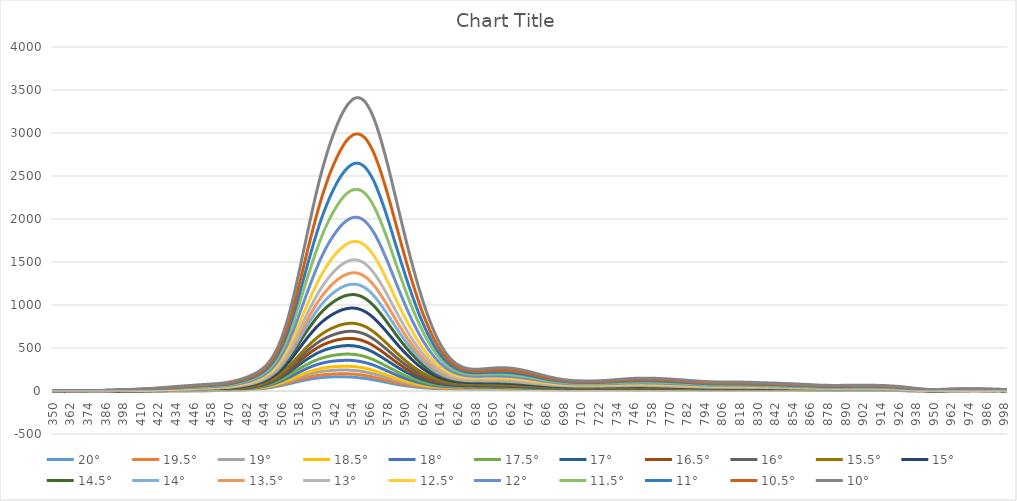
| Category | 20° | 19.5° | 19° | 18.5° | 18° | 17.5° | 17° | 16.5° | 16° | 15.5° | 15° | 14.5° | 14° | 13.5° | 13° | 12.5° | 12° | 11.5° | 11° | 10.5° | 10° |
|---|---|---|---|---|---|---|---|---|---|---|---|---|---|---|---|---|---|---|---|---|---|
| 350.0 | 1.52 | -0.59 | 0.26 | -0.31 | -1.47 | -1.32 | 0.79 | -0.45 | -0.72 | -1.17 | -0.01 | -0.98 | 0.43 | 0 | -0.06 | 1.21 | 1.59 | 1.07 | 0.85 | 0.5 | 2.93 |
| 351.0 | -1.15 | -1.71 | 1.3 | -3.11 | -1.22 | 1.24 | -2.55 | -0.75 | -0.83 | -0.73 | -0.71 | -2.25 | -0.19 | -0.07 | -0.47 | 0.65 | -0.83 | 0.38 | -0.15 | -0.22 | -1.25 |
| 352.0 | -2.8 | -3.49 | -2.21 | -5.01 | -5.15 | -3.96 | -3.53 | -0.44 | -1.16 | -2.94 | -5.09 | -3.12 | -2.6 | -2.66 | -4.13 | -4.14 | -2.17 | -2.5 | -2.17 | -0.65 | -0.27 |
| 353.0 | 0.55 | -0.15 | 0.27 | -0.79 | -1.43 | -0.35 | 1.25 | -0.98 | 1.07 | 1.13 | -1.53 | -0.49 | 0.92 | -0.69 | 2.54 | 2.76 | -0.43 | 1.66 | 1.54 | 3.29 | 1.27 |
| 354.0 | -1.59 | -3.32 | -1.5 | -2.14 | -2.57 | -1.73 | -1.11 | -3.06 | -3.25 | -0.67 | -2.63 | -0.78 | -4.19 | -2.53 | -1.61 | -0.76 | -0.88 | 0.35 | 0.96 | 0.85 | 0.75 |
| 355.0 | -0.29 | 0.77 | 1.08 | 0.32 | 0.42 | -0.54 | 0.59 | -0.18 | 1.97 | 1.49 | 1.57 | 1.94 | 2.6 | 1.91 | 3.36 | 0.03 | 2.57 | 1.62 | 2.28 | 2.79 | 4.31 |
| 356.0 | -2.22 | -3.11 | -1.88 | -1.41 | -1.41 | -1.31 | -3.02 | -2.01 | 0.74 | -0.1 | -1.8 | -0.83 | -4.41 | 0.34 | -1.16 | -0.04 | -1.09 | -0.78 | -0.17 | -1.31 | -0.05 |
| 357.0 | 0.23 | -0.65 | 0.11 | -1.23 | 0.39 | 0.42 | -0.18 | 0.53 | 0.28 | 0.98 | 1.96 | 0.66 | 0.4 | 1.66 | -1.33 | 2.32 | 3.18 | 2.72 | 2.98 | 4.31 | -0.12 |
| 358.0 | -5.18 | -4.65 | -5.39 | -5.48 | -6.72 | -4.16 | -6.69 | -6.45 | -6.88 | -6.7 | -5.85 | -5.43 | -5.32 | -6.75 | -5.41 | -6.02 | -5.02 | -4.41 | -4.89 | -4.73 | -4.09 |
| 359.0 | -0.86 | -2.18 | -1.03 | -0.49 | -0.65 | -2.62 | 0.06 | -1.74 | 1.65 | -2.55 | -0.62 | -1.4 | -0.55 | 0.27 | -0.09 | 2.13 | -0.73 | -0.3 | 0.93 | 0.2 | 2.89 |
| 360.0 | -0.33 | -1.02 | -0.65 | -1.02 | -1.08 | -0.7 | -0.74 | -0.7 | -0.28 | -0.43 | -0.4 | 0.21 | -0.36 | -0.16 | 0.36 | 0.96 | 0.72 | 0.66 | 1.38 | 1.39 | 2.11 |
| 361.0 | -0.55 | -1.04 | -0.61 | -1.07 | -0.93 | -0.69 | -0.81 | -0.65 | -0.17 | -0.37 | -0.29 | 0.37 | -0.37 | -0.17 | 0.47 | 1.15 | 0.73 | 0.74 | 1.49 | 1.54 | 2.15 |
| 362.0 | -0.53 | -0.84 | -0.68 | -0.87 | -0.93 | -0.69 | -0.53 | -0.56 | -0.04 | -0.18 | -0.1 | 0.65 | -0.21 | -0.01 | 0.67 | 1.28 | 0.95 | 0.99 | 1.78 | 1.77 | 2.44 |
| 363.0 | -0.54 | -0.73 | -0.58 | -0.6 | -0.83 | -0.49 | -0.34 | -0.54 | 0.11 | -0.06 | 0.21 | 0.86 | -0.05 | 0.17 | 0.9 | 1.62 | 1.08 | 1.28 | 1.96 | 1.97 | 2.66 |
| 364.0 | -0.53 | -0.61 | -0.57 | -0.52 | -0.7 | -0.51 | -0.3 | -0.45 | 0.14 | -0.13 | 0.31 | 0.96 | 0.08 | 0.3 | 0.89 | 1.77 | 1.3 | 1.33 | 2.08 | 2.03 | 2.79 |
| 365.0 | -0.47 | -0.44 | -0.48 | -0.38 | -0.41 | -0.45 | -0.2 | -0.23 | 0.34 | 0 | 0.54 | 1.13 | 0.42 | 0.56 | 1.15 | 2.01 | 1.64 | 1.52 | 2.24 | 2.16 | 3.04 |
| 366.0 | -0.33 | -0.51 | -0.43 | -0.38 | -0.34 | -0.34 | -0.17 | -0.11 | 0.24 | 0.13 | 0.57 | 1.2 | 0.53 | 0.63 | 1.08 | 2.24 | 1.76 | 1.71 | 2.41 | 2.32 | 3.07 |
| 367.0 | -0.2 | -0.35 | -0.32 | -0.39 | -0.25 | -0.26 | -0.02 | 0.08 | 0.24 | 0.17 | 0.8 | 1.35 | 0.87 | 0.77 | 1.26 | 2.23 | 1.97 | 2 | 2.65 | 2.55 | 3.35 |
| 368.0 | -0.29 | -0.29 | -0.31 | -0.25 | -0.32 | -0.32 | 0.08 | 0.16 | 0.4 | 0.25 | 0.74 | 1.43 | 0.96 | 0.88 | 1.54 | 2.43 | 1.98 | 2.09 | 2.8 | 2.63 | 3.69 |
| 369.0 | -0.04 | -0.15 | -0.02 | -0.02 | 0.01 | -0.09 | 0.48 | 0.49 | 0.74 | 0.61 | 1.14 | 1.75 | 1.38 | 1.36 | 1.96 | 2.84 | 2.45 | 2.51 | 3.3 | 3.13 | 4.1 |
| 370.0 | -0.08 | -0.02 | 0.12 | 0.05 | 0.13 | 0.04 | 0.6 | 0.65 | 0.63 | 0.76 | 1.28 | 1.99 | 1.54 | 1.42 | 2.1 | 2.93 | 2.68 | 2.7 | 3.61 | 3.33 | 4.31 |
| 371.0 | 0 | 0.06 | 0.12 | 0.04 | 0.18 | 0.22 | 0.64 | 0.68 | 0.79 | 0.88 | 1.31 | 2.1 | 1.66 | 1.53 | 2.23 | 3.12 | 2.8 | 2.82 | 3.91 | 3.62 | 4.47 |
| 372.0 | 0.05 | 0.16 | 0.23 | 0.15 | 0.36 | 0.24 | 0.84 | 0.89 | 0.82 | 0.88 | 1.4 | 2.24 | 1.75 | 1.76 | 2.32 | 3.3 | 2.96 | 3.08 | 4.11 | 3.88 | 4.78 |
| 373.0 | -0.1 | -0.08 | 0.11 | -0.1 | 0.22 | 0.15 | 0.78 | 0.66 | 0.72 | 0.9 | 1.35 | 2.13 | 1.7 | 1.7 | 2.27 | 3.32 | 2.93 | 3.07 | 4.16 | 3.91 | 4.74 |
| 374.0 | -0.1 | 0.03 | 0.31 | -0.13 | 0.24 | 0.24 | 0.93 | 0.69 | 0.77 | 1.18 | 1.29 | 2.03 | 2.01 | 1.74 | 2.36 | 3.34 | 3.04 | 3.35 | 4.38 | 4.15 | 4.88 |
| 375.0 | -0.15 | 0.05 | 0.42 | -0.28 | 0.19 | 0.26 | 0.91 | 0.67 | 0.65 | 1.35 | 1.32 | 1.94 | 1.98 | 1.77 | 2.36 | 3.4 | 3.15 | 3.41 | 4.55 | 4.38 | 5.05 |
| 376.0 | -0.25 | 0.04 | 0.45 | -0.09 | 0.2 | 0.35 | 0.91 | 0.7 | 0.78 | 1.39 | 1.47 | 1.99 | 2.05 | 1.77 | 2.37 | 3.52 | 3.41 | 3.68 | 4.84 | 4.53 | 5.25 |
| 377.0 | -0.23 | 0.05 | 0.42 | -0.04 | 0.13 | 0.26 | 0.9 | 0.74 | 0.79 | 1.43 | 1.48 | 2.06 | 2.16 | 1.83 | 2.49 | 3.42 | 3.52 | 3.71 | 4.97 | 4.64 | 5.41 |
| 378.0 | -0.15 | 0.03 | 0.25 | 0.09 | 0.24 | 0.33 | 0.91 | 1.02 | 0.94 | 1.49 | 1.54 | 2.11 | 2.42 | 1.98 | 2.64 | 3.48 | 3.67 | 3.91 | 5.18 | 4.82 | 5.58 |
| 379.0 | -0.25 | 0.21 | 0.11 | 0.08 | 0.3 | 0.17 | 0.86 | 0.96 | 0.91 | 1.52 | 1.51 | 2.18 | 2.46 | 2.1 | 2.67 | 3.39 | 3.83 | 4.13 | 5.31 | 5.06 | 5.73 |
| 380.0 | 0.06 | 0.36 | 0.38 | 0.19 | 0.54 | 0.37 | 1.09 | 1.28 | 1.19 | 1.76 | 1.79 | 2.36 | 2.75 | 2.29 | 2.91 | 3.66 | 4.29 | 4.54 | 5.65 | 5.47 | 6.26 |
| 381.0 | 0.1 | 0.38 | 0.44 | 0.28 | 0.64 | 0.37 | 1.24 | 1.38 | 1.34 | 1.83 | 1.94 | 2.53 | 2.96 | 2.53 | 3.1 | 3.82 | 4.51 | 4.77 | 5.92 | 5.7 | 6.53 |
| 382.0 | 0.14 | 0.25 | 0.32 | 0.27 | 0.62 | 0.41 | 1.22 | 1.41 | 1.28 | 1.87 | 2.03 | 2.44 | 3.01 | 2.66 | 3.15 | 3.76 | 4.68 | 4.95 | 6.11 | 5.84 | 6.75 |
| 383.0 | 0.1 | 0.06 | 0.28 | 0.11 | 0.68 | 0.34 | 1 | 1.48 | 1.26 | 1.81 | 2 | 2.42 | 2.92 | 2.65 | 3.11 | 3.81 | 4.71 | 4.95 | 6.1 | 5.92 | 6.87 |
| 384.0 | 0.2 | 0.06 | 0.22 | 0.02 | 0.83 | 0.34 | 1.09 | 1.57 | 1.3 | 1.87 | 1.96 | 2.56 | 3.04 | 2.78 | 3.38 | 3.82 | 5.02 | 5.1 | 6.45 | 6.24 | 7.22 |
| 385.0 | 0.29 | 0.03 | 0.29 | 0.09 | 0.82 | 0.56 | 1.15 | 1.72 | 1.37 | 2.14 | 2.19 | 2.81 | 3.22 | 2.99 | 3.62 | 3.94 | 5.22 | 5.45 | 6.89 | 6.72 | 7.76 |
| 386.0 | 0.3 | 0.16 | 0.36 | 0.21 | 0.74 | 0.73 | 1.22 | 1.75 | 1.48 | 2.3 | 2.36 | 2.94 | 3.27 | 3.17 | 3.73 | 4.06 | 5.4 | 5.64 | 7.15 | 7.14 | 8.14 |
| 387.0 | 0.37 | 0.36 | 0.4 | 0.37 | 0.81 | 0.91 | 1.31 | 1.84 | 1.77 | 2.32 | 2.46 | 3.08 | 3.4 | 3.33 | 4.01 | 4.34 | 5.57 | 5.99 | 7.37 | 7.55 | 8.58 |
| 388.0 | 0.36 | 0.4 | 0.48 | 0.51 | 0.8 | 1.03 | 1.39 | 1.94 | 1.88 | 2.49 | 2.54 | 3.09 | 3.57 | 3.52 | 4.12 | 4.72 | 5.94 | 6.19 | 7.7 | 8.01 | 9.01 |
| 389.0 | 0.42 | 0.27 | 0.42 | 0.39 | 0.91 | 1.05 | 1.37 | 1.92 | 1.76 | 2.42 | 2.69 | 3.07 | 3.73 | 3.47 | 4.17 | 4.63 | 6.16 | 6.35 | 7.79 | 8.23 | 9.18 |
| 390.0 | 0.33 | 0.45 | 0.39 | 0.47 | 0.91 | 1 | 1.38 | 2.05 | 1.76 | 2.6 | 2.89 | 3.22 | 3.83 | 3.57 | 4.24 | 4.9 | 6.28 | 6.64 | 8.17 | 8.54 | 9.67 |
| 391.0 | 0.55 | 0.57 | 0.46 | 0.55 | 1.04 | 1.14 | 1.53 | 2.19 | 1.94 | 2.98 | 3.15 | 3.47 | 4.13 | 4 | 4.67 | 5.28 | 6.65 | 7.17 | 8.46 | 9.14 | 10.18 |
| 392.0 | 0.4 | 0.49 | 0.51 | 0.46 | 1.05 | 1.11 | 1.58 | 2.24 | 1.91 | 2.98 | 3.22 | 3.5 | 4.12 | 4.19 | 4.85 | 5.4 | 6.97 | 7.51 | 8.58 | 9.62 | 10.86 |
| 393.0 | 0.39 | 0.4 | 0.42 | 0.37 | 1.08 | 1.27 | 1.64 | 2.27 | 2.08 | 3.04 | 3.44 | 3.7 | 4.33 | 4.45 | 5.18 | 5.8 | 7.28 | 7.89 | 8.99 | 10.2 | 11.49 |
| 394.0 | 0.3 | 0.57 | 0.47 | 0.52 | 1.37 | 1.39 | 1.75 | 2.44 | 2.3 | 3.25 | 3.7 | 4.1 | 4.67 | 4.97 | 5.49 | 6.23 | 7.72 | 8.55 | 9.61 | 10.95 | 12.24 |
| 395.0 | 0.42 | 0.66 | 0.56 | 0.7 | 1.53 | 1.53 | 1.88 | 2.58 | 2.5 | 3.26 | 3.99 | 4.4 | 4.76 | 5.42 | 5.85 | 6.63 | 8.25 | 8.98 | 10.14 | 11.47 | 12.91 |
| 396.0 | 0.38 | 0.6 | 0.46 | 0.66 | 1.53 | 1.53 | 1.85 | 2.57 | 2.71 | 3.2 | 4.11 | 4.59 | 5.01 | 5.58 | 6.12 | 7.07 | 8.64 | 9.43 | 10.59 | 11.99 | 13.45 |
| 397.0 | 0.32 | 0.64 | 0.6 | 0.68 | 1.67 | 1.65 | 2.03 | 2.73 | 2.75 | 3.38 | 4.36 | 4.87 | 5.37 | 5.97 | 6.52 | 7.62 | 8.94 | 9.9 | 11.05 | 12.6 | 14.12 |
| 398.0 | 0.36 | 0.64 | 0.68 | 0.62 | 1.64 | 1.77 | 2.11 | 2.77 | 3 | 3.54 | 4.55 | 5.02 | 5.61 | 6.26 | 6.73 | 8 | 9.34 | 10.43 | 11.61 | 13.28 | 14.75 |
| 399.0 | 0.41 | 0.61 | 0.79 | 0.56 | 1.62 | 1.83 | 2.31 | 2.78 | 3.12 | 3.7 | 4.84 | 5.21 | 5.74 | 6.54 | 7.03 | 8.4 | 9.78 | 11.07 | 12.09 | 13.92 | 15.55 |
| 400.0 | 0.47 | 0.78 | 0.95 | 0.6 | 1.72 | 2.03 | 2.45 | 2.88 | 3.22 | 3.85 | 5.2 | 5.48 | 6.17 | 6.84 | 7.34 | 8.75 | 10.05 | 11.62 | 12.77 | 14.61 | 16.36 |
| 401.0 | 0.24 | 0.75 | 0.93 | 0.55 | 1.65 | 1.97 | 2.33 | 2.82 | 3.17 | 3.89 | 5.38 | 5.7 | 6.35 | 7.11 | 7.66 | 8.9 | 10.26 | 11.99 | 13.39 | 15 | 16.81 |
| 402.0 | 0.15 | 0.6 | 0.91 | 0.41 | 1.6 | 1.86 | 2.18 | 2.91 | 3.11 | 3.88 | 5.51 | 5.71 | 6.55 | 7.28 | 7.87 | 9.25 | 10.37 | 12.43 | 13.83 | 15.51 | 17.27 |
| 403.0 | 0.23 | 0.9 | 1.04 | 0.52 | 1.68 | 2.01 | 2.42 | 3.07 | 3.29 | 4.13 | 5.87 | 6.19 | 6.87 | 7.67 | 8.24 | 9.74 | 10.93 | 13.01 | 14.54 | 16.36 | 18.11 |
| 404.0 | 0.3 | 0.94 | 1.1 | 0.71 | 1.73 | 2.18 | 2.69 | 3.18 | 3.35 | 4.32 | 6.06 | 6.48 | 7.25 | 8.07 | 8.52 | 10.15 | 11.43 | 13.67 | 15.28 | 17.16 | 19.02 |
| 405.0 | 0.36 | 1.04 | 1.25 | 0.9 | 1.84 | 2.32 | 2.75 | 3.27 | 3.41 | 4.56 | 6.41 | 6.68 | 7.56 | 8.44 | 8.85 | 10.69 | 11.89 | 14.34 | 15.86 | 17.87 | 19.78 |
| 406.0 | 0.18 | 1.02 | 1.35 | 0.97 | 1.97 | 2.24 | 2.81 | 3.37 | 3.61 | 4.73 | 6.6 | 6.94 | 7.7 | 8.75 | 9.23 | 10.94 | 12.41 | 14.82 | 16.37 | 18.38 | 20.49 |
| 407.0 | 0.3 | 0.9 | 1.4 | 1.01 | 2.05 | 2.35 | 2.97 | 3.63 | 3.73 | 4.82 | 6.81 | 7.1 | 8.1 | 9.06 | 9.66 | 11.35 | 12.79 | 15.41 | 16.97 | 19.01 | 21.28 |
| 408.0 | 0.15 | 0.8 | 1.27 | 0.91 | 2.14 | 2.18 | 2.95 | 3.68 | 3.69 | 4.95 | 6.9 | 7.29 | 8.31 | 9.37 | 9.97 | 11.59 | 13.28 | 15.82 | 17.47 | 19.49 | 21.95 |
| 409.0 | 0.27 | 0.84 | 1.26 | 1.06 | 2.38 | 2.27 | 3.16 | 3.75 | 3.89 | 5.03 | 7.14 | 7.75 | 8.6 | 9.74 | 10.44 | 12.04 | 13.72 | 16.36 | 18.12 | 20.17 | 22.76 |
| 410.0 | 0.46 | 1.2 | 1.46 | 1.31 | 2.44 | 2.5 | 3.38 | 4.02 | 4.09 | 5.36 | 7.48 | 8.34 | 9.02 | 10.28 | 10.95 | 12.63 | 14.29 | 17.12 | 19.06 | 21.02 | 23.77 |
| 411.0 | 0.7 | 1.23 | 1.72 | 1.5 | 2.59 | 2.73 | 3.53 | 4.23 | 4.48 | 5.54 | 7.65 | 8.66 | 9.38 | 10.78 | 11.55 | 13.12 | 14.93 | 17.77 | 19.75 | 21.79 | 24.64 |
| 412.0 | 0.6 | 1.16 | 1.65 | 1.49 | 2.48 | 2.74 | 3.52 | 4.27 | 4.69 | 5.45 | 7.73 | 8.94 | 9.68 | 11.11 | 11.78 | 13.44 | 15.4 | 18.21 | 20.37 | 22.39 | 25.37 |
| 413.0 | 0.72 | 1.2 | 1.63 | 1.56 | 2.52 | 2.82 | 3.75 | 4.4 | 4.91 | 5.67 | 8.03 | 9.27 | 9.98 | 11.44 | 12.11 | 13.98 | 15.95 | 18.73 | 21.22 | 23.06 | 25.95 |
| 414.0 | 0.58 | 1.35 | 1.65 | 1.72 | 2.58 | 2.79 | 3.88 | 4.5 | 4.86 | 5.91 | 8.17 | 9.48 | 10.31 | 11.67 | 12.4 | 14.35 | 16.53 | 19.34 | 21.82 | 23.72 | 26.8 |
| 415.0 | 0.75 | 1.39 | 1.76 | 1.84 | 2.53 | 2.81 | 4.04 | 4.76 | 5.04 | 6.1 | 8.42 | 9.88 | 10.76 | 11.89 | 12.92 | 14.85 | 17.11 | 19.87 | 22.56 | 24.34 | 27.68 |
| 416.0 | 0.82 | 1.41 | 1.83 | 1.96 | 2.6 | 3.1 | 4.1 | 4.95 | 5.23 | 6.33 | 8.62 | 10.28 | 11.1 | 12.3 | 13.44 | 15.41 | 17.66 | 20.56 | 23.31 | 25.21 | 28.78 |
| 417.0 | 0.88 | 1.58 | 2.05 | 2.11 | 2.67 | 3.3 | 4.36 | 5.27 | 5.6 | 6.55 | 8.98 | 10.67 | 11.6 | 12.88 | 14.04 | 15.91 | 18.37 | 21.31 | 24.24 | 26.19 | 29.97 |
| 418.0 | 0.98 | 1.56 | 2 | 2.27 | 2.79 | 3.36 | 4.51 | 5.56 | 5.87 | 6.68 | 9.08 | 10.94 | 11.98 | 13.4 | 14.57 | 16.3 | 19.08 | 22.06 | 25.06 | 27.1 | 31.16 |
| 419.0 | 0.99 | 1.63 | 2.12 | 2.52 | 3.03 | 3.6 | 4.73 | 5.84 | 6.15 | 6.99 | 9.42 | 11.43 | 12.59 | 13.98 | 15.06 | 17.01 | 19.92 | 22.89 | 25.9 | 28.08 | 32.39 |
| 420.0 | 0.99 | 1.74 | 2.25 | 2.66 | 3.26 | 3.86 | 4.76 | 6.02 | 6.4 | 7.3 | 9.75 | 11.93 | 13.14 | 14.47 | 15.68 | 17.74 | 20.71 | 23.69 | 26.8 | 29.03 | 33.48 |
| 421.0 | 1.05 | 1.67 | 2.24 | 2.87 | 3.35 | 4.09 | 5.06 | 6.35 | 6.83 | 7.6 | 10.08 | 12.42 | 13.67 | 15.21 | 16.27 | 18.4 | 21.64 | 24.61 | 27.68 | 29.97 | 34.85 |
| 422.0 | 1.06 | 1.72 | 2.2 | 3.05 | 3.39 | 4.25 | 5.38 | 6.52 | 7.24 | 7.99 | 10.51 | 12.85 | 14.28 | 15.8 | 16.86 | 19.23 | 22.44 | 25.75 | 28.51 | 31.29 | 36.3 |
| 423.0 | 1.24 | 1.93 | 2.18 | 3.18 | 3.65 | 4.62 | 5.75 | 6.82 | 7.56 | 8.55 | 11.04 | 13.47 | 14.84 | 16.5 | 17.65 | 19.96 | 23.51 | 26.69 | 29.55 | 32.5 | 37.74 |
| 424.0 | 1.33 | 1.96 | 2.29 | 3.29 | 3.79 | 4.86 | 6.01 | 7.09 | 7.95 | 8.9 | 11.29 | 13.87 | 15.5 | 17.18 | 18.23 | 20.67 | 24.28 | 27.62 | 30.63 | 33.59 | 39.14 |
| 425.0 | 1.32 | 2.18 | 2.45 | 3.35 | 3.94 | 4.98 | 6.21 | 7.36 | 8.37 | 9.24 | 11.78 | 14.36 | 16.01 | 17.62 | 18.97 | 21.48 | 25.06 | 28.39 | 31.82 | 34.8 | 40.36 |
| 426.0 | 1.38 | 2.16 | 2.52 | 3.28 | 4.11 | 5.19 | 6.45 | 7.62 | 8.76 | 9.55 | 12.03 | 14.85 | 16.43 | 18.11 | 19.37 | 22.2 | 25.93 | 29.17 | 32.94 | 36.02 | 41.63 |
| 427.0 | 1.61 | 2.29 | 2.65 | 3.45 | 4.25 | 5.54 | 6.73 | 7.93 | 9.06 | 9.93 | 12.43 | 15.38 | 17.13 | 18.77 | 20.09 | 23.08 | 26.82 | 30.1 | 34.05 | 37.32 | 42.97 |
| 428.0 | 1.53 | 2.31 | 2.58 | 3.5 | 4.34 | 5.71 | 6.9 | 8.07 | 9.33 | 10.19 | 12.78 | 15.96 | 17.53 | 19.23 | 20.58 | 23.75 | 27.62 | 30.91 | 35.1 | 38.46 | 44.06 |
| 429.0 | 1.57 | 2.37 | 2.73 | 3.54 | 4.44 | 5.98 | 7.2 | 8.35 | 9.6 | 10.42 | 13.34 | 16.4 | 18.02 | 19.68 | 21.18 | 24.39 | 28.39 | 31.79 | 36.31 | 39.71 | 45.42 |
| 430.0 | 1.48 | 2.45 | 2.72 | 3.48 | 4.42 | 6.07 | 7.29 | 8.57 | 9.84 | 10.96 | 13.67 | 16.77 | 18.49 | 20.26 | 21.74 | 24.87 | 29.12 | 32.77 | 37.3 | 40.7 | 46.66 |
| 431.0 | 1.51 | 2.29 | 2.87 | 3.58 | 4.8 | 6.29 | 7.54 | 8.82 | 10.29 | 11.43 | 14.08 | 17.22 | 19.03 | 20.92 | 22.49 | 25.81 | 30.17 | 33.78 | 38.41 | 42 | 48.3 |
| 432.0 | 1.41 | 2.31 | 2.85 | 3.58 | 5.01 | 6.49 | 7.84 | 9.04 | 10.59 | 11.75 | 14.53 | 17.64 | 19.59 | 21.37 | 23.04 | 26.51 | 31.02 | 34.78 | 39.54 | 43.14 | 49.62 |
| 433.0 | 1.51 | 2.28 | 3.08 | 3.63 | 5.35 | 6.73 | 7.94 | 9.4 | 10.83 | 12.13 | 15.08 | 18.03 | 20.14 | 21.88 | 23.59 | 27.29 | 31.88 | 35.9 | 40.74 | 44.39 | 51.02 |
| 434.0 | 1.59 | 2.3 | 3.14 | 3.81 | 5.54 | 6.95 | 8.09 | 9.76 | 11.18 | 12.44 | 15.6 | 18.65 | 20.87 | 22.57 | 24.38 | 27.95 | 32.64 | 37.08 | 41.86 | 45.53 | 52.42 |
| 435.0 | 1.66 | 2.25 | 3.35 | 3.95 | 5.77 | 7.22 | 8.2 | 10.13 | 11.57 | 12.77 | 15.93 | 19.21 | 21.27 | 23.17 | 25.12 | 28.58 | 33.42 | 37.96 | 43.01 | 46.65 | 53.76 |
| 436.0 | 1.78 | 2.29 | 3.51 | 4.13 | 6.06 | 7.63 | 8.61 | 10.47 | 11.96 | 13.12 | 16.53 | 19.6 | 21.88 | 23.9 | 25.89 | 29.35 | 34.4 | 38.95 | 44.26 | 47.86 | 55.27 |
| 437.0 | 1.71 | 2.37 | 3.46 | 4.12 | 6.1 | 7.66 | 8.69 | 10.71 | 12.16 | 13.37 | 17.14 | 20.02 | 22.33 | 24.23 | 26.31 | 29.96 | 35.06 | 39.72 | 45.21 | 48.84 | 56.36 |
| 438.0 | 1.72 | 2.43 | 3.45 | 4.08 | 6.24 | 7.77 | 8.88 | 10.88 | 12.3 | 13.82 | 17.35 | 20.6 | 22.77 | 24.59 | 26.81 | 30.63 | 35.71 | 40.56 | 45.99 | 49.86 | 57.56 |
| 439.0 | 1.74 | 2.44 | 3.55 | 4.16 | 6.28 | 8.01 | 9.09 | 10.84 | 12.61 | 14.24 | 17.88 | 21.1 | 23.13 | 24.99 | 27.34 | 31.35 | 36.46 | 41.43 | 46.92 | 51.06 | 58.77 |
| 440.0 | 1.9 | 2.56 | 3.75 | 4.31 | 6.53 | 8.28 | 9.4 | 11.29 | 12.99 | 14.69 | 18.39 | 21.56 | 23.68 | 25.66 | 28.12 | 32.08 | 37.21 | 42.4 | 48.17 | 52.26 | 60.01 |
| 441.0 | 2.01 | 2.71 | 3.9 | 4.46 | 6.63 | 8.36 | 9.76 | 11.59 | 13.34 | 15.02 | 18.81 | 21.95 | 24.14 | 26.24 | 28.66 | 32.58 | 37.89 | 43.37 | 49.23 | 53.44 | 61.3 |
| 442.0 | 2.13 | 2.79 | 4.01 | 4.5 | 6.83 | 8.49 | 10.07 | 11.85 | 13.56 | 15.41 | 19.28 | 22.37 | 24.46 | 26.55 | 29.41 | 33.28 | 38.62 | 44.06 | 50.26 | 54.59 | 62.32 |
| 443.0 | 2.28 | 3.01 | 4.19 | 4.66 | 7.29 | 8.71 | 10.3 | 12.28 | 13.76 | 15.83 | 19.63 | 22.94 | 24.84 | 27.03 | 29.84 | 33.74 | 39.35 | 44.68 | 51.29 | 55.78 | 63.42 |
| 444.0 | 2.44 | 3.27 | 4.49 | 5.07 | 7.61 | 8.98 | 10.59 | 12.67 | 14.26 | 16.35 | 20.09 | 23.53 | 25.52 | 27.58 | 30.46 | 34.56 | 40.23 | 45.72 | 52.46 | 57.13 | 64.93 |
| 445.0 | 2.45 | 3.26 | 4.64 | 5.1 | 7.69 | 9.04 | 10.7 | 12.72 | 14.45 | 16.56 | 20.26 | 23.81 | 25.73 | 27.82 | 31.12 | 35.12 | 40.72 | 46.38 | 53.22 | 58.03 | 65.88 |
| 446.0 | 2.77 | 3.3 | 4.83 | 5.35 | 7.98 | 9.28 | 10.93 | 13.09 | 14.86 | 16.97 | 20.69 | 24.29 | 26.36 | 28.6 | 31.92 | 35.84 | 41.62 | 47.41 | 54.12 | 59.24 | 67.34 |
| 447.0 | 2.76 | 3.4 | 4.96 | 5.54 | 8.12 | 9.42 | 11.12 | 13.38 | 15.05 | 17.2 | 21.19 | 24.71 | 27.02 | 29.07 | 32.68 | 36.43 | 42.23 | 48.37 | 54.95 | 60.18 | 68.55 |
| 448.0 | 2.81 | 3.46 | 5 | 5.58 | 8.26 | 9.63 | 11.31 | 13.59 | 15.37 | 17.59 | 21.68 | 25.04 | 27.41 | 29.49 | 33.18 | 37.02 | 42.87 | 49.3 | 55.92 | 61.14 | 69.67 |
| 449.0 | 3.02 | 3.68 | 5.3 | 5.74 | 8.48 | 9.83 | 11.54 | 13.84 | 15.92 | 18.1 | 21.94 | 25.54 | 28.14 | 30.17 | 33.92 | 37.91 | 43.66 | 50.39 | 57.01 | 62.26 | 71.09 |
| 450.0 | 3.17 | 3.77 | 5.43 | 5.86 | 8.51 | 10.06 | 11.77 | 14.06 | 16.25 | 18.44 | 22.27 | 26.04 | 28.62 | 30.78 | 34.47 | 38.47 | 44.43 | 51.12 | 57.69 | 63.23 | 72.16 |
| 451.0 | 3.36 | 3.9 | 5.59 | 6.11 | 8.79 | 10.27 | 12.05 | 14.42 | 16.56 | 18.74 | 22.8 | 26.7 | 28.95 | 31.2 | 35.1 | 39.34 | 45.18 | 51.94 | 58.67 | 64.36 | 73.35 |
| 452.0 | 3.44 | 4.11 | 5.68 | 6.19 | 8.73 | 10.44 | 12.27 | 14.72 | 16.88 | 18.96 | 23.27 | 27.17 | 29.46 | 31.78 | 35.65 | 39.87 | 45.72 | 52.89 | 59.71 | 65.4 | 74.34 |
| 453.0 | 3.65 | 4.21 | 5.79 | 6.32 | 8.83 | 10.65 | 12.36 | 15.05 | 17.17 | 19.29 | 23.63 | 27.71 | 29.98 | 32.32 | 36.32 | 40.28 | 46.32 | 53.62 | 60.48 | 66.42 | 75.44 |
| 454.0 | 3.75 | 4.39 | 5.7 | 6.63 | 8.88 | 10.9 | 12.79 | 15.24 | 17.51 | 19.71 | 23.91 | 28.07 | 30.34 | 32.77 | 37.17 | 40.76 | 46.95 | 54.35 | 61.09 | 67.34 | 76.44 |
| 455.0 | 3.81 | 4.57 | 5.96 | 6.85 | 9.01 | 11.11 | 13.12 | 15.48 | 17.76 | 20.12 | 24.35 | 28.49 | 30.8 | 33.31 | 37.74 | 41.44 | 47.7 | 55.11 | 62 | 68.34 | 77.58 |
| 456.0 | 3.95 | 4.81 | 6.19 | 7.04 | 9.29 | 11.37 | 13.43 | 15.63 | 18.14 | 20.43 | 24.89 | 29.1 | 31.38 | 33.94 | 38.21 | 42.18 | 48.51 | 56.36 | 62.98 | 69.55 | 78.67 |
| 457.0 | 3.98 | 5.08 | 6.33 | 7.1 | 9.35 | 11.44 | 13.53 | 15.76 | 18.43 | 20.67 | 25.24 | 29.5 | 31.82 | 34.34 | 38.62 | 42.74 | 49.09 | 57.13 | 63.61 | 70.89 | 79.5 |
| 458.0 | 4.13 | 5.26 | 6.63 | 7.36 | 9.65 | 11.75 | 13.94 | 16.12 | 18.94 | 21.16 | 25.66 | 30.14 | 32.46 | 35.08 | 39.43 | 43.51 | 50.05 | 57.98 | 64.67 | 72.05 | 80.86 |
| 459.0 | 4.31 | 5.43 | 6.83 | 7.84 | 9.97 | 12.11 | 14.31 | 16.49 | 19.38 | 21.54 | 26.33 | 30.62 | 33.01 | 35.87 | 40.26 | 44.08 | 50.81 | 58.85 | 65.73 | 73.18 | 82.09 |
| 460.0 | 4.62 | 5.76 | 7.2 | 8.07 | 10.31 | 12.33 | 14.76 | 17.05 | 19.69 | 22.12 | 26.94 | 31.29 | 33.84 | 36.74 | 41.06 | 44.65 | 51.78 | 59.81 | 66.86 | 74.3 | 83.39 |
| 461.0 | 4.62 | 5.94 | 7.32 | 8.27 | 10.5 | 12.49 | 15.17 | 17.43 | 20.01 | 22.46 | 27.38 | 31.85 | 34.35 | 37.23 | 41.77 | 45.34 | 52.57 | 60.85 | 67.86 | 75.56 | 84.76 |
| 462.0 | 4.65 | 6.1 | 7.44 | 8.32 | 10.59 | 12.66 | 15.35 | 17.77 | 20.3 | 22.76 | 27.94 | 32.46 | 35.03 | 37.79 | 42.49 | 46.2 | 53.55 | 61.55 | 69.02 | 76.88 | 85.97 |
| 463.0 | 4.5 | 6.1 | 7.53 | 8.5 | 10.78 | 12.8 | 15.53 | 18.06 | 20.69 | 23.03 | 28.43 | 32.99 | 35.72 | 38.56 | 43.03 | 47.07 | 54.52 | 62.59 | 70.25 | 78.12 | 87.49 |
| 464.0 | 4.65 | 6.21 | 7.76 | 8.84 | 10.87 | 13.09 | 15.85 | 18.52 | 21.29 | 23.49 | 29.19 | 33.7 | 36.64 | 39.59 | 44.14 | 48.13 | 55.64 | 63.94 | 71.6 | 79.71 | 89.01 |
| 465.0 | 4.69 | 6.29 | 7.86 | 9.01 | 11.04 | 13.33 | 16.26 | 19.08 | 21.61 | 23.81 | 29.82 | 34.44 | 37.42 | 40.46 | 44.91 | 49.07 | 56.69 | 65.25 | 72.94 | 81.14 | 90.6 |
| 466.0 | 4.89 | 6.67 | 8 | 9.46 | 11.52 | 13.86 | 16.79 | 19.8 | 22.31 | 24.54 | 30.85 | 35.55 | 38.61 | 41.64 | 46.02 | 50.35 | 58.22 | 66.96 | 74.75 | 83.01 | 92.84 |
| 467.0 | 5.05 | 7.08 | 8.25 | 9.86 | 11.9 | 14.29 | 17.44 | 20.34 | 22.88 | 25.25 | 31.81 | 36.53 | 39.7 | 42.75 | 47.12 | 51.61 | 59.73 | 68.69 | 76.62 | 84.92 | 95.11 |
| 468.0 | 5.38 | 7.42 | 8.41 | 10.29 | 12.34 | 14.79 | 18.08 | 21.06 | 23.48 | 26.18 | 32.73 | 37.8 | 40.94 | 44.09 | 48.45 | 53.16 | 61.52 | 70.55 | 78.8 | 87.26 | 97.62 |
| 469.0 | 5.7 | 7.7 | 8.74 | 10.66 | 12.79 | 15.11 | 18.63 | 21.75 | 24.28 | 26.74 | 33.73 | 39.03 | 42.1 | 45.57 | 49.79 | 54.71 | 63.17 | 72.7 | 80.95 | 89.7 | 100.22 |
| 470.0 | 5.98 | 8.04 | 9.04 | 11.12 | 13.37 | 15.74 | 19.31 | 22.64 | 25.01 | 27.65 | 35.11 | 40.2 | 43.41 | 47.11 | 51.22 | 56.35 | 65.21 | 75.09 | 83.43 | 92.37 | 103.26 |
| 471.0 | 6.25 | 8.58 | 9.45 | 11.7 | 14.04 | 16.42 | 20.14 | 23.66 | 26.07 | 28.8 | 36.4 | 41.7 | 45.05 | 48.79 | 53.09 | 58.59 | 67.4 | 77.76 | 86.4 | 95.47 | 106.78 |
| 472.0 | 6.57 | 8.94 | 9.94 | 12.27 | 14.6 | 17.19 | 21.19 | 24.69 | 27.11 | 29.96 | 37.69 | 43.03 | 46.89 | 50.72 | 54.86 | 60.74 | 69.83 | 80.57 | 89.32 | 98.77 | 110.2 |
| 473.0 | 6.93 | 9.45 | 10.31 | 12.76 | 15.43 | 17.96 | 22.16 | 25.7 | 28.18 | 31.21 | 38.96 | 44.51 | 48.68 | 52.46 | 56.71 | 62.83 | 72.27 | 83.22 | 92.2 | 102.03 | 113.82 |
| 474.0 | 7.4 | 10 | 10.93 | 13.42 | 16.35 | 18.86 | 23.41 | 26.9 | 29.53 | 32.7 | 40.52 | 46.45 | 50.63 | 54.69 | 58.83 | 65.53 | 75.16 | 86.43 | 95.75 | 105.94 | 117.92 |
| 475.0 | 7.82 | 10.61 | 11.68 | 14.16 | 17.15 | 19.9 | 24.43 | 28.22 | 30.99 | 34.1 | 42.31 | 48.37 | 52.82 | 57.02 | 60.93 | 68.19 | 78.14 | 89.75 | 99.57 | 109.85 | 122.26 |
| 476.0 | 8.45 | 11.21 | 12.33 | 15.04 | 18.04 | 20.96 | 25.55 | 29.5 | 32.5 | 35.66 | 44.05 | 50.4 | 55.15 | 59.46 | 63.46 | 71.1 | 81.46 | 93.23 | 103.38 | 114.01 | 126.84 |
| 477.0 | 9.14 | 12.01 | 13.16 | 15.92 | 18.97 | 22.19 | 26.94 | 31.14 | 34.18 | 37.61 | 46.19 | 52.61 | 57.83 | 62.04 | 66.41 | 74.14 | 84.94 | 96.84 | 107.61 | 118.57 | 131.6 |
| 478.0 | 9.74 | 12.47 | 13.91 | 16.76 | 20.05 | 23.42 | 28.43 | 32.6 | 35.75 | 39.54 | 48.18 | 55.01 | 60.17 | 64.83 | 69.46 | 77.19 | 88.4 | 100.61 | 111.76 | 123.11 | 136.74 |
| 479.0 | 10.38 | 13.16 | 14.8 | 17.74 | 21.26 | 24.54 | 30.05 | 34.21 | 37.57 | 41.38 | 50.49 | 57.55 | 62.82 | 67.73 | 72.52 | 80.53 | 92.04 | 105.07 | 116.1 | 128.14 | 141.88 |
| 480.0 | 11.06 | 13.78 | 15.67 | 18.56 | 22.44 | 25.95 | 31.66 | 35.92 | 39.44 | 43.48 | 52.87 | 60.21 | 65.58 | 70.78 | 75.6 | 84.09 | 95.92 | 109.4 | 120.73 | 133.27 | 147.4 |
| 481.0 | 11.89 | 14.79 | 16.8 | 19.78 | 23.93 | 27.72 | 33.44 | 37.98 | 41.81 | 45.79 | 55.63 | 63.15 | 68.94 | 74.02 | 79.12 | 88.13 | 100.2 | 114.23 | 125.96 | 138.75 | 153.48 |
| 482.0 | 12.83 | 15.7 | 17.92 | 21.03 | 25.37 | 29.37 | 35.02 | 39.93 | 44.02 | 48.06 | 58.45 | 66.26 | 72.06 | 77.45 | 82.76 | 92.03 | 104.58 | 119.03 | 131 | 144.21 | 159.81 |
| 483.0 | 13.77 | 16.69 | 19.16 | 22.41 | 26.96 | 31.23 | 37.1 | 42.19 | 46.32 | 50.74 | 61.32 | 69.53 | 75.43 | 81.16 | 86.61 | 96.32 | 109.12 | 124.42 | 136.55 | 149.97 | 166.62 |
| 484.0 | 15.05 | 18.05 | 20.83 | 23.93 | 28.76 | 33.45 | 39.47 | 44.81 | 49.01 | 53.77 | 64.66 | 73.25 | 79.37 | 85.22 | 91.1 | 100.98 | 114.26 | 130.33 | 142.71 | 156.47 | 173.65 |
| 485.0 | 16.18 | 19.49 | 22.42 | 25.6 | 30.75 | 35.68 | 42.18 | 47.57 | 51.94 | 56.87 | 68.27 | 77.21 | 83.43 | 89.42 | 95.6 | 106.27 | 119.7 | 136.39 | 149.15 | 163.07 | 181.1 |
| 486.0 | 17.39 | 20.68 | 23.96 | 27.12 | 32.67 | 37.74 | 44.68 | 50.01 | 55.01 | 59.98 | 71.74 | 81.06 | 87.56 | 93.79 | 100.29 | 111.25 | 125.25 | 142.43 | 155.78 | 170.11 | 188.83 |
| 487.0 | 18.75 | 22.12 | 25.75 | 28.99 | 34.92 | 40.12 | 47.49 | 53.18 | 58.37 | 63.48 | 75.66 | 85.43 | 92.11 | 98.78 | 105.36 | 116.75 | 131.49 | 148.97 | 162.81 | 177.91 | 196.91 |
| 488.0 | 19.99 | 23.48 | 27.43 | 30.86 | 37.21 | 42.71 | 50.31 | 56.31 | 61.74 | 67.04 | 79.79 | 89.77 | 96.8 | 103.92 | 110.53 | 122.62 | 137.8 | 156.03 | 170.35 | 185.68 | 205.31 |
| 489.0 | 21.45 | 25.18 | 29.5 | 33.06 | 39.77 | 45.61 | 53.63 | 59.78 | 65.76 | 71.26 | 84.63 | 94.75 | 102.1 | 109.47 | 116.45 | 128.84 | 144.75 | 163.93 | 178.54 | 194.4 | 214.8 |
| 490.0 | 23.07 | 26.93 | 31.62 | 35.24 | 42.5 | 48.62 | 57.38 | 63.5 | 69.84 | 75.5 | 89.49 | 100.2 | 107.85 | 115.47 | 122.79 | 135.69 | 152.38 | 172.04 | 187.66 | 203.85 | 225.22 |
| 491.0 | 24.68 | 28.85 | 33.73 | 37.74 | 45.22 | 51.83 | 61.28 | 67.7 | 74.18 | 80.14 | 94.9 | 106.21 | 113.95 | 121.97 | 129.84 | 143.17 | 160.47 | 180.83 | 197.17 | 214.22 | 236.11 |
| 492.0 | 26.41 | 30.77 | 36.21 | 40.39 | 48.24 | 55.45 | 65.59 | 72.19 | 78.82 | 85.21 | 100.87 | 112.5 | 120.7 | 129.38 | 137.62 | 151.27 | 169.46 | 190.64 | 207.9 | 225.24 | 248.28 |
| 493.0 | 28.5 | 33.05 | 38.75 | 43.08 | 51.59 | 59.3 | 69.86 | 76.83 | 84 | 90.77 | 107.07 | 119.66 | 128.15 | 137.07 | 146.05 | 160.13 | 179.42 | 201.39 | 219.35 | 237.74 | 262.01 |
| 494.0 | 30.53 | 35.53 | 41.79 | 46.22 | 55.08 | 63.42 | 74.64 | 81.97 | 89.66 | 96.82 | 113.99 | 127.35 | 136.26 | 145.59 | 155.09 | 169.77 | 190.08 | 213.18 | 231.83 | 251.54 | 277.07 |
| 495.0 | 32.79 | 38.13 | 44.67 | 49.57 | 58.79 | 67.94 | 79.8 | 87.64 | 95.45 | 103.18 | 121.59 | 135.54 | 145.11 | 154.81 | 165 | 180.17 | 201.74 | 226.03 | 245.57 | 266.15 | 293.34 |
| 496.0 | 34.97 | 40.74 | 47.65 | 52.82 | 62.9 | 72.59 | 85.31 | 93.45 | 101.85 | 110.06 | 129.46 | 144.24 | 154.45 | 164.81 | 175.57 | 191.46 | 214.5 | 239.93 | 260.55 | 282.59 | 311.09 |
| 497.0 | 37.09 | 43.34 | 50.79 | 56.17 | 67.32 | 77.55 | 90.99 | 99.8 | 108.55 | 117.39 | 138.1 | 153.78 | 164.43 | 175.56 | 187.04 | 203.62 | 227.89 | 255.35 | 277.37 | 300.29 | 330.96 |
| 498.0 | 39.74 | 46.11 | 54.12 | 59.84 | 71.94 | 83.07 | 97.21 | 106.54 | 116.03 | 125.37 | 147.42 | 164.22 | 175.4 | 187.2 | 199.39 | 217.05 | 242.79 | 271.83 | 295.67 | 320.07 | 353.09 |
| 499.0 | 42.43 | 49.57 | 57.71 | 64.15 | 77.03 | 88.76 | 104.04 | 114.1 | 124.27 | 134.33 | 157.68 | 175.48 | 187.68 | 199.95 | 212.91 | 231.89 | 259.46 | 290.4 | 316.21 | 341.66 | 377.23 |
| 500.0 | 45.4 | 52.98 | 61.48 | 68.48 | 82.28 | 95.05 | 111.06 | 122.03 | 132.85 | 143.77 | 168.49 | 187.68 | 200.75 | 213.63 | 227.39 | 247.97 | 277.42 | 310.61 | 338.52 | 365.33 | 404.24 |
| 501.0 | 48.27 | 56.59 | 65.43 | 73.08 | 87.85 | 101.5 | 118.58 | 130.66 | 142.09 | 153.68 | 180.48 | 200.97 | 214.76 | 228.43 | 243.39 | 265.66 | 296.99 | 332.85 | 362.72 | 391.78 | 433.66 |
| 502.0 | 51.31 | 60.08 | 69.46 | 77.71 | 93.4 | 108.11 | 126.54 | 139.5 | 151.59 | 164.25 | 192.74 | 214.87 | 229.15 | 244.43 | 260.27 | 283.92 | 317.8 | 356.62 | 388.8 | 420.21 | 465.2 |
| 503.0 | 54.33 | 64.01 | 73.72 | 82.73 | 99.64 | 115.3 | 135.4 | 148.99 | 162.04 | 175.74 | 206.02 | 230.03 | 245.36 | 261.55 | 278.51 | 304.62 | 340.76 | 382.28 | 417.49 | 451.59 | 500.13 |
| 504.0 | 57.74 | 67.94 | 78.57 | 88.07 | 106.28 | 122.97 | 144.61 | 159.09 | 173.32 | 187.74 | 220.41 | 246.34 | 262.58 | 280.06 | 298.15 | 326.7 | 365.77 | 410.71 | 448.46 | 485.63 | 538.1 |
| 505.0 | 61.2 | 71.9 | 83.38 | 93.69 | 113.07 | 130.75 | 154.24 | 169.76 | 185.08 | 200.52 | 235.49 | 263.62 | 280.84 | 299.53 | 319.28 | 350.22 | 392.61 | 440.78 | 481.89 | 522.29 | 579.5 |
| 506.0 | 64.66 | 75.86 | 88.35 | 99.31 | 119.98 | 138.99 | 164.02 | 180.89 | 197.1 | 213.72 | 251.3 | 281.36 | 300.15 | 320.38 | 341.87 | 374.71 | 420.82 | 473.36 | 517.64 | 562.13 | 624.04 |
| 507.0 | 68.58 | 80.56 | 93.75 | 105.34 | 127.56 | 147.9 | 174.34 | 192.6 | 210.11 | 228.26 | 268.59 | 300.59 | 321.04 | 342.77 | 365.95 | 401.83 | 451.34 | 508.29 | 556.46 | 605.02 | 672.61 |
| 508.0 | 72.37 | 85.06 | 99.19 | 111.48 | 135.02 | 157.1 | 185.06 | 204.52 | 223.51 | 242.82 | 286.25 | 320.44 | 342.75 | 366 | 391.53 | 429.92 | 483.4 | 545.12 | 597.4 | 650.36 | 723.97 |
| 509.0 | 76.29 | 89.61 | 104.98 | 118.09 | 142.96 | 166.56 | 196.44 | 217.21 | 237.46 | 258.37 | 304.79 | 341.79 | 365.6 | 390.71 | 418.67 | 459.7 | 517.5 | 584.4 | 640.88 | 698.65 | 778.88 |
| 510.0 | 80.27 | 94.32 | 110.73 | 124.34 | 150.99 | 176.19 | 207.93 | 230.21 | 251.65 | 274.28 | 323.61 | 363.66 | 389.23 | 416.25 | 446.73 | 490.97 | 553.39 | 624.92 | 686.94 | 749.75 | 836.56 |
| 511.0 | 84.21 | 99.36 | 116.55 | 131.21 | 159.37 | 186.16 | 219.5 | 243.68 | 266.53 | 291.07 | 343.58 | 386.19 | 414.35 | 443.51 | 476.17 | 523.86 | 590.86 | 668.15 | 735.44 | 803.89 | 898.09 |
| 512.0 | 88.34 | 104.27 | 122.54 | 138.04 | 167.58 | 196.11 | 231.52 | 257.34 | 282.09 | 308.26 | 364.28 | 409.93 | 440.23 | 471.39 | 506.91 | 558.2 | 630.27 | 713.61 | 786.14 | 860.63 | 962.66 |
| 513.0 | 92.5 | 109.28 | 128.58 | 144.96 | 176.48 | 206.26 | 243.5 | 271.38 | 297.73 | 325.79 | 385.47 | 434.25 | 466.61 | 499.9 | 538.12 | 593.81 | 671 | 760.68 | 838.68 | 919.81 | 1030.03 |
| 514.0 | 96.52 | 114.2 | 134.77 | 151.94 | 185.36 | 216.59 | 255.99 | 285.93 | 313.98 | 343.5 | 407.14 | 459.65 | 493.91 | 529.55 | 571.02 | 630.69 | 713.39 | 809.56 | 893.61 | 981.45 | 1100.33 |
| 515.0 | 100.47 | 119.06 | 140.55 | 159.09 | 194.09 | 227.08 | 268.39 | 300.65 | 330.62 | 361.77 | 429.63 | 485.32 | 521.83 | 560.34 | 604.99 | 668.65 | 756.92 | 860.56 | 951.27 | 1045.33 | 1173.01 |
| 516.0 | 104.49 | 123.86 | 146.63 | 165.94 | 202.53 | 237.28 | 280.96 | 315.28 | 347.3 | 380.32 | 452.11 | 511.11 | 550.08 | 591.35 | 638.91 | 707.46 | 801.56 | 912.21 | 1009.31 | 1110.74 | 1248.25 |
| 517.0 | 108.8 | 128.82 | 152.81 | 173.34 | 211.3 | 247.76 | 293.94 | 330.42 | 363.85 | 399.2 | 475.34 | 537.99 | 579.43 | 622.92 | 673.72 | 747.14 | 847.67 | 965.27 | 1069.6 | 1178.06 | 1326.01 |
| 518.0 | 112.97 | 133.91 | 158.69 | 180.49 | 219.91 | 258.17 | 306.79 | 345.55 | 380.73 | 418.13 | 498.44 | 564.77 | 609.11 | 655.14 | 709.12 | 787.34 | 894.92 | 1019.18 | 1130.03 | 1247.43 | 1404.61 |
| 519.0 | 116.53 | 138.69 | 164.37 | 187.5 | 228.4 | 267.96 | 319.24 | 360.05 | 397.25 | 436.62 | 520.87 | 590.94 | 638.13 | 687.21 | 744.47 | 827.95 | 941.93 | 1074.4 | 1191.19 | 1316.78 | 1483.45 |
| 520.0 | 120.34 | 142.87 | 170.35 | 194.35 | 236.94 | 278.13 | 331.56 | 374.56 | 413.45 | 455.06 | 543.89 | 617.74 | 667.61 | 719.48 | 780.31 | 869.13 | 989.66 | 1129.85 | 1253.26 | 1387.56 | 1563.99 |
| 521.0 | 123.85 | 147.07 | 175.82 | 200.99 | 245.03 | 288.11 | 343.9 | 388.62 | 429.59 | 473.38 | 566.37 | 643.93 | 696.72 | 751.64 | 816.11 | 909.86 | 1037.12 | 1185.3 | 1315.6 | 1458.44 | 1644.31 |
| 522.0 | 127.55 | 151.31 | 181.49 | 207.58 | 253.16 | 297.87 | 356.05 | 402.47 | 445.63 | 491.45 | 588.58 | 669.73 | 725.7 | 783.97 | 851.67 | 950.15 | 1084.38 | 1239.57 | 1377.41 | 1528.33 | 1724.89 |
| 523.0 | 130.84 | 155.35 | 186.61 | 213.83 | 261.14 | 307.2 | 367.54 | 416.13 | 461.35 | 509.19 | 610.65 | 695.57 | 754.7 | 815.05 | 887.22 | 991.14 | 1131.58 | 1294.22 | 1439.48 | 1598.99 | 1805.29 |
| 524.0 | 134.23 | 159.29 | 191.83 | 220.21 | 268.36 | 316.45 | 378.78 | 429.41 | 476.27 | 526.45 | 632.06 | 720.32 | 782.71 | 846.37 | 922.07 | 1030.39 | 1177.8 | 1348.52 | 1500.78 | 1668.5 | 1884.05 |
| 525.0 | 137.41 | 163.24 | 196.53 | 226.12 | 275.88 | 325.17 | 389.65 | 442.29 | 491.05 | 543.28 | 653.17 | 744.67 | 810.37 | 877.12 | 956.33 | 1069.41 | 1223.58 | 1401.89 | 1561.17 | 1737.46 | 1962.98 |
| 526.0 | 140.25 | 166.72 | 200.98 | 231.39 | 282.49 | 333.58 | 399.91 | 454.32 | 505.03 | 559.28 | 672.8 | 767.69 | 836.87 | 907.21 | 989.69 | 1107.2 | 1267.95 | 1453.53 | 1619.94 | 1804.23 | 2040.12 |
| 527.0 | 143.16 | 170.14 | 205.15 | 236.73 | 289.37 | 341.45 | 409.92 | 466.21 | 518.66 | 575.3 | 692.99 | 791.12 | 862.9 | 936.69 | 1022.7 | 1144.54 | 1312.4 | 1504.25 | 1678.89 | 1870.35 | 2116.84 |
| 528.0 | 145.52 | 173.14 | 209.3 | 241.85 | 295.6 | 349.31 | 419.89 | 477.87 | 531.8 | 590.59 | 712.38 | 813.83 | 888.64 | 965.56 | 1055.33 | 1181.11 | 1355.96 | 1554.82 | 1736.43 | 1935.74 | 2192.37 |
| 529.0 | 148.13 | 176.02 | 213.42 | 246.69 | 301.61 | 356.62 | 429.36 | 489 | 544.67 | 605.91 | 731.3 | 836.55 | 913.89 | 994.01 | 1086.85 | 1217.16 | 1398.37 | 1604.85 | 1793.14 | 2000.19 | 2266.52 |
| 530.0 | 150.08 | 179.01 | 216.79 | 250.76 | 307.02 | 363.36 | 438.09 | 499.42 | 557.11 | 620.14 | 749.21 | 857.69 | 938.19 | 1020.78 | 1117.43 | 1252.25 | 1439.86 | 1652.86 | 1849.09 | 2063.8 | 2339.15 |
| 531.0 | 151.88 | 181.59 | 219.85 | 255.13 | 312.13 | 369.74 | 446.49 | 509.38 | 568.82 | 633.58 | 766.37 | 878.17 | 961.46 | 1046.82 | 1146.44 | 1286.33 | 1479.96 | 1700.03 | 1902.27 | 2124.63 | 2409.1 |
| 532.0 | 153.76 | 183.79 | 222.93 | 259.01 | 316.9 | 375.89 | 454.82 | 519.1 | 579.77 | 646.61 | 782.38 | 897.89 | 983.68 | 1071.78 | 1175.51 | 1319.17 | 1519.33 | 1746.47 | 1954.12 | 2184.18 | 2476.61 |
| 533.0 | 155.46 | 185.91 | 226.03 | 262.54 | 321.62 | 381.36 | 462.1 | 528.02 | 590.17 | 658.8 | 797.56 | 916.18 | 1004.57 | 1095.51 | 1202.31 | 1350.38 | 1556.22 | 1789.57 | 2003.69 | 2240.26 | 2541.11 |
| 534.0 | 157.09 | 187.91 | 228.58 | 265.75 | 325.75 | 386.38 | 468.97 | 536.42 | 600.13 | 670.4 | 812.11 | 934.01 | 1024.57 | 1118.13 | 1228.4 | 1380.13 | 1592.1 | 1831.43 | 2050.77 | 2294.51 | 2603.39 |
| 535.0 | 158.54 | 189.69 | 230.91 | 269.06 | 329.91 | 391.37 | 475.61 | 544.46 | 609.26 | 682.14 | 826.48 | 950.68 | 1044.17 | 1140.19 | 1253.23 | 1409.78 | 1626.96 | 1872.1 | 2097.22 | 2348.1 | 2664.67 |
| 536.0 | 159.91 | 191.12 | 232.96 | 271.88 | 333.34 | 395.75 | 481.45 | 551.57 | 617.47 | 692.33 | 839.36 | 966.3 | 1062.12 | 1160.28 | 1276.09 | 1436.92 | 1659.55 | 1910.27 | 2140.42 | 2397.99 | 2721.66 |
| 537.0 | 161.08 | 192.65 | 234.71 | 274.5 | 336.84 | 400.2 | 487.02 | 558.42 | 625.56 | 701.97 | 851.76 | 981.54 | 1079.67 | 1180.12 | 1299.02 | 1463.25 | 1690.69 | 1947.34 | 2183.21 | 2446.57 | 2777.3 |
| 538.0 | 161.93 | 193.93 | 236.38 | 276.5 | 339.98 | 404.11 | 492.08 | 564.62 | 633.49 | 711.44 | 863.47 | 995.85 | 1095.84 | 1199.39 | 1321.39 | 1489.04 | 1720.87 | 1983.62 | 2224.39 | 2494.08 | 2831.18 |
| 539.0 | 162.69 | 194.95 | 238.15 | 278.54 | 342.94 | 407.75 | 496.98 | 570.64 | 640.83 | 720.22 | 874.75 | 1009.51 | 1111.26 | 1217.52 | 1341.74 | 1513.95 | 1749.38 | 2017.63 | 2263.73 | 2538.71 | 2882.75 |
| 540.0 | 163.93 | 196.01 | 239.53 | 280.45 | 345.38 | 411.49 | 502.07 | 576.55 | 647.55 | 728.35 | 885.67 | 1023.01 | 1126.45 | 1235.15 | 1361.71 | 1537.36 | 1776.66 | 2049.76 | 2301.29 | 2581.37 | 2932.65 |
| 541.0 | 164.45 | 197.19 | 240.76 | 282.06 | 347.3 | 414.61 | 506.24 | 581.68 | 653.88 | 735.73 | 895.54 | 1035.09 | 1140.07 | 1251.42 | 1380.42 | 1559.2 | 1802.75 | 2080.5 | 2337.12 | 2621.97 | 2979.42 |
| 542.0 | 164.74 | 198 | 241.79 | 283.29 | 349.24 | 417.06 | 509.66 | 586.66 | 659.62 | 742.63 | 904.83 | 1046.65 | 1153.08 | 1266.66 | 1397.77 | 1579.54 | 1827.09 | 2109.19 | 2370.65 | 2660.05 | 3023.88 |
| 543.0 | 165.02 | 198.68 | 242.42 | 284.48 | 351.09 | 419.43 | 513 | 591.24 | 665 | 749.81 | 913.76 | 1057.81 | 1165.76 | 1281.09 | 1414.98 | 1599.79 | 1851.4 | 2138.51 | 2404.29 | 2698.24 | 3068 |
| 544.0 | 165.18 | 199.31 | 243.64 | 285.46 | 352.36 | 421.69 | 516.13 | 595.21 | 670.28 | 756.06 | 921.8 | 1067.1 | 1177.31 | 1295.39 | 1430.71 | 1618.08 | 1873.93 | 2164.78 | 2435.26 | 2734.03 | 3109.33 |
| 545.0 | 165.34 | 199.55 | 244.25 | 286.13 | 353.78 | 423.68 | 519.19 | 599.01 | 675.14 | 762.49 | 929.81 | 1076.99 | 1188.32 | 1308.44 | 1445.73 | 1636.29 | 1896.08 | 2190.53 | 2464.4 | 2768.34 | 3149.74 |
| 546.0 | 165.2 | 199.5 | 244.36 | 286.58 | 354.4 | 425.12 | 521.34 | 601.71 | 678.95 | 767.67 | 936.5 | 1085.32 | 1198.53 | 1319.75 | 1459.29 | 1652.36 | 1915.31 | 2213.79 | 2491.09 | 2800.1 | 3186.24 |
| 547.0 | 165.2 | 199.89 | 244.59 | 287.4 | 355.43 | 426.66 | 523.57 | 604.66 | 682.81 | 772.73 | 943.39 | 1093.45 | 1208.02 | 1330.82 | 1471.97 | 1668 | 1933.6 | 2236.39 | 2516.99 | 2830.94 | 3221.38 |
| 548.0 | 164.98 | 199.98 | 244.61 | 287.72 | 355.99 | 427.92 | 525.46 | 606.72 | 686.38 | 776.9 | 948.43 | 1100.34 | 1216.29 | 1340.33 | 1482.83 | 1682.38 | 1950.08 | 2257 | 2540.43 | 2859.36 | 3253.57 |
| 549.0 | 164.58 | 200.17 | 244.27 | 287.92 | 356.33 | 428.75 | 526.75 | 608.67 | 689.35 | 780.39 | 952.89 | 1106.47 | 1223.5 | 1348.53 | 1492.55 | 1695.21 | 1965.02 | 2275.59 | 2562.6 | 2885.52 | 3282.37 |
| 550.0 | 164.1 | 200.13 | 243.66 | 287.85 | 356.64 | 428.96 | 527.87 | 610.27 | 691.34 | 783.19 | 956.9 | 1111.15 | 1228.66 | 1355.64 | 1501.67 | 1706.88 | 1979.08 | 2292.35 | 2582.11 | 2908.9 | 3309.38 |
| 551.0 | 163.68 | 199.45 | 243.09 | 287.61 | 356.76 | 429.15 | 528.21 | 611.23 | 692.94 | 785.23 | 959.8 | 1115.08 | 1233.59 | 1362.14 | 1509.07 | 1716.59 | 1991.35 | 2307.01 | 2598.67 | 2928.09 | 3332.8 |
| 552.0 | 163.28 | 198.92 | 242.69 | 287.1 | 356.55 | 428.92 | 528.16 | 611.47 | 694.37 | 786.74 | 962.45 | 1117.92 | 1237.59 | 1367.89 | 1515.96 | 1724.94 | 2001.68 | 2319.29 | 2613.69 | 2945.95 | 3354.47 |
| 553.0 | 162.32 | 198.05 | 241.6 | 286.21 | 355.94 | 428.03 | 527.33 | 610.6 | 694.42 | 787.32 | 963.97 | 1119.92 | 1240.11 | 1370.9 | 1519.92 | 1730.99 | 2008.55 | 2327.7 | 2625.75 | 2959.41 | 3371.61 |
| 554.0 | 161.31 | 197.23 | 240.39 | 285.09 | 354.89 | 427.32 | 526.43 | 609.74 | 693.78 | 787.2 | 964.38 | 1121.06 | 1242.11 | 1373.12 | 1523.4 | 1735.59 | 2015.19 | 2335.8 | 2636.01 | 2972.32 | 3387.7 |
| 555.0 | 160.17 | 195.99 | 239.13 | 284.06 | 353.45 | 426.07 | 525.03 | 608.26 | 692.81 | 786.36 | 963.79 | 1121.02 | 1242.72 | 1374.62 | 1525.17 | 1738.82 | 2019.38 | 2341.93 | 2644 | 2982.28 | 3399.65 |
| 556.0 | 158.81 | 194.6 | 237.68 | 282.5 | 351.46 | 424.05 | 522.54 | 606.24 | 690.96 | 783.97 | 962.36 | 1118.95 | 1241.53 | 1373.73 | 1524.97 | 1738.65 | 2020.45 | 2344.2 | 2648.28 | 2986.48 | 3406.28 |
| 557.0 | 157.27 | 192.77 | 235.93 | 280.31 | 349.41 | 421.48 | 520.01 | 603.57 | 688.54 | 781.2 | 959.39 | 1116.34 | 1239.54 | 1372.46 | 1523.35 | 1737.74 | 2020.03 | 2344.38 | 2649.91 | 2989.34 | 3410.56 |
| 558.0 | 155.59 | 190.78 | 233.85 | 278.02 | 347.15 | 418.66 | 516.76 | 600.06 | 685.34 | 777.79 | 955.59 | 1112.43 | 1235.42 | 1368.94 | 1520.02 | 1734.74 | 2017.45 | 2342.47 | 2648.18 | 2989.07 | 3411 |
| 559.0 | 153.87 | 188.85 | 231.71 | 275.5 | 344.24 | 415.4 | 513.17 | 596.11 | 680.88 | 773.3 | 950.67 | 1107.28 | 1230.54 | 1363.65 | 1514.56 | 1729.95 | 2012.37 | 2337.61 | 2643.53 | 2984.86 | 3407.46 |
| 560.0 | 152.03 | 186.61 | 229.21 | 272.93 | 340.86 | 411.77 | 508.71 | 591.17 | 675.82 | 767.83 | 944.68 | 1100.61 | 1223.97 | 1356.47 | 1507.86 | 1722.38 | 2005.07 | 2330.18 | 2635.64 | 2977.54 | 3400.72 |
| 561.0 | 149.49 | 183.98 | 226.52 | 269.65 | 337.23 | 407.48 | 503.26 | 585.68 | 670.35 | 762.01 | 937.78 | 1092.73 | 1215.95 | 1347.66 | 1499.18 | 1712.85 | 1995.9 | 2319.86 | 2625.76 | 2966.86 | 3389.24 |
| 562.0 | 147.14 | 181.44 | 223.28 | 266.1 | 333.48 | 402.7 | 497.56 | 579.68 | 663.92 | 755.41 | 929.52 | 1083.39 | 1206.76 | 1337.2 | 1488.24 | 1701.34 | 1982.76 | 2306.69 | 2612.32 | 2952.7 | 3374.17 |
| 563.0 | 144.99 | 178.79 | 220.26 | 262.68 | 329.46 | 397.99 | 491.78 | 572.85 | 656.81 | 747.64 | 920.66 | 1072.84 | 1196.03 | 1325.83 | 1476.08 | 1688.35 | 1968.99 | 2291.24 | 2595.65 | 2935.47 | 3355.39 |
| 564.0 | 142.81 | 175.84 | 217.03 | 258.74 | 324.64 | 392.27 | 485.13 | 565.46 | 648.77 | 738.31 | 909.79 | 1060.52 | 1183.1 | 1312.19 | 1461.41 | 1672.43 | 1951.55 | 2271.51 | 2574.57 | 2913.64 | 3330.71 |
| 565.0 | 140.35 | 172.74 | 213.05 | 254.77 | 319.97 | 386.68 | 478.15 | 557.41 | 639.77 | 728.51 | 898.35 | 1048.08 | 1169.22 | 1297.05 | 1445.3 | 1655.13 | 1931.72 | 2250.42 | 2550.99 | 2888.2 | 3303.03 |
| 566.0 | 137.57 | 169.48 | 208.97 | 250.38 | 314.86 | 380.25 | 470.04 | 548.7 | 630.57 | 717.43 | 885.7 | 1033.58 | 1154.09 | 1280.48 | 1427.4 | 1635.26 | 1909.37 | 2225.84 | 2524.43 | 2859.64 | 3272.16 |
| 567.0 | 134.75 | 166.23 | 204.83 | 245.93 | 309.37 | 373.68 | 461.97 | 539.91 | 620.71 | 706.07 | 872.12 | 1018.83 | 1137.28 | 1262.93 | 1408.24 | 1613.96 | 1885.97 | 2199.31 | 2495.96 | 2828.13 | 3237.12 |
| 568.0 | 131.45 | 162.52 | 200.39 | 240.77 | 303.45 | 366.52 | 453.14 | 529.96 | 609.78 | 693.71 | 857.74 | 1002.11 | 1119.34 | 1243.16 | 1387.33 | 1590.57 | 1860.02 | 2169.39 | 2463.49 | 2792.31 | 3197.41 |
| 569.0 | 128.35 | 158.65 | 196.03 | 235.43 | 297.15 | 359.22 | 444 | 519.94 | 598.24 | 681.47 | 842.43 | 984.76 | 1100.86 | 1222.7 | 1365.6 | 1565.61 | 1832.34 | 2137.58 | 2428.38 | 2753.33 | 3155.02 |
| 570.0 | 125.09 | 154.39 | 191.39 | 229.78 | 290.5 | 351.13 | 434.33 | 508.97 | 585.7 | 667.95 | 825.83 | 965.8 | 1080.05 | 1200.84 | 1341.76 | 1538.42 | 1802.2 | 2102.65 | 2389.16 | 2710.31 | 3108.35 |
| 571.0 | 121.78 | 150.27 | 186.61 | 224.16 | 283.58 | 342.99 | 424.21 | 497.54 | 573.3 | 653.79 | 808.59 | 946.01 | 1059.56 | 1177.28 | 1316.09 | 1509.42 | 1769.5 | 2065.23 | 2348.1 | 2665.55 | 3057.89 |
| 572.0 | 118.62 | 146.13 | 181.95 | 218.47 | 276.32 | 334.68 | 414.12 | 485.95 | 560.17 | 639.13 | 790.97 | 925.71 | 1036.97 | 1152.63 | 1289.27 | 1479.06 | 1734.45 | 2026.3 | 2304.18 | 2618.88 | 3003.89 |
| 573.0 | 115.17 | 142.02 | 177.18 | 212.62 | 269.07 | 326.21 | 403.7 | 474.31 | 546.26 | 624.29 | 772.7 | 904.8 | 1013.92 | 1127.24 | 1261.73 | 1447.37 | 1698.73 | 1985.96 | 2259.93 | 2569.16 | 2948.12 |
| 574.0 | 111.81 | 137.73 | 172.21 | 206.49 | 261.49 | 317.55 | 393 | 462.41 | 532.82 | 609.01 | 753.91 | 882.89 | 990.09 | 1101.16 | 1233.06 | 1414.79 | 1662.37 | 1944.29 | 2212.38 | 2517.26 | 2890.17 |
| 575.0 | 108.38 | 133.42 | 167.04 | 200.53 | 254.27 | 308.61 | 382.31 | 450.06 | 518.92 | 593.25 | 735.07 | 860.71 | 965.78 | 1074.95 | 1203.45 | 1381.42 | 1623.61 | 1900.65 | 2163.38 | 2463.06 | 2828.73 |
| 576.0 | 104.84 | 129.14 | 161.67 | 194.18 | 246.88 | 299.8 | 371.32 | 437.45 | 504.68 | 577.36 | 715.75 | 838.03 | 941.02 | 1047.22 | 1173.16 | 1347.06 | 1584.14 | 1855.16 | 2113.23 | 2407.12 | 2766.54 |
| 577.0 | 101.37 | 124.9 | 156.48 | 187.86 | 239.14 | 290.97 | 360.7 | 424.45 | 490.32 | 561.01 | 695.94 | 815.42 | 915.65 | 1019.6 | 1142.66 | 1312.33 | 1544.35 | 1809.36 | 2062.14 | 2350.76 | 2702.28 |
| 578.0 | 97.98 | 121.01 | 151.56 | 181.85 | 231.67 | 282.29 | 349.89 | 411.95 | 475.87 | 545.26 | 676.28 | 792.1 | 889.78 | 990.87 | 1111.57 | 1277.26 | 1503.7 | 1762.75 | 2009.33 | 2292.48 | 2636.76 |
| 579.0 | 94.48 | 116.88 | 146.51 | 175.89 | 223.98 | 273.23 | 338.83 | 398.94 | 461.23 | 528.71 | 656.28 | 768.57 | 863.94 | 962.02 | 1079.8 | 1241.49 | 1462.48 | 1714.94 | 1956.02 | 2232.84 | 2568.87 |
| 580.0 | 91.03 | 112.74 | 141.25 | 170.01 | 216.21 | 264.24 | 327.6 | 385.98 | 446.85 | 512.12 | 635.91 | 744.81 | 837.58 | 933.02 | 1047.57 | 1204.6 | 1420.09 | 1665.65 | 1901.03 | 2171.38 | 2499.1 |
| 581.0 | 87.82 | 108.5 | 136.13 | 163.73 | 208.83 | 255.35 | 316.7 | 373.08 | 432.36 | 495.81 | 615.67 | 721.34 | 811.23 | 903.95 | 1015.56 | 1168.08 | 1376.94 | 1615.82 | 1846.12 | 2109.35 | 2428.39 |
| 582.0 | 84.65 | 104.76 | 131.14 | 158.13 | 201.66 | 246.41 | 305.94 | 360.43 | 417.42 | 479.42 | 595.46 | 697.49 | 784.91 | 874.91 | 983.19 | 1131.22 | 1333.67 | 1566.46 | 1789.47 | 2046.95 | 2357.99 |
| 583.0 | 81.5 | 100.56 | 126.12 | 152.23 | 194.11 | 237.54 | 295.31 | 347.77 | 403.09 | 462.85 | 575.1 | 673.86 | 758.47 | 846.32 | 950.98 | 1094.25 | 1291.05 | 1516.54 | 1732.48 | 1983.31 | 2286.9 |
| 584.0 | 78.43 | 96.73 | 121.29 | 146.44 | 187.05 | 228.67 | 284.83 | 335.68 | 389.03 | 446.92 | 554.89 | 650.57 | 732.39 | 817.25 | 919.75 | 1057.98 | 1248.33 | 1466.82 | 1676.7 | 1920.47 | 2215.36 |
| 585.0 | 75.14 | 93.03 | 116.63 | 140.78 | 180.08 | 220.2 | 274.31 | 323.27 | 374.92 | 431.3 | 535.67 | 627.85 | 706.87 | 788.68 | 888.26 | 1021.96 | 1206.45 | 1417.93 | 1621.27 | 1857.89 | 2144.81 |
| 586.0 | 72.14 | 89.31 | 112 | 135.19 | 173.01 | 211.65 | 263.93 | 311.15 | 361.25 | 415.56 | 516.09 | 605.1 | 681.69 | 760.51 | 856.86 | 986.17 | 1164.9 | 1369.33 | 1566.39 | 1795.23 | 2073.96 |
| 587.0 | 69.28 | 85.75 | 107.59 | 129.67 | 166.34 | 203.38 | 254 | 299.31 | 347.52 | 400.21 | 496.71 | 582.79 | 656.65 | 732.46 | 826.15 | 950.73 | 1123.18 | 1320.7 | 1511.87 | 1732.47 | 2002.12 |
| 588.0 | 66.55 | 82.2 | 103.51 | 124.37 | 159.89 | 195.5 | 244.28 | 288.1 | 334.31 | 385.32 | 478.13 | 560.65 | 632.1 | 705.18 | 795.79 | 916.11 | 1082.02 | 1272.42 | 1457.7 | 1670.4 | 1931.79 |
| 589.0 | 64.13 | 78.86 | 99.51 | 119.49 | 153.48 | 187.69 | 234.67 | 276.92 | 321.38 | 370.87 | 459.77 | 539.51 | 608.06 | 678.32 | 765.77 | 881.7 | 1041.7 | 1225.41 | 1404.36 | 1609.57 | 1861.99 |
| 590.0 | 61.61 | 75.69 | 95.5 | 114.73 | 147.25 | 180.06 | 225.18 | 265.75 | 308.56 | 355.8 | 441.78 | 518.34 | 583.91 | 651.84 | 736.04 | 847.77 | 1001.22 | 1178.7 | 1351.01 | 1548.86 | 1791.92 |
| 591.0 | 59.31 | 72.79 | 91.78 | 110.02 | 141.31 | 172.63 | 216.08 | 255.08 | 296.5 | 341.68 | 424.46 | 498 | 561.09 | 625.82 | 706.85 | 814.45 | 961.7 | 1132.72 | 1299.13 | 1489.25 | 1723.36 |
| 592.0 | 56.94 | 69.82 | 88.04 | 105.5 | 135.46 | 165.76 | 207.19 | 244.76 | 284.43 | 327.7 | 407.18 | 478.31 | 538.36 | 600.78 | 678.12 | 782.01 | 923.31 | 1087.74 | 1247.61 | 1430.02 | 1655.75 |
| 593.0 | 54.6 | 67.25 | 84.44 | 101.19 | 130.07 | 158.94 | 198.68 | 234.68 | 272.71 | 314.4 | 390.63 | 458.71 | 516.46 | 576.27 | 650.53 | 750.57 | 886.14 | 1043.59 | 1197.75 | 1371.98 | 1590.16 |
| 594.0 | 52.47 | 64.43 | 80.65 | 96.96 | 124.6 | 152.21 | 190.29 | 224.72 | 261.34 | 301.16 | 374.14 | 439.6 | 494.84 | 551.79 | 623.02 | 719.44 | 848.98 | 1000.27 | 1146.89 | 1314.88 | 1524.33 |
| 595.0 | 50.46 | 61.97 | 77.33 | 93.01 | 119.58 | 145.95 | 182.32 | 215.21 | 250.48 | 288.52 | 358.6 | 421.4 | 473.97 | 528.75 | 596.91 | 689.51 | 813.1 | 957.93 | 1098.71 | 1259.79 | 1460.72 |
| 596.0 | 48.54 | 59.4 | 74.12 | 89.22 | 114.47 | 139.79 | 174.43 | 205.9 | 239.88 | 276.41 | 343.32 | 403.28 | 453.44 | 505.93 | 571.57 | 659.99 | 778.23 | 916.87 | 1051.4 | 1205.07 | 1397.84 |
| 597.0 | 46.52 | 56.89 | 71.05 | 85.5 | 109.37 | 133.59 | 166.87 | 197.08 | 229.49 | 264.35 | 328.52 | 385.53 | 433.5 | 483.96 | 547.04 | 631.2 | 743.97 | 876.44 | 1005.13 | 1151.98 | 1335.9 |
| 598.0 | 44.72 | 54.7 | 67.9 | 82.19 | 104.73 | 127.79 | 159.57 | 188.5 | 219.63 | 253.2 | 313.91 | 368.5 | 414.23 | 462.63 | 522.73 | 603.39 | 710.37 | 837.26 | 959.38 | 1099.65 | 1275.45 |
| 599.0 | 42.97 | 52.55 | 64.95 | 78.8 | 100.27 | 122.05 | 152.56 | 180 | 209.72 | 241.74 | 300.28 | 352.38 | 395.77 | 442.11 | 499.84 | 576.08 | 678.33 | 798.82 | 915.73 | 1048.53 | 1216.79 |
| 600.0 | 41.26 | 50.6 | 62.32 | 75.57 | 96.13 | 116.7 | 145.74 | 172.2 | 200.5 | 231.14 | 286.88 | 336.62 | 377.9 | 422.21 | 477.5 | 549.82 | 647.11 | 761.65 | 872.84 | 999.15 | 1159.49 |
| 601.0 | 39.73 | 48.56 | 59.93 | 72.2 | 92.37 | 111.57 | 139.44 | 164.6 | 191.43 | 220.73 | 273.89 | 321.2 | 360.54 | 402.79 | 455.7 | 524.41 | 616.78 | 725.71 | 831.46 | 951.41 | 1103.89 |
| 602.0 | 38.21 | 46.97 | 57.58 | 69.38 | 88.46 | 106.83 | 133.43 | 157.42 | 182.87 | 210.84 | 261.18 | 306.27 | 344.07 | 384.25 | 434.54 | 499.74 | 588.02 | 691.57 | 791.57 | 905.21 | 1049.32 |
| 603.0 | 36.83 | 45.05 | 55.4 | 66.58 | 84.83 | 102.11 | 127.66 | 150.56 | 174.93 | 201.26 | 249.25 | 292.4 | 328.21 | 366.57 | 414.47 | 476.42 | 560.53 | 658.1 | 753.3 | 860.63 | 997.18 |
| 604.0 | 35.67 | 43.45 | 53.4 | 63.99 | 81.4 | 97.96 | 122.22 | 143.89 | 167.24 | 192.28 | 237.89 | 279.19 | 313.04 | 349.33 | 395.26 | 453.92 | 534 | 626.33 | 716.22 | 818.02 | 946.54 |
| 605.0 | 34.35 | 41.77 | 51.3 | 61.55 | 77.87 | 93.92 | 116.91 | 137.56 | 159.76 | 183.66 | 227.15 | 266.48 | 298.61 | 333.03 | 376.14 | 432.03 | 507.74 | 595.57 | 680.38 | 776.6 | 898.12 |
| 606.0 | 33.14 | 40.13 | 49.26 | 59.27 | 74.73 | 90.25 | 112.08 | 131.87 | 152.91 | 175.37 | 216.26 | 253.98 | 284.69 | 317.25 | 357.92 | 410.88 | 482.18 | 565.83 | 645.37 | 736.09 | 850.57 |
| 607.0 | 32.07 | 38.88 | 47.4 | 57.13 | 72 | 86.56 | 107.54 | 126.31 | 146.03 | 167.75 | 206.49 | 242.2 | 271.17 | 302.33 | 340.96 | 390.85 | 458.11 | 536.77 | 611.79 | 697.53 | 805.08 |
| 608.0 | 31.32 | 37.79 | 45.77 | 55.1 | 69.19 | 83.28 | 103.25 | 121.12 | 139.57 | 160.38 | 197.37 | 231.1 | 258.41 | 288.3 | 324.56 | 371.83 | 435.39 | 509.46 | 580.06 | 660.9 | 761.75 |
| 609.0 | 30.44 | 36.74 | 44.42 | 53.44 | 66.6 | 80.2 | 99.09 | 116.07 | 133.66 | 153.51 | 188.36 | 220.52 | 246.55 | 274.72 | 309.08 | 353.57 | 413.8 | 483.58 | 549.69 | 625.54 | 720.18 |
| 610.0 | 29.69 | 35.83 | 43.27 | 51.76 | 64.47 | 77.37 | 95.48 | 111.8 | 128.38 | 147.06 | 180.16 | 210.86 | 235.59 | 262.29 | 294.62 | 336.54 | 393.25 | 459.19 | 521.05 | 592.35 | 681.15 |
| 611.0 | 29.03 | 34.97 | 42.05 | 50.2 | 62.15 | 74.67 | 91.97 | 107.81 | 123.15 | 141.11 | 172.4 | 201.54 | 224.79 | 250.1 | 280.49 | 320.25 | 374.04 | 435.94 | 493.96 | 560.89 | 644.01 |
| 612.0 | 28.38 | 34.05 | 40.85 | 48.85 | 60.22 | 72.43 | 88.73 | 104 | 118.29 | 135.31 | 165.11 | 192.88 | 214.68 | 238.97 | 267.75 | 304.99 | 355.66 | 414.08 | 468.4 | 531.07 | 608.6 |
| 613.0 | 27.55 | 33.05 | 39.76 | 47.41 | 58.34 | 69.75 | 85.62 | 100.09 | 113.32 | 130.07 | 158.39 | 184.35 | 205.25 | 228.05 | 255.91 | 290.51 | 338.02 | 393.11 | 444.42 | 502.56 | 575.22 |
| 614.0 | 26.82 | 32.14 | 38.78 | 46.04 | 56.45 | 67.47 | 82.77 | 96.53 | 109.07 | 125.18 | 151.87 | 176.64 | 196.6 | 217.89 | 244.35 | 276.71 | 321.53 | 373.73 | 421.68 | 475.91 | 543.55 |
| 615.0 | 26.19 | 31.41 | 37.93 | 44.92 | 54.92 | 65.41 | 80.25 | 93.35 | 105.29 | 120.67 | 146 | 169.47 | 188.36 | 208.57 | 233.64 | 264.16 | 306.34 | 355.26 | 400.59 | 451.19 | 513.83 |
| 616.0 | 25.58 | 30.82 | 37.2 | 43.97 | 53.43 | 63.46 | 77.78 | 90.53 | 101.63 | 116.31 | 140.64 | 162.63 | 180.67 | 199.76 | 223.5 | 252.32 | 292.13 | 338.11 | 380.41 | 428.01 | 485.61 |
| 617.0 | 24.9 | 30.06 | 36.35 | 42.71 | 52.1 | 61.7 | 75.61 | 87.87 | 98.3 | 112.19 | 135.36 | 156.35 | 173.47 | 191.4 | 213.83 | 241.15 | 278.87 | 321.98 | 361.71 | 406.24 | 459.61 |
| 618.0 | 24.54 | 29.67 | 35.75 | 42.01 | 51.12 | 60.45 | 73.71 | 85.58 | 95.38 | 108.73 | 130.6 | 150.65 | 166.97 | 183.92 | 205.05 | 230.94 | 266.65 | 307.47 | 344.44 | 386.07 | 435.36 |
| 619.0 | 24.1 | 29.22 | 35.36 | 41.03 | 50.21 | 59.21 | 71.9 | 83.47 | 92.75 | 105.42 | 126.19 | 145.47 | 161.06 | 177.03 | 196.98 | 221.44 | 255.35 | 293.81 | 328.34 | 367.25 | 413.07 |
| 620.0 | 23.82 | 28.71 | 34.96 | 40.38 | 49.32 | 58.29 | 70.43 | 81.55 | 90.36 | 102.66 | 122.11 | 140.86 | 155.54 | 170.81 | 189.44 | 213.08 | 244.92 | 281.34 | 313.61 | 350.48 | 392.5 |
| 621.0 | 23.72 | 28.19 | 34.69 | 39.81 | 48.52 | 57.31 | 69.27 | 80.04 | 88.08 | 100.19 | 118.61 | 136.7 | 150.84 | 165.13 | 182.58 | 205.29 | 235.32 | 270.11 | 300.28 | 334.67 | 373.96 |
| 622.0 | 23.53 | 27.92 | 34.33 | 39.48 | 47.65 | 56.2 | 67.99 | 78.47 | 86.23 | 97.87 | 115.59 | 133 | 146.46 | 160.05 | 176.47 | 198.21 | 226.73 | 259.75 | 287.93 | 320.22 | 356.88 |
| 623.0 | 23.2 | 27.62 | 34.04 | 38.95 | 47.1 | 55.2 | 66.65 | 77.02 | 84.45 | 95.77 | 112.92 | 129.74 | 142.3 | 155.54 | 171.03 | 191.78 | 219.04 | 250.24 | 276.92 | 307.02 | 341.9 |
| 624.0 | 23.05 | 27.45 | 33.72 | 38.52 | 46.57 | 54.56 | 65.75 | 75.73 | 82.92 | 93.91 | 110.46 | 126.32 | 138.59 | 151.03 | 165.99 | 185.94 | 211.72 | 241.64 | 266.86 | 295.19 | 327.93 |
| 625.0 | 22.89 | 27.29 | 33.58 | 38.29 | 46.38 | 53.98 | 64.77 | 74.76 | 81.51 | 92.23 | 108.41 | 123.57 | 135.28 | 147.33 | 161.69 | 180.74 | 205.38 | 233.74 | 258.18 | 284.58 | 315.7 |
| 626.0 | 22.73 | 27.23 | 33.38 | 37.98 | 45.93 | 53.42 | 64 | 73.64 | 80.29 | 90.8 | 106.42 | 120.97 | 132.33 | 143.99 | 157.76 | 176.08 | 199.92 | 226.71 | 250.23 | 275.15 | 304.82 |
| 627.0 | 22.59 | 27.2 | 33.02 | 37.71 | 45.75 | 52.92 | 63.24 | 72.57 | 79.1 | 89.49 | 104.93 | 118.89 | 129.75 | 141.3 | 154.31 | 172.06 | 194.89 | 220.61 | 243.71 | 266.98 | 294.93 |
| 628.0 | 22.61 | 26.93 | 32.95 | 37.48 | 45.5 | 52.54 | 62.85 | 72.01 | 78.27 | 88.28 | 103.59 | 117.17 | 127.71 | 138.71 | 151.3 | 168.44 | 190.53 | 215.43 | 237.36 | 259.94 | 286.66 |
| 629.0 | 22.36 | 26.65 | 32.75 | 37.27 | 45.28 | 52.11 | 62.23 | 71.32 | 77.6 | 87.22 | 102.3 | 115.6 | 125.93 | 136.31 | 148.63 | 165.21 | 186.67 | 211.06 | 232.06 | 253.51 | 279.28 |
| 630.0 | 22.34 | 26.57 | 32.57 | 36.99 | 45.09 | 51.8 | 61.89 | 70.71 | 76.97 | 86.35 | 101.28 | 114.16 | 124.28 | 134.41 | 146.6 | 162.6 | 183.45 | 207.23 | 227.53 | 248.47 | 272.95 |
| 631.0 | 22.13 | 26.35 | 32.24 | 36.64 | 44.83 | 51.41 | 61.3 | 70.16 | 76.24 | 85.61 | 100.18 | 112.69 | 122.66 | 132.54 | 144.33 | 160.42 | 180.92 | 204.07 | 223.61 | 244.03 | 267.62 |
| 632.0 | 21.85 | 26.2 | 32.17 | 36.46 | 44.79 | 51.14 | 61.03 | 69.52 | 76.04 | 85.04 | 99.32 | 111.75 | 121.74 | 131.15 | 142.89 | 158.91 | 178.68 | 201.28 | 220.55 | 240.31 | 263.23 |
| 633.0 | 21.69 | 26.07 | 32.06 | 36.43 | 44.68 | 50.83 | 60.66 | 68.98 | 75.8 | 84.54 | 98.67 | 110.83 | 120.95 | 130.18 | 141.64 | 157.61 | 176.98 | 199.16 | 218.03 | 237.25 | 259.9 |
| 634.0 | 21.56 | 26.08 | 31.86 | 36.27 | 44.44 | 50.86 | 60.37 | 68.88 | 75.55 | 83.96 | 98.08 | 110.07 | 120.15 | 129.38 | 140.41 | 156.46 | 175.53 | 197.64 | 216.07 | 234.81 | 257.14 |
| 635.0 | 21.59 | 26.07 | 31.57 | 36.08 | 44.41 | 50.68 | 60.07 | 68.8 | 75.31 | 83.55 | 97.66 | 109.66 | 119.35 | 128.9 | 139.55 | 155.48 | 174.44 | 195.94 | 214.29 | 233.12 | 255.18 |
| 636.0 | 21.63 | 25.96 | 31.49 | 36.11 | 44.34 | 50.72 | 59.78 | 68.62 | 75.15 | 83.39 | 97.39 | 109.32 | 118.76 | 128.36 | 139.07 | 154.83 | 173.62 | 195.04 | 213.23 | 231.87 | 253.89 |
| 637.0 | 21.66 | 25.76 | 31.33 | 36.01 | 44.29 | 50.65 | 59.61 | 68.43 | 74.94 | 83.13 | 96.87 | 109.12 | 118.32 | 127.79 | 138.65 | 154.26 | 172.71 | 194.3 | 212.49 | 230.89 | 252.98 |
| 638.0 | 21.73 | 25.76 | 31.31 | 36.12 | 44.31 | 50.69 | 59.44 | 68.38 | 74.71 | 83.18 | 96.61 | 109.09 | 118.07 | 127.6 | 138.59 | 154.09 | 172.51 | 193.91 | 212.25 | 230.83 | 253.12 |
| 639.0 | 21.76 | 25.66 | 31.31 | 35.99 | 44.06 | 50.42 | 59.29 | 67.94 | 74.56 | 82.99 | 96.45 | 109.15 | 118.05 | 127.49 | 138.36 | 154.07 | 172.16 | 193.62 | 212.28 | 230.61 | 253.27 |
| 640.0 | 21.71 | 25.4 | 31.06 | 35.75 | 43.74 | 50.21 | 59.21 | 67.74 | 74.35 | 82.76 | 96.3 | 109 | 117.86 | 127.31 | 138.09 | 153.95 | 172.1 | 193.62 | 212.62 | 230.85 | 253.95 |
| 641.0 | 21.56 | 25.34 | 30.86 | 35.59 | 43.67 | 49.95 | 59.09 | 67.52 | 74.25 | 82.47 | 96.03 | 108.72 | 117.81 | 126.98 | 138.2 | 153.75 | 172.28 | 193.79 | 212.95 | 231.3 | 254.84 |
| 642.0 | 21.33 | 25.48 | 30.65 | 35.4 | 43.49 | 49.8 | 58.91 | 67.23 | 74.2 | 82.11 | 95.92 | 108.66 | 117.84 | 127 | 138.29 | 153.78 | 172.63 | 193.95 | 213.61 | 232.27 | 255.78 |
| 643.0 | 21.16 | 25.36 | 30.37 | 35.11 | 43.41 | 49.71 | 58.59 | 67.03 | 74.08 | 81.88 | 95.86 | 108.57 | 117.72 | 126.92 | 138.48 | 153.67 | 172.86 | 194.54 | 214.24 | 233.04 | 256.93 |
| 644.0 | 21.25 | 25.27 | 30.2 | 34.99 | 43.06 | 49.57 | 58.61 | 66.89 | 73.92 | 81.81 | 95.93 | 108.31 | 117.7 | 126.86 | 138.59 | 153.87 | 173.11 | 195.17 | 214.65 | 233.99 | 258.17 |
| 645.0 | 21.2 | 25.05 | 30.05 | 34.73 | 42.68 | 49.4 | 58.24 | 66.59 | 73.64 | 81.6 | 95.84 | 108.38 | 117.58 | 127.03 | 138.76 | 154.01 | 173.34 | 195.63 | 215.4 | 235.16 | 259.44 |
| 646.0 | 21.13 | 25 | 29.89 | 34.71 | 42.37 | 49.24 | 58.12 | 66.47 | 73.49 | 81.58 | 95.77 | 108.27 | 117.6 | 127.28 | 138.96 | 154.36 | 173.86 | 196.41 | 216.37 | 236.37 | 260.89 |
| 647.0 | 21.16 | 24.75 | 29.79 | 34.48 | 42.25 | 49.06 | 57.96 | 66.46 | 73.42 | 81.58 | 95.79 | 108.19 | 117.66 | 127.52 | 139.07 | 154.69 | 174.25 | 197.06 | 217.14 | 237.39 | 262.25 |
| 648.0 | 21.04 | 24.65 | 29.82 | 34.25 | 41.95 | 48.93 | 57.75 | 66.27 | 73.29 | 81.47 | 95.64 | 108.05 | 117.71 | 127.52 | 139.19 | 155.06 | 174.84 | 197.59 | 217.82 | 238.5 | 264 |
| 649.0 | 20.69 | 24.51 | 29.52 | 34.03 | 41.51 | 48.74 | 57.3 | 65.99 | 73.19 | 81.31 | 95.45 | 107.82 | 117.27 | 127.45 | 139.33 | 155.15 | 175.24 | 198.25 | 218.6 | 239.47 | 265.25 |
| 650.0 | 20.48 | 24.5 | 29.34 | 33.83 | 41.02 | 48.55 | 56.93 | 65.6 | 72.77 | 80.92 | 95.22 | 107.48 | 116.84 | 127.18 | 139.17 | 155.14 | 175.43 | 198.37 | 218.96 | 240.27 | 266.37 |
| 651.0 | 20.13 | 24.21 | 28.97 | 33.51 | 40.55 | 48.17 | 56.57 | 65.24 | 72.41 | 80.6 | 94.86 | 107.05 | 116.55 | 126.94 | 138.97 | 155.2 | 175.32 | 198.38 | 219.22 | 240.77 | 267.55 |
| 652.0 | 20.15 | 24.09 | 28.76 | 33.45 | 40.31 | 47.93 | 56.57 | 64.92 | 72.07 | 80.13 | 94.52 | 106.93 | 116.16 | 127.01 | 139.15 | 155.06 | 175.04 | 198.33 | 219.36 | 241.36 | 268.51 |
| 653.0 | 20.02 | 23.63 | 28.29 | 33.06 | 39.92 | 47.41 | 56.21 | 64.47 | 71.54 | 79.48 | 94.07 | 106.42 | 115.63 | 126.73 | 138.88 | 154.53 | 174.85 | 198.16 | 219.19 | 241.52 | 269.08 |
| 654.0 | 19.78 | 23.31 | 27.95 | 32.52 | 39.35 | 47.05 | 55.76 | 64.01 | 70.85 | 79.03 | 93.44 | 105.99 | 114.95 | 125.87 | 138.34 | 154.02 | 174.35 | 197.81 | 218.75 | 241.96 | 269.71 |
| 655.0 | 19.69 | 23.05 | 27.79 | 32.22 | 38.96 | 46.54 | 55.43 | 63.35 | 70.47 | 78.65 | 92.8 | 105.52 | 114.51 | 125.37 | 137.59 | 153.43 | 173.99 | 197.24 | 218.3 | 241.92 | 269.94 |
| 656.0 | 19.52 | 22.85 | 27.75 | 32 | 38.61 | 46.13 | 55.01 | 62.76 | 70.04 | 78.22 | 92.2 | 105.01 | 114.08 | 124.57 | 137.2 | 152.98 | 173.62 | 196.85 | 218.04 | 241.78 | 269.88 |
| 657.0 | 19.26 | 22.54 | 27.45 | 31.49 | 38.22 | 45.48 | 54.45 | 62.2 | 69.53 | 77.58 | 91.61 | 104.18 | 113.53 | 124 | 136.46 | 152.23 | 172.81 | 196.17 | 217.41 | 241.28 | 269.74 |
| 658.0 | 18.89 | 22.37 | 27.05 | 31.19 | 37.77 | 44.95 | 53.98 | 61.63 | 68.76 | 77.07 | 90.92 | 103.47 | 112.7 | 123.61 | 135.54 | 151.36 | 172.4 | 195.41 | 216.97 | 240.65 | 269.54 |
| 659.0 | 18.74 | 22.31 | 26.78 | 30.87 | 37.37 | 44.63 | 53.69 | 61.05 | 68.33 | 76.48 | 90.39 | 102.63 | 112.11 | 123.19 | 134.67 | 150.79 | 171.68 | 194.53 | 216 | 239.8 | 268.67 |
| 660.0 | 18.68 | 22.08 | 26.53 | 30.49 | 37.08 | 44.2 | 53.49 | 60.58 | 67.84 | 75.85 | 89.75 | 101.93 | 111.14 | 122.35 | 133.79 | 149.83 | 171.05 | 193.53 | 214.86 | 238.84 | 267.35 |
| 661.0 | 18.64 | 21.77 | 26.24 | 30.34 | 36.91 | 43.74 | 52.97 | 59.98 | 67.34 | 75.31 | 89.09 | 101.13 | 110.31 | 121.48 | 133.05 | 148.85 | 169.81 | 192.29 | 213.52 | 237.83 | 266.1 |
| 662.0 | 18.54 | 21.6 | 25.88 | 29.91 | 36.5 | 43.36 | 52.26 | 59.31 | 66.78 | 74.52 | 88.35 | 100.06 | 109.25 | 120.49 | 131.76 | 147.83 | 168.64 | 190.8 | 211.97 | 236.32 | 264.52 |
| 663.0 | 18.31 | 21.18 | 25.68 | 29.6 | 36.05 | 42.74 | 51.73 | 58.57 | 66 | 73.85 | 87.53 | 98.93 | 108.02 | 119.49 | 130.64 | 146.54 | 167.2 | 189.07 | 210.08 | 234.27 | 262.88 |
| 664.0 | 18.13 | 21 | 25.46 | 29.33 | 35.67 | 42.35 | 51.24 | 58.03 | 65.33 | 73.22 | 86.54 | 97.76 | 107.04 | 118.36 | 129.47 | 145.15 | 165.84 | 187.1 | 208.26 | 232.42 | 261.15 |
| 665.0 | 17.72 | 20.61 | 25.03 | 28.89 | 35.34 | 41.61 | 50.54 | 57.34 | 64.68 | 72.13 | 85.18 | 96.74 | 105.65 | 117.16 | 128.16 | 143.52 | 163.99 | 185.14 | 206.15 | 230.02 | 258.83 |
| 666.0 | 17.39 | 20.34 | 24.63 | 28.71 | 35.08 | 40.98 | 49.95 | 56.69 | 63.9 | 71.32 | 84.13 | 95.62 | 104.44 | 115.88 | 126.62 | 141.91 | 162.28 | 183.14 | 204.1 | 227.39 | 256.29 |
| 667.0 | 17.08 | 19.98 | 24.23 | 28.27 | 34.6 | 40.4 | 49.35 | 55.88 | 63.03 | 70.42 | 82.94 | 94.26 | 103.17 | 114.32 | 125.01 | 140.2 | 160.21 | 181.12 | 201.64 | 224.61 | 253.46 |
| 668.0 | 16.88 | 19.86 | 23.9 | 28.01 | 34.13 | 39.78 | 48.62 | 54.95 | 62.23 | 69.19 | 81.67 | 93.11 | 101.85 | 112.63 | 123.46 | 138.47 | 158.04 | 178.92 | 199.01 | 221.95 | 250.23 |
| 669.0 | 16.75 | 19.42 | 23.63 | 27.66 | 33.6 | 39.11 | 47.95 | 54.17 | 61.41 | 68.11 | 80.46 | 91.79 | 100.28 | 111.01 | 121.83 | 136.35 | 155.55 | 176.48 | 196.28 | 219.03 | 246.65 |
| 670.0 | 16.6 | 19.14 | 23.38 | 27.36 | 33.2 | 38.54 | 47.21 | 53.39 | 60.35 | 67.23 | 79.11 | 90.44 | 99.02 | 109.41 | 119.88 | 134.34 | 153.18 | 173.81 | 193.52 | 215.74 | 243.14 |
| 671.0 | 16.35 | 18.81 | 23.08 | 26.91 | 32.95 | 37.9 | 46.7 | 52.86 | 59.52 | 66.42 | 77.86 | 89.05 | 97.62 | 107.89 | 118.14 | 132.33 | 151 | 171.21 | 190.76 | 212.55 | 239.57 |
| 672.0 | 16.09 | 18.58 | 22.75 | 26.5 | 32.62 | 37.39 | 46.06 | 52 | 58.59 | 65.31 | 76.71 | 87.65 | 96.05 | 106.13 | 116.22 | 130.04 | 148.57 | 168.36 | 187.54 | 209.07 | 235.83 |
| 673.0 | 15.74 | 18.26 | 22.38 | 25.96 | 31.88 | 36.83 | 45.22 | 51.07 | 57.6 | 64.3 | 75.35 | 86.2 | 94.5 | 104.12 | 113.92 | 127.68 | 146.1 | 165.41 | 184.25 | 205.51 | 231.75 |
| 674.0 | 15.6 | 18.16 | 22.15 | 25.72 | 31.36 | 36.23 | 44.49 | 50.28 | 56.78 | 63.25 | 74.21 | 84.81 | 92.99 | 102.3 | 111.96 | 125.37 | 143.45 | 162.6 | 181.18 | 201.83 | 227.83 |
| 675.0 | 15.51 | 17.96 | 21.96 | 25.57 | 31.12 | 35.65 | 44.08 | 49.59 | 55.98 | 62.32 | 73.08 | 83.33 | 91.45 | 100.79 | 110.15 | 123.18 | 141.11 | 159.74 | 178.04 | 197.91 | 223.49 |
| 676.0 | 15.35 | 17.78 | 21.65 | 25.29 | 30.76 | 35.14 | 43.34 | 48.9 | 55.19 | 61.33 | 71.99 | 81.86 | 89.53 | 99.03 | 108.38 | 121.08 | 138.68 | 156.9 | 174.77 | 194.25 | 219.17 |
| 677.0 | 15.15 | 17.43 | 21.16 | 24.98 | 30.27 | 34.58 | 42.66 | 48.04 | 54.24 | 60.2 | 70.74 | 80.32 | 87.78 | 97.41 | 106.37 | 118.56 | 136.02 | 153.75 | 171.23 | 190.19 | 214.87 |
| 678.0 | 14.98 | 17.26 | 20.76 | 24.57 | 29.83 | 34.14 | 42.1 | 47.25 | 53.38 | 59.05 | 69.41 | 79.05 | 86.18 | 95.57 | 104.31 | 116.32 | 133.4 | 150.55 | 167.83 | 186.21 | 210.24 |
| 679.0 | 14.9 | 17.02 | 20.66 | 24.07 | 29.43 | 33.82 | 41.46 | 46.48 | 52.58 | 58 | 68.21 | 77.53 | 84.71 | 93.67 | 102.42 | 114.23 | 130.74 | 147.6 | 163.93 | 182.11 | 205.58 |
| 680.0 | 14.65 | 16.78 | 20.44 | 23.6 | 28.91 | 33.18 | 40.65 | 45.69 | 51.73 | 56.79 | 66.92 | 76.07 | 82.95 | 91.61 | 100.3 | 111.7 | 127.99 | 144.36 | 160.48 | 177.98 | 200.84 |
| 681.0 | 14.26 | 16.47 | 20.03 | 23.27 | 28.47 | 32.76 | 39.74 | 44.96 | 50.89 | 55.82 | 65.52 | 74.4 | 81.39 | 89.7 | 98.2 | 109.19 | 125.28 | 141.07 | 156.92 | 173.88 | 196.38 |
| 682.0 | 14 | 16.45 | 19.83 | 23.08 | 27.91 | 32.32 | 39.09 | 44.2 | 49.95 | 54.84 | 64.37 | 73.06 | 79.89 | 87.88 | 96.21 | 106.99 | 122.73 | 138.01 | 153.44 | 169.9 | 191.63 |
| 683.0 | 13.81 | 16.19 | 19.68 | 22.95 | 27.52 | 31.88 | 38.6 | 43.64 | 49.13 | 54 | 63.33 | 71.77 | 78.49 | 86.23 | 94.39 | 104.71 | 120.1 | 135.16 | 150.18 | 165.98 | 187.18 |
| 684.0 | 13.72 | 16.05 | 19.25 | 22.6 | 27.23 | 31.59 | 38.05 | 43.04 | 48.56 | 53.2 | 62.22 | 70.69 | 76.94 | 84.39 | 92.44 | 102.66 | 117.49 | 132.31 | 146.85 | 162.31 | 182.67 |
| 685.0 | 13.61 | 15.68 | 18.9 | 22.3 | 26.76 | 31.15 | 37.39 | 42.28 | 47.78 | 52.29 | 61.1 | 69.53 | 75.22 | 82.55 | 90.47 | 100.66 | 114.65 | 129.49 | 143.45 | 158.36 | 178.07 |
| 686.0 | 13.59 | 15.52 | 18.58 | 22 | 26.35 | 30.93 | 36.81 | 41.59 | 46.97 | 51.49 | 60.07 | 68.1 | 73.82 | 80.68 | 88.56 | 98.67 | 112.29 | 126.44 | 140.44 | 154.68 | 173.63 |
| 687.0 | 13.47 | 15.51 | 18.49 | 21.64 | 25.98 | 30.62 | 36.36 | 40.99 | 46.38 | 50.63 | 59.03 | 66.85 | 72.39 | 79.08 | 86.8 | 96.62 | 109.94 | 123.74 | 137.1 | 150.96 | 169.42 |
| 688.0 | 13.47 | 15.35 | 18.34 | 21.37 | 25.7 | 30.21 | 35.83 | 40.44 | 45.83 | 49.73 | 58.04 | 65.83 | 71.06 | 77.54 | 85.16 | 94.55 | 107.61 | 120.7 | 133.91 | 147.48 | 165.1 |
| 689.0 | 13.29 | 15.06 | 18 | 21.08 | 25.41 | 29.8 | 35.4 | 39.9 | 44.93 | 49.01 | 57.09 | 64.63 | 69.79 | 76.17 | 83.59 | 92.27 | 105.34 | 118.02 | 130.88 | 144.03 | 161.2 |
| 690.0 | 13.2 | 15.02 | 17.82 | 20.79 | 25.11 | 29.45 | 34.94 | 39.29 | 44.21 | 48.27 | 56.1 | 63.59 | 68.66 | 74.84 | 81.99 | 90.55 | 103.16 | 115.51 | 128.02 | 140.6 | 157.41 |
| 691.0 | 13.18 | 14.73 | 17.6 | 20.54 | 24.71 | 29.02 | 34.41 | 38.84 | 43.71 | 47.35 | 55.23 | 62.52 | 67.32 | 73.53 | 80.39 | 88.92 | 101.06 | 112.98 | 125.26 | 137.43 | 153.57 |
| 692.0 | 13.1 | 14.55 | 17.55 | 20.43 | 24.37 | 28.8 | 33.93 | 38.15 | 43.17 | 46.79 | 54.45 | 61.6 | 66.31 | 72.37 | 79.11 | 87.43 | 99.01 | 110.87 | 122.54 | 134.37 | 150.01 |
| 693.0 | 13.06 | 14.36 | 17.33 | 20.22 | 24.07 | 28.53 | 33.51 | 37.69 | 42.66 | 46.14 | 53.58 | 60.67 | 65.2 | 71.21 | 77.64 | 85.78 | 97.07 | 108.8 | 120.37 | 131.56 | 146.36 |
| 694.0 | 13.15 | 14.47 | 17.33 | 20.27 | 24.18 | 28.45 | 33.37 | 37.59 | 42.48 | 45.91 | 53.12 | 59.94 | 64.32 | 70.5 | 76.81 | 84.64 | 95.54 | 107.08 | 118.49 | 128.98 | 143.46 |
| 695.0 | 13.01 | 14.35 | 17.21 | 20.05 | 24.2 | 28.19 | 33.11 | 37.3 | 41.98 | 45.51 | 52.44 | 59.07 | 63.5 | 69.49 | 75.56 | 83.34 | 93.94 | 105.19 | 116.2 | 126.52 | 140.31 |
| 696.0 | 12.91 | 14.45 | 17.09 | 19.82 | 24.05 | 28 | 32.69 | 36.98 | 41.63 | 44.96 | 51.95 | 58.37 | 62.71 | 68.52 | 74.35 | 82.2 | 92.27 | 103.61 | 114.2 | 124.28 | 137.66 |
| 697.0 | 12.66 | 14.24 | 16.97 | 19.56 | 23.96 | 27.77 | 32.28 | 36.48 | 41.16 | 44.24 | 51.29 | 57.53 | 62.02 | 67.55 | 73.21 | 80.79 | 90.65 | 101.8 | 112.06 | 121.76 | 134.91 |
| 698.0 | 12.76 | 14.36 | 17.05 | 19.56 | 23.93 | 27.82 | 32.15 | 36.43 | 40.75 | 44 | 50.99 | 56.99 | 61.49 | 66.79 | 72.28 | 80.03 | 89.26 | 100.41 | 110.35 | 119.8 | 132.63 |
| 699.0 | 12.73 | 14.35 | 17.21 | 19.54 | 23.74 | 27.66 | 31.95 | 36.24 | 40.27 | 43.68 | 50.58 | 56.35 | 60.84 | 66 | 71.49 | 78.91 | 87.9 | 98.93 | 108.65 | 117.7 | 130.46 |
| 700.0 | 12.57 | 14.3 | 16.96 | 19.44 | 23.55 | 27.3 | 31.79 | 36.03 | 39.95 | 43.27 | 50.11 | 55.92 | 60.15 | 65.22 | 70.7 | 78.06 | 86.84 | 97.64 | 107.19 | 116.25 | 128.45 |
| 701.0 | 12.62 | 14.17 | 16.78 | 19.42 | 23.51 | 27.15 | 31.64 | 35.79 | 39.66 | 42.98 | 49.8 | 55.49 | 59.63 | 64.56 | 70.21 | 77.27 | 85.76 | 96.53 | 105.82 | 114.68 | 126.75 |
| 702.0 | 12.57 | 14.12 | 16.71 | 19.25 | 23.4 | 26.89 | 31.42 | 35.67 | 39.22 | 42.63 | 49.56 | 54.96 | 59.05 | 64.07 | 69.59 | 76.58 | 84.68 | 95.57 | 104.44 | 113.18 | 124.87 |
| 703.0 | 12.4 | 13.88 | 16.55 | 18.95 | 23.35 | 26.54 | 31.21 | 35.42 | 38.82 | 42.17 | 48.96 | 54.51 | 58.34 | 63.32 | 68.91 | 75.7 | 83.8 | 94.45 | 103.08 | 111.72 | 123.28 |
| 704.0 | 12.35 | 13.8 | 16.46 | 18.75 | 23.3 | 26.39 | 31.12 | 35.09 | 38.6 | 42.01 | 48.61 | 54.27 | 57.79 | 62.78 | 68.46 | 75.07 | 82.95 | 93.45 | 101.95 | 110.34 | 121.84 |
| 705.0 | 12.18 | 13.72 | 16.3 | 18.58 | 23.1 | 26.23 | 30.94 | 34.89 | 38.34 | 41.63 | 48.19 | 53.67 | 57.45 | 62.39 | 67.77 | 74.22 | 82.2 | 92.53 | 100.98 | 109.09 | 120.33 |
| 706.0 | 12.16 | 13.77 | 16.36 | 18.68 | 23.13 | 26.21 | 30.98 | 34.83 | 38.23 | 41.49 | 48.06 | 53.29 | 57.23 | 62.33 | 67.41 | 73.86 | 81.93 | 91.87 | 100.33 | 108.23 | 119.43 |
| 707.0 | 12 | 13.88 | 16.47 | 18.83 | 23.35 | 26.17 | 31.11 | 34.89 | 38.18 | 41.6 | 48.14 | 53.28 | 57.27 | 62.39 | 67.16 | 73.42 | 81.64 | 91.6 | 99.76 | 107.76 | 118.76 |
| 708.0 | 12.19 | 14.03 | 16.57 | 18.99 | 23.52 | 26.35 | 31.17 | 34.96 | 38.31 | 41.64 | 48.08 | 53.38 | 57.4 | 62.46 | 67.18 | 73.36 | 81.47 | 91.38 | 99.5 | 107.55 | 118.2 |
| 709.0 | 12.2 | 14.11 | 16.67 | 19.04 | 23.45 | 26.41 | 31.13 | 35.03 | 38.38 | 41.58 | 48.1 | 53.29 | 57.37 | 62.44 | 66.97 | 73.18 | 81.34 | 91.21 | 99.11 | 107.16 | 117.86 |
| 710.0 | 12.26 | 14.23 | 16.9 | 19.14 | 23.42 | 26.4 | 30.98 | 34.99 | 38.5 | 41.59 | 48.12 | 53.23 | 57.06 | 62.39 | 66.8 | 73.15 | 81.37 | 91.07 | 98.75 | 106.83 | 117.48 |
| 711.0 | 12.28 | 14.15 | 16.88 | 19.11 | 23.38 | 26.51 | 31.09 | 35.02 | 38.61 | 41.56 | 48.13 | 53.19 | 57.03 | 62.35 | 66.66 | 73.04 | 81.48 | 90.97 | 98.44 | 106.48 | 117.21 |
| 712.0 | 12.16 | 14.37 | 16.95 | 19.16 | 23.49 | 26.56 | 31.26 | 34.83 | 38.57 | 41.77 | 48.28 | 53.24 | 56.94 | 62.22 | 66.59 | 72.93 | 81.47 | 90.83 | 98.16 | 106.11 | 117.04 |
| 713.0 | 12.21 | 14.4 | 16.86 | 19.16 | 23.53 | 26.4 | 31.3 | 34.89 | 38.51 | 41.57 | 48.2 | 53.03 | 56.89 | 62.04 | 66.47 | 72.74 | 81.38 | 90.45 | 98 | 105.97 | 116.75 |
| 714.0 | 12.2 | 14.46 | 16.98 | 19.2 | 23.49 | 26.32 | 31.3 | 34.81 | 38.45 | 41.56 | 48.29 | 53.05 | 56.84 | 62.08 | 66.51 | 72.8 | 81.41 | 90.35 | 97.86 | 105.76 | 116.92 |
| 715.0 | 12.08 | 14.18 | 16.91 | 19.04 | 23.29 | 26.13 | 31.15 | 34.41 | 38.32 | 41.28 | 48.13 | 52.94 | 56.76 | 61.69 | 66.37 | 72.6 | 81.18 | 90.17 | 97.64 | 105.48 | 116.6 |
| 716.0 | 12.12 | 14.14 | 16.95 | 19.04 | 23.25 | 26.23 | 31.16 | 34.34 | 38.32 | 41.21 | 48.04 | 52.94 | 56.76 | 61.66 | 66.38 | 72.67 | 81.22 | 90.17 | 97.73 | 105.63 | 116.82 |
| 717.0 | 11.95 | 13.84 | 16.81 | 19 | 22.96 | 26.16 | 31.11 | 34.18 | 38.2 | 41.14 | 47.92 | 52.93 | 56.62 | 61.65 | 66.43 | 72.51 | 81.35 | 90.12 | 97.68 | 105.43 | 116.69 |
| 718.0 | 12.06 | 13.83 | 16.71 | 19 | 22.92 | 26.36 | 31.23 | 34.4 | 38.08 | 41.43 | 47.97 | 53.09 | 56.74 | 61.77 | 66.54 | 72.6 | 81.58 | 90.25 | 98.03 | 105.92 | 117.02 |
| 719.0 | 11.97 | 13.74 | 16.6 | 19.07 | 22.9 | 26.16 | 31.13 | 34.21 | 38.16 | 41.29 | 47.86 | 53.09 | 56.68 | 61.74 | 66.62 | 72.61 | 81.74 | 90.47 | 98.3 | 106.25 | 117.26 |
| 720.0 | 11.87 | 13.65 | 16.4 | 19.16 | 22.96 | 26.16 | 31.17 | 34.26 | 38.15 | 41.18 | 47.8 | 53.12 | 56.72 | 62.03 | 66.74 | 72.94 | 82.04 | 90.8 | 98.54 | 106.87 | 117.55 |
| 721.0 | 12.02 | 13.54 | 16.55 | 19.22 | 22.94 | 26.21 | 31.1 | 34.31 | 38.35 | 41.12 | 47.84 | 53.32 | 56.92 | 61.93 | 66.82 | 72.99 | 82.12 | 90.89 | 99.24 | 107.12 | 118.07 |
| 722.0 | 11.92 | 13.52 | 16.67 | 19.3 | 23.08 | 26.33 | 31.16 | 34.54 | 38.29 | 41.22 | 47.87 | 53.3 | 57.06 | 61.97 | 66.84 | 73.28 | 82.47 | 91.19 | 99.9 | 107.75 | 118.85 |
| 723.0 | 12.01 | 13.69 | 16.78 | 19.32 | 23.18 | 26.62 | 31.22 | 34.49 | 38.4 | 41.32 | 47.95 | 53.7 | 57.26 | 62.16 | 67.13 | 73.67 | 82.84 | 91.71 | 100.61 | 108.37 | 119.98 |
| 724.0 | 11.95 | 13.7 | 16.6 | 19.09 | 23.03 | 26.51 | 31.16 | 34.44 | 38.15 | 41.21 | 48.1 | 53.62 | 57.37 | 62.37 | 67.25 | 73.93 | 83.16 | 92.08 | 101.3 | 109.1 | 120.82 |
| 725.0 | 12.06 | 13.89 | 16.52 | 19.35 | 23.02 | 26.57 | 31.27 | 34.68 | 38.41 | 41.28 | 48.43 | 53.93 | 57.67 | 62.7 | 67.47 | 74.57 | 83.84 | 92.68 | 102.17 | 109.98 | 121.75 |
| 726.0 | 12.15 | 13.86 | 16.53 | 19.47 | 23.05 | 26.5 | 31.32 | 34.87 | 38.41 | 41.55 | 48.67 | 54.15 | 57.86 | 62.85 | 67.72 | 75.03 | 84.49 | 93.26 | 102.83 | 110.96 | 122.87 |
| 727.0 | 12.14 | 13.9 | 16.72 | 19.37 | 23.04 | 26.48 | 31.31 | 34.94 | 38.43 | 41.63 | 48.88 | 54.38 | 58.16 | 62.93 | 68.13 | 75.29 | 85.09 | 93.87 | 103.48 | 112.08 | 123.83 |
| 728.0 | 12.21 | 13.93 | 16.64 | 19.22 | 22.83 | 26.44 | 31.18 | 34.89 | 38.28 | 41.57 | 48.8 | 54.46 | 58.36 | 62.94 | 68.36 | 75.77 | 85.44 | 94.32 | 104.02 | 113.03 | 124.97 |
| 729.0 | 11.94 | 13.62 | 16.38 | 18.95 | 22.55 | 26.25 | 31.02 | 34.82 | 37.96 | 41.48 | 48.73 | 54.31 | 58.35 | 62.85 | 68.51 | 75.89 | 85.62 | 94.57 | 104.62 | 113.72 | 125.95 |
| 730.0 | 11.86 | 13.63 | 16.24 | 18.78 | 22.57 | 26.27 | 31.02 | 34.74 | 37.87 | 41.53 | 48.82 | 54.36 | 58.54 | 63.16 | 68.8 | 76.53 | 85.96 | 95.18 | 105.49 | 114.67 | 127.1 |
| 731.0 | 11.68 | 13.57 | 16.1 | 18.67 | 22.51 | 26.37 | 31.09 | 34.7 | 37.89 | 41.62 | 48.87 | 54.63 | 58.77 | 63.35 | 69 | 77 | 86.46 | 95.78 | 106.41 | 115.66 | 128.31 |
| 732.0 | 11.6 | 13.59 | 16.08 | 18.69 | 22.63 | 26.33 | 30.98 | 34.76 | 37.91 | 41.71 | 49.15 | 54.87 | 59.05 | 63.53 | 69.31 | 77.4 | 87.02 | 96.52 | 107.26 | 116.69 | 129.5 |
| 733.0 | 11.54 | 13.46 | 16.04 | 18.5 | 22.56 | 26.25 | 30.99 | 34.83 | 37.77 | 41.53 | 49.15 | 55.04 | 59.49 | 63.78 | 69.74 | 77.67 | 87.6 | 97.22 | 108.14 | 117.74 | 130.84 |
| 734.0 | 11.43 | 13.26 | 16.02 | 18.39 | 22.35 | 26.26 | 31 | 34.7 | 37.92 | 41.56 | 49.17 | 55.35 | 59.79 | 64.06 | 70.06 | 78.17 | 88.08 | 98.03 | 108.99 | 118.86 | 132.2 |
| 735.0 | 11.45 | 13.19 | 15.97 | 18.43 | 22.51 | 26.29 | 31.14 | 34.93 | 38.11 | 41.87 | 49.46 | 55.76 | 60.41 | 64.37 | 70.62 | 78.67 | 88.74 | 98.81 | 109.82 | 120.13 | 133.61 |
| 736.0 | 11.4 | 13.17 | 15.83 | 18.37 | 22.51 | 26.31 | 31.07 | 35.12 | 38.2 | 41.95 | 49.63 | 56.02 | 60.58 | 64.65 | 71.08 | 79.17 | 89.45 | 99.61 | 110.76 | 121.34 | 135.03 |
| 737.0 | 11.42 | 13.36 | 15.92 | 18.51 | 22.54 | 26.42 | 31.22 | 35.27 | 38.27 | 42.18 | 49.94 | 56.32 | 60.84 | 65 | 71.58 | 79.56 | 90.11 | 100.22 | 111.87 | 122.57 | 136.41 |
| 738.0 | 11.5 | 13.42 | 15.89 | 18.55 | 22.58 | 26.51 | 31.36 | 35.48 | 38.47 | 42.34 | 50.17 | 56.5 | 61.21 | 65.33 | 71.86 | 80.14 | 90.82 | 100.84 | 112.93 | 123.74 | 138.03 |
| 739.0 | 11.43 | 13.3 | 15.93 | 18.49 | 22.57 | 26.41 | 31.34 | 35.46 | 38.83 | 42.39 | 50.3 | 56.59 | 61.4 | 65.54 | 72.11 | 80.7 | 91.21 | 101.54 | 113.73 | 124.7 | 139.51 |
| 740.0 | 11.43 | 13.27 | 15.94 | 18.28 | 22.44 | 26.45 | 31.41 | 35.62 | 38.94 | 42.64 | 50.49 | 56.89 | 61.74 | 65.9 | 72.28 | 81.2 | 91.86 | 102.19 | 114.69 | 125.71 | 140.79 |
| 741.0 | 11.39 | 13.27 | 15.95 | 18.08 | 22.46 | 26.41 | 31.28 | 35.69 | 39.09 | 42.97 | 50.61 | 57.1 | 62.07 | 66.03 | 72.52 | 81.69 | 92.46 | 103.09 | 115.64 | 126.55 | 142.26 |
| 742.0 | 11.42 | 13.34 | 16 | 18.3 | 22.57 | 26.45 | 31.41 | 35.82 | 39.11 | 43.23 | 50.79 | 57.02 | 62.39 | 66.53 | 73.11 | 82.11 | 93.05 | 103.97 | 116.19 | 127.46 | 143.43 |
| 743.0 | 11.3 | 13.36 | 15.86 | 18.15 | 22.41 | 26.3 | 31.41 | 35.68 | 39.21 | 43.33 | 50.85 | 57.26 | 62.53 | 66.69 | 73.36 | 82.42 | 93.4 | 104.44 | 116.53 | 128.32 | 144.26 |
| 744.0 | 11.15 | 13.19 | 15.71 | 18.11 | 22.37 | 26.03 | 31.54 | 35.61 | 39.15 | 43.42 | 50.94 | 57.15 | 62.61 | 66.87 | 73.57 | 82.7 | 93.78 | 104.84 | 116.98 | 129.07 | 145.21 |
| 745.0 | 11.05 | 13.21 | 15.8 | 18.04 | 22.43 | 26.17 | 31.57 | 35.66 | 39.37 | 43.51 | 51.04 | 57.25 | 62.63 | 67.1 | 73.77 | 82.99 | 94.18 | 105.3 | 117.25 | 129.68 | 145.96 |
| 746.0 | 10.9 | 12.95 | 15.85 | 17.79 | 22.27 | 26.12 | 31.37 | 35.61 | 39.32 | 43.42 | 50.93 | 57.06 | 62.69 | 67.19 | 73.91 | 82.97 | 94.23 | 105.62 | 117.53 | 130.33 | 146.86 |
| 747.0 | 10.91 | 12.99 | 15.87 | 17.78 | 22.22 | 26.01 | 31.27 | 35.46 | 39.36 | 43.22 | 50.88 | 57.15 | 62.74 | 67.28 | 74.24 | 83.08 | 94.24 | 105.93 | 118 | 130.71 | 147.59 |
| 748.0 | 10.74 | 12.8 | 15.51 | 17.62 | 22.04 | 25.77 | 31.18 | 35.34 | 39.27 | 43.11 | 50.59 | 57.1 | 62.58 | 67.32 | 73.95 | 83.11 | 94.15 | 105.91 | 118.12 | 130.8 | 148.01 |
| 749.0 | 10.74 | 12.86 | 15.59 | 17.64 | 22.06 | 25.81 | 31.27 | 35.42 | 39.54 | 43.14 | 50.7 | 57.07 | 62.58 | 67.55 | 74.26 | 83.21 | 94.31 | 106.25 | 118.59 | 131.22 | 148.37 |
| 750.0 | 10.78 | 13.02 | 15.66 | 17.74 | 22.27 | 25.85 | 31.39 | 35.43 | 39.59 | 43.26 | 50.75 | 57.19 | 62.69 | 67.65 | 74.3 | 83.36 | 94.55 | 106.67 | 118.79 | 131.63 | 148.65 |
| 751.0 | 10.69 | 12.92 | 15.73 | 17.57 | 22.3 | 25.74 | 31.36 | 35.42 | 39.63 | 43.3 | 50.68 | 57.22 | 62.53 | 67.55 | 74.23 | 83.23 | 94.66 | 106.86 | 118.96 | 131.78 | 148.96 |
| 752.0 | 10.82 | 12.84 | 15.77 | 17.56 | 22.27 | 25.69 | 31.26 | 35.62 | 39.67 | 43.32 | 50.54 | 57.02 | 62.63 | 67.6 | 74.27 | 83.05 | 94.5 | 106.72 | 119.13 | 132.03 | 149.23 |
| 753.0 | 10.82 | 12.84 | 15.8 | 17.49 | 22.17 | 25.72 | 31.26 | 35.5 | 39.43 | 43.33 | 50.35 | 56.93 | 62.57 | 67.51 | 74.3 | 83.07 | 94.32 | 106.51 | 119.24 | 132.17 | 149.4 |
| 754.0 | 10.9 | 12.91 | 15.79 | 17.51 | 22.12 | 25.8 | 31.15 | 35.48 | 39.52 | 43.48 | 50.35 | 56.81 | 62.5 | 67.39 | 74.32 | 83.07 | 94.17 | 106.48 | 118.93 | 132.29 | 149.4 |
| 755.0 | 10.95 | 13.08 | 15.74 | 17.48 | 22.2 | 25.62 | 31.01 | 35.44 | 39.32 | 43.49 | 50.21 | 56.63 | 62.41 | 67.39 | 74.31 | 82.91 | 93.94 | 106.42 | 118.77 | 132.38 | 149.34 |
| 756.0 | 10.9 | 13.16 | 15.59 | 17.34 | 22.03 | 25.41 | 30.76 | 35.2 | 39 | 43.26 | 49.97 | 56.28 | 62.01 | 67.11 | 73.92 | 82.66 | 93.54 | 106.17 | 118.72 | 132.21 | 149.13 |
| 757.0 | 10.95 | 13.18 | 15.56 | 17.54 | 22.06 | 25.26 | 30.63 | 34.97 | 38.87 | 43.11 | 50.07 | 56.11 | 61.9 | 66.92 | 73.66 | 82.52 | 93.38 | 105.97 | 118.49 | 132 | 149.17 |
| 758.0 | 10.83 | 12.86 | 15.31 | 17.34 | 21.73 | 24.87 | 30.3 | 34.53 | 38.64 | 42.75 | 49.78 | 55.58 | 61.55 | 66.67 | 73.42 | 82.21 | 92.86 | 105.69 | 117.75 | 131.44 | 148.91 |
| 759.0 | 11.04 | 12.81 | 15.27 | 17.25 | 21.8 | 24.61 | 30.17 | 34.23 | 38.36 | 42.57 | 49.51 | 55.37 | 61.37 | 66.44 | 73.23 | 81.9 | 92.52 | 105.27 | 117.25 | 131.52 | 148.48 |
| 760.0 | 10.9 | 12.83 | 15.16 | 17.13 | 21.59 | 24.36 | 29.98 | 34.03 | 38 | 42.39 | 49.2 | 55.31 | 60.96 | 66.21 | 73.03 | 81.46 | 92.08 | 104.76 | 116.69 | 131.1 | 147.83 |
| 761.0 | 10.7 | 12.66 | 14.97 | 16.85 | 21.34 | 24.25 | 29.62 | 33.71 | 37.61 | 41.99 | 48.77 | 54.9 | 60.54 | 65.65 | 72.82 | 80.83 | 91.49 | 104.12 | 116.03 | 130.51 | 147.06 |
| 762.0 | 10.6 | 12.68 | 14.9 | 16.85 | 21.12 | 24.17 | 29.5 | 33.39 | 37.24 | 41.53 | 48.43 | 54.5 | 60.13 | 65.3 | 72.55 | 80.24 | 90.92 | 103.29 | 115.37 | 129.89 | 146.09 |
| 763.0 | 10.59 | 12.65 | 14.79 | 16.55 | 21.09 | 24.09 | 29.36 | 33.12 | 37.06 | 41.35 | 48.29 | 54.4 | 59.8 | 64.93 | 72.12 | 79.95 | 90.49 | 102.69 | 114.79 | 129.48 | 145.43 |
| 764.0 | 10.51 | 12.6 | 14.69 | 16.43 | 20.84 | 23.88 | 29.16 | 32.83 | 36.79 | 40.99 | 47.88 | 53.92 | 59.34 | 64.65 | 71.64 | 79.4 | 89.89 | 102.24 | 114.28 | 128.58 | 144.72 |
| 765.0 | 10.41 | 12.47 | 14.6 | 16.36 | 20.57 | 23.74 | 28.94 | 32.63 | 36.6 | 40.65 | 47.52 | 53.59 | 59.08 | 64.29 | 71.09 | 78.95 | 89.32 | 101.53 | 113.71 | 127.91 | 143.81 |
| 766.0 | 10.43 | 12.45 | 14.58 | 16.37 | 20.52 | 23.65 | 28.76 | 32.42 | 36.54 | 40.59 | 47.36 | 53.26 | 58.92 | 63.77 | 70.76 | 78.54 | 88.88 | 100.97 | 113.26 | 127.23 | 143.05 |
| 767.0 | 10.38 | 12.37 | 14.4 | 16.24 | 20.4 | 23.44 | 28.56 | 32.14 | 36.27 | 40.39 | 46.97 | 52.96 | 58.43 | 63.3 | 70.24 | 77.85 | 88.17 | 100.18 | 112.48 | 126.41 | 142.07 |
| 768.0 | 10.38 | 12.24 | 14.36 | 16.02 | 20.26 | 23.44 | 28.35 | 31.86 | 35.99 | 40.16 | 46.76 | 52.4 | 58.02 | 62.89 | 69.8 | 77.49 | 87.58 | 99.41 | 111.77 | 125.63 | 141.2 |
| 769.0 | 10.42 | 12.3 | 14.3 | 16.04 | 20.44 | 23.45 | 28.35 | 31.69 | 35.81 | 39.84 | 46.65 | 51.98 | 57.69 | 62.33 | 69.54 | 77.06 | 87.11 | 99.15 | 111.06 | 124.81 | 140.14 |
| 770.0 | 10.22 | 11.88 | 14.18 | 15.84 | 20.14 | 23.13 | 27.92 | 31.26 | 35.34 | 39.38 | 46.1 | 51.57 | 57.06 | 61.7 | 68.59 | 76.36 | 86.51 | 98.39 | 110.05 | 123.68 | 139.05 |
| 771.0 | 10.16 | 11.75 | 14.16 | 15.68 | 19.81 | 22.87 | 27.58 | 30.95 | 35.21 | 38.89 | 45.68 | 51.09 | 56.44 | 61.15 | 67.99 | 75.77 | 85.7 | 97.55 | 109.05 | 122.79 | 138.27 |
| 772.0 | 10.17 | 11.63 | 13.91 | 15.69 | 19.45 | 22.74 | 27.34 | 30.62 | 34.88 | 38.55 | 45.12 | 50.57 | 56.07 | 60.51 | 67.46 | 75.17 | 84.9 | 96.9 | 108.17 | 121.82 | 137 |
| 773.0 | 9.99 | 11.53 | 13.74 | 15.57 | 19.25 | 22.39 | 27.15 | 30.1 | 34.37 | 38.04 | 44.6 | 49.96 | 55.36 | 59.81 | 66.72 | 74.61 | 84.3 | 96.14 | 107.1 | 120.45 | 135.83 |
| 774.0 | 9.76 | 11.51 | 13.49 | 15.58 | 19.1 | 22.08 | 26.8 | 30.03 | 34.17 | 37.59 | 44.21 | 49.52 | 54.92 | 59.27 | 66.21 | 73.9 | 83.62 | 95.35 | 106.1 | 119.41 | 134.76 |
| 775.0 | 9.5 | 11.28 | 13.34 | 15.39 | 18.91 | 21.78 | 26.53 | 29.72 | 33.78 | 37.09 | 43.63 | 48.82 | 54.26 | 58.75 | 65.5 | 73.1 | 82.78 | 94.5 | 105.25 | 118.34 | 133.59 |
| 776.0 | 9.32 | 11.03 | 13.18 | 15.12 | 18.61 | 21.7 | 26.45 | 29.47 | 33.33 | 36.63 | 43.28 | 48.44 | 53.63 | 58.07 | 64.63 | 72.43 | 82.09 | 93.6 | 104.3 | 116.96 | 132.38 |
| 777.0 | 9.16 | 10.58 | 13.22 | 14.88 | 18.28 | 21.54 | 26.19 | 29.06 | 33.13 | 36.1 | 42.71 | 48.06 | 52.91 | 57.56 | 64.13 | 71.65 | 81.44 | 92.86 | 103.08 | 115.71 | 131.09 |
| 778.0 | 8.9 | 10.53 | 13.17 | 14.62 | 18.15 | 21.38 | 26.08 | 28.86 | 32.81 | 35.72 | 42.13 | 47.61 | 52.42 | 57.01 | 63.65 | 70.98 | 80.68 | 92.06 | 101.93 | 114.56 | 129.81 |
| 779.0 | 8.62 | 10.7 | 13.11 | 14.58 | 18.04 | 21.38 | 25.82 | 28.94 | 32.46 | 35.43 | 41.79 | 47.49 | 51.92 | 56.51 | 63.07 | 70.34 | 80.09 | 91.33 | 101.14 | 113.51 | 128.4 |
| 780.0 | 8.22 | 10.59 | 13.06 | 14.33 | 17.76 | 21.19 | 25.45 | 28.63 | 32.03 | 34.98 | 41.39 | 46.99 | 51.2 | 55.83 | 62.4 | 69.62 | 79.3 | 90.43 | 100.17 | 112.1 | 127.02 |
| 781.0 | 8.2 | 10.61 | 12.93 | 14.26 | 17.51 | 21.03 | 25.27 | 28.42 | 31.74 | 34.52 | 41.02 | 46.41 | 50.75 | 55.28 | 61.97 | 68.88 | 78.63 | 89.51 | 99.24 | 110.92 | 125.75 |
| 782.0 | 8.25 | 10.61 | 12.97 | 14.46 | 17.5 | 20.74 | 25.35 | 28.18 | 31.69 | 34.15 | 40.79 | 46.18 | 50.28 | 55.04 | 61.4 | 68.55 | 77.84 | 88.77 | 98.38 | 109.86 | 124.69 |
| 783.0 | 8.19 | 10.39 | 12.84 | 14.34 | 17.27 | 20.41 | 25.08 | 27.84 | 31.56 | 33.89 | 40.51 | 45.82 | 49.88 | 54.43 | 60.53 | 67.89 | 77 | 87.9 | 97.35 | 108.63 | 123.43 |
| 784.0 | 7.92 | 10.2 | 12.55 | 14.17 | 17 | 20.12 | 24.67 | 27.38 | 31.16 | 33.31 | 39.86 | 45.24 | 49.3 | 53.84 | 59.63 | 67.06 | 76 | 86.84 | 96.18 | 107.29 | 122.05 |
| 785.0 | 7.89 | 10.03 | 12.42 | 14.03 | 16.81 | 19.93 | 24.22 | 27.12 | 30.84 | 32.95 | 39.32 | 44.76 | 48.76 | 53.24 | 58.97 | 66.28 | 75.23 | 85.84 | 94.96 | 106.24 | 120.76 |
| 786.0 | 7.95 | 10.03 | 12.34 | 13.99 | 16.69 | 19.76 | 23.81 | 26.93 | 30.62 | 32.57 | 38.83 | 44.31 | 48.26 | 52.77 | 58.52 | 65.59 | 74.52 | 85.16 | 93.97 | 104.98 | 119.59 |
| 787.0 | 7.97 | 9.97 | 12.31 | 13.99 | 16.47 | 19.57 | 23.57 | 26.7 | 30.27 | 32.23 | 38.39 | 43.93 | 47.79 | 52.47 | 57.8 | 64.9 | 73.69 | 84.45 | 93.13 | 103.86 | 118.4 |
| 788.0 | 7.91 | 10 | 12.25 | 13.93 | 16.41 | 19.46 | 23.4 | 26.4 | 29.77 | 31.87 | 38.05 | 43.58 | 47.4 | 51.93 | 57.1 | 64.48 | 73 | 83.63 | 92.18 | 102.76 | 117.17 |
| 789.0 | 7.64 | 9.9 | 12.09 | 13.83 | 16.28 | 19.14 | 23.12 | 26.1 | 29.42 | 31.53 | 37.43 | 43.22 | 46.95 | 51.54 | 56.44 | 63.66 | 72.37 | 82.87 | 91.08 | 101.66 | 115.94 |
| 790.0 | 7.49 | 9.68 | 12.04 | 13.64 | 15.72 | 18.76 | 22.69 | 25.75 | 28.92 | 31.14 | 36.88 | 42.82 | 46.53 | 51.24 | 55.75 | 62.9 | 71.45 | 81.82 | 90.09 | 100.56 | 114.92 |
| 791.0 | 7.52 | 9.68 | 11.88 | 13.38 | 15.63 | 18.53 | 22.53 | 25.42 | 28.75 | 30.85 | 36.63 | 42.53 | 46.18 | 50.78 | 55.45 | 62.34 | 70.68 | 80.85 | 89.2 | 99.42 | 113.9 |
| 792.0 | 7.44 | 9.53 | 11.68 | 13.21 | 15.42 | 18.28 | 22.23 | 25.12 | 28.47 | 30.64 | 36.23 | 42.12 | 45.75 | 50.37 | 55.11 | 61.73 | 70.09 | 80.07 | 88.41 | 98.09 | 112.77 |
| 793.0 | 7.38 | 9.47 | 11.67 | 13.14 | 15.34 | 18.04 | 22.13 | 24.85 | 28.12 | 30.35 | 36.19 | 41.78 | 45.2 | 50.06 | 54.62 | 61.04 | 69.63 | 79.07 | 87.61 | 97.17 | 111.78 |
| 794.0 | 7.38 | 9.49 | 11.63 | 12.92 | 15.27 | 18.02 | 21.98 | 24.79 | 27.92 | 30.13 | 36.04 | 41.55 | 44.97 | 49.65 | 54.27 | 60.58 | 69.09 | 78.45 | 86.83 | 96.44 | 110.71 |
| 795.0 | 7.34 | 9.22 | 11.44 | 12.68 | 15.05 | 17.86 | 21.95 | 24.36 | 27.66 | 29.87 | 35.74 | 41.1 | 44.48 | 49.34 | 53.83 | 60.02 | 68.48 | 77.84 | 86.11 | 95.57 | 109.71 |
| 796.0 | 7.38 | 9.14 | 11.37 | 12.66 | 14.94 | 17.74 | 21.76 | 24.21 | 27.36 | 29.75 | 35.61 | 41.02 | 44.25 | 48.9 | 53.36 | 59.68 | 68.14 | 77.26 | 85.63 | 94.8 | 108.73 |
| 797.0 | 7.52 | 9.27 | 11.46 | 12.79 | 15.15 | 17.77 | 21.53 | 24.25 | 27.35 | 29.8 | 35.5 | 40.98 | 43.98 | 48.74 | 53.36 | 59.48 | 67.88 | 76.94 | 85.21 | 94.5 | 108.2 |
| 798.0 | 7.61 | 9.61 | 11.44 | 12.85 | 15.23 | 17.67 | 21.42 | 24.24 | 27.22 | 29.8 | 35.44 | 40.76 | 43.88 | 48.46 | 53.09 | 59.3 | 67.56 | 76.54 | 84.92 | 94.14 | 107.5 |
| 799.0 | 7.57 | 9.44 | 11.16 | 12.68 | 14.94 | 17.49 | 21.14 | 24.05 | 26.96 | 29.65 | 35.07 | 40.36 | 43.57 | 48.2 | 52.57 | 58.93 | 66.95 | 75.94 | 84.32 | 93.59 | 106.79 |
| 800.0 | 7.73 | 9.32 | 11.16 | 12.65 | 15.04 | 17.43 | 21.23 | 23.84 | 26.82 | 29.75 | 34.94 | 40.22 | 43.53 | 48.05 | 52.3 | 58.72 | 66.71 | 75.67 | 84.15 | 93.02 | 106.4 |
| 801.0 | 7.76 | 9.33 | 11.04 | 12.74 | 15.01 | 17.45 | 21.13 | 23.82 | 26.93 | 29.75 | 34.74 | 40.06 | 43.43 | 47.93 | 52.15 | 58.43 | 66.22 | 75.43 | 83.88 | 92.64 | 105.99 |
| 802.0 | 8.03 | 9.5 | 11.27 | 12.99 | 15.28 | 17.62 | 21.26 | 23.84 | 26.98 | 29.79 | 34.69 | 40.24 | 43.55 | 47.99 | 51.94 | 58.57 | 66.16 | 75.44 | 83.76 | 92.58 | 106.06 |
| 803.0 | 7.86 | 9.4 | 11.1 | 12.81 | 15.18 | 17.67 | 20.94 | 23.71 | 26.73 | 29.85 | 34.52 | 39.99 | 43.6 | 47.62 | 51.65 | 58.25 | 66.13 | 75.01 | 83.29 | 92.2 | 105.65 |
| 804.0 | 7.88 | 9.43 | 11.01 | 12.76 | 15.22 | 17.63 | 20.73 | 23.71 | 26.74 | 29.81 | 34.44 | 39.95 | 43.4 | 47.63 | 51.75 | 58.03 | 66.08 | 74.68 | 83.15 | 92 | 105.37 |
| 805.0 | 7.86 | 9.42 | 11.14 | 12.75 | 15.2 | 17.66 | 20.75 | 23.82 | 26.67 | 29.95 | 34.59 | 39.88 | 43.31 | 47.51 | 51.86 | 57.91 | 66.04 | 74.63 | 83.16 | 91.82 | 105.2 |
| 806.0 | 7.8 | 9.45 | 11.09 | 12.72 | 15.19 | 17.71 | 20.9 | 23.78 | 26.75 | 30 | 34.79 | 39.93 | 43.42 | 47.55 | 51.99 | 57.88 | 66.02 | 74.51 | 83.08 | 91.83 | 105.25 |
| 807.0 | 7.66 | 9.37 | 11.06 | 12.62 | 15.12 | 17.67 | 20.78 | 23.66 | 26.7 | 29.98 | 34.87 | 39.96 | 43.44 | 47.28 | 51.9 | 57.77 | 65.81 | 74.33 | 82.96 | 91.73 | 104.9 |
| 808.0 | 7.65 | 9.31 | 11.02 | 12.66 | 15.22 | 17.69 | 20.88 | 23.58 | 26.69 | 29.92 | 34.83 | 39.99 | 43.41 | 47.14 | 52.07 | 57.63 | 65.8 | 74.19 | 82.64 | 91.64 | 104.93 |
| 809.0 | 7.48 | 9.27 | 10.98 | 12.65 | 15.25 | 17.71 | 20.84 | 23.62 | 26.85 | 29.89 | 34.93 | 40.07 | 43.41 | 47.27 | 52.18 | 57.47 | 66 | 74.29 | 82.66 | 91.59 | 104.89 |
| 810.0 | 7.62 | 9.24 | 10.99 | 12.57 | 15.1 | 17.76 | 20.99 | 23.55 | 26.74 | 29.9 | 34.96 | 40.08 | 43.42 | 47.1 | 52.24 | 57.61 | 65.99 | 74.26 | 82.7 | 91.47 | 104.8 |
| 811.0 | 7.61 | 9.36 | 11.13 | 12.57 | 15.38 | 18.08 | 21.14 | 23.79 | 26.93 | 30.1 | 35.12 | 40.33 | 43.46 | 47.27 | 52.49 | 57.8 | 66.28 | 74.32 | 82.89 | 91.58 | 104.82 |
| 812.0 | 7.64 | 9.55 | 11.12 | 12.72 | 15.42 | 18.04 | 21.1 | 23.93 | 26.86 | 30.23 | 35.16 | 40.2 | 43.52 | 47.27 | 52.38 | 57.76 | 66.26 | 74.55 | 82.8 | 91.59 | 104.89 |
| 813.0 | 7.78 | 9.68 | 11.24 | 12.8 | 15.59 | 18.16 | 21.13 | 23.88 | 26.84 | 30.27 | 35.09 | 40.18 | 43.69 | 47.47 | 52.32 | 57.75 | 66.29 | 74.44 | 82.78 | 91.63 | 104.51 |
| 814.0 | 7.63 | 9.64 | 11.15 | 12.78 | 15.55 | 18.11 | 20.88 | 23.85 | 26.8 | 30.13 | 35.02 | 40.05 | 43.83 | 47.29 | 52.37 | 57.72 | 66.13 | 74.39 | 82.67 | 91.48 | 104.37 |
| 815.0 | 7.68 | 9.46 | 11.04 | 12.8 | 15.54 | 18.13 | 20.86 | 23.84 | 26.86 | 30.17 | 34.96 | 39.99 | 43.72 | 47.31 | 52.33 | 57.72 | 65.9 | 74.24 | 82.63 | 91.4 | 104.26 |
| 816.0 | 7.68 | 9.58 | 11.2 | 12.86 | 15.49 | 18.15 | 20.91 | 23.96 | 26.78 | 30.09 | 34.89 | 40.13 | 43.75 | 47.26 | 52.16 | 57.91 | 65.77 | 74.3 | 82.53 | 91.35 | 104.05 |
| 817.0 | 7.73 | 9.74 | 11.28 | 12.89 | 15.59 | 18.24 | 20.98 | 23.94 | 27.04 | 30.16 | 34.88 | 40.19 | 43.86 | 47.59 | 52.26 | 57.9 | 65.72 | 74.3 | 82.65 | 91.33 | 104.09 |
| 818.0 | 7.73 | 9.55 | 11.12 | 12.73 | 15.44 | 18.07 | 20.9 | 23.69 | 27.07 | 30.02 | 34.77 | 39.9 | 43.79 | 47.46 | 52.01 | 57.64 | 65.55 | 73.88 | 82.41 | 91.01 | 103.71 |
| 819.0 | 7.7 | 9.35 | 10.98 | 12.75 | 15.4 | 18.07 | 20.9 | 23.62 | 27 | 29.71 | 34.65 | 39.67 | 43.72 | 47.47 | 51.75 | 57.29 | 65.32 | 73.69 | 82.12 | 90.69 | 103.5 |
| 820.0 | 7.72 | 9.29 | 11.12 | 12.74 | 15.4 | 18.1 | 20.88 | 23.61 | 27.03 | 29.72 | 34.7 | 39.69 | 43.58 | 47.32 | 51.62 | 57.24 | 65.22 | 73.48 | 82.12 | 90.53 | 103.34 |
| 821.0 | 7.5 | 9.21 | 11.05 | 12.52 | 15.24 | 18.06 | 20.68 | 23.4 | 26.9 | 29.45 | 34.48 | 39.44 | 43.21 | 47.26 | 51.27 | 57.07 | 64.84 | 73.07 | 81.7 | 90.45 | 102.92 |
| 822.0 | 7.52 | 9.13 | 10.93 | 12.28 | 15.03 | 17.91 | 20.61 | 23.33 | 26.69 | 29.22 | 34.46 | 39.3 | 43.06 | 47.08 | 51 | 56.99 | 64.65 | 72.66 | 81.09 | 90.04 | 102.46 |
| 823.0 | 7.16 | 8.84 | 10.72 | 11.94 | 14.71 | 17.59 | 20.3 | 23.04 | 26.46 | 29.04 | 34.16 | 38.98 | 42.66 | 46.78 | 50.68 | 56.58 | 64.23 | 72.22 | 80.69 | 89.43 | 101.63 |
| 824.0 | 7.19 | 8.83 | 10.68 | 11.78 | 14.72 | 17.57 | 20.37 | 23.02 | 26.34 | 28.77 | 34 | 38.7 | 42.36 | 46.74 | 50.47 | 56.31 | 63.81 | 71.96 | 80.4 | 89.03 | 101.18 |
| 825.0 | 7.23 | 8.82 | 10.84 | 11.8 | 14.82 | 17.68 | 20.34 | 23.1 | 26.23 | 28.78 | 33.99 | 38.6 | 42.33 | 46.6 | 50.29 | 56.15 | 63.71 | 72.12 | 80.09 | 88.82 | 100.95 |
| 826.0 | 7.25 | 8.87 | 10.8 | 11.74 | 14.77 | 17.68 | 20.2 | 23.02 | 26.3 | 28.64 | 33.82 | 38.43 | 42.12 | 46.39 | 49.87 | 55.89 | 63.55 | 71.73 | 79.75 | 88.43 | 100.5 |
| 827.0 | 7.24 | 8.85 | 10.78 | 11.65 | 14.84 | 17.52 | 19.92 | 23.01 | 26.04 | 28.45 | 33.62 | 38.2 | 42.03 | 46.13 | 49.59 | 55.76 | 63.11 | 71.36 | 79.29 | 87.76 | 99.68 |
| 828.0 | 7.32 | 8.72 | 10.75 | 11.47 | 14.72 | 17.5 | 20 | 22.79 | 25.81 | 28.38 | 33.41 | 38 | 41.74 | 45.91 | 49.4 | 55.47 | 62.91 | 71.04 | 78.85 | 87.43 | 99.29 |
| 829.0 | 7.39 | 8.71 | 10.76 | 11.47 | 14.64 | 17.55 | 19.96 | 22.86 | 25.84 | 28.38 | 33.41 | 37.93 | 41.73 | 45.82 | 49.19 | 55.35 | 62.56 | 70.77 | 78.77 | 87.08 | 98.83 |
| 830.0 | 7.49 | 8.52 | 10.83 | 11.32 | 14.45 | 17.32 | 19.8 | 22.66 | 25.56 | 28.15 | 33.01 | 37.56 | 41.47 | 45.49 | 48.89 | 55.07 | 62.03 | 70.35 | 78.21 | 86.7 | 98.15 |
| 831.0 | 7.3 | 8.4 | 10.62 | 11.3 | 14.54 | 17.15 | 19.58 | 22.6 | 25.4 | 28 | 32.93 | 37.41 | 41.25 | 45.2 | 48.52 | 54.76 | 61.55 | 69.96 | 77.75 | 86.1 | 97.51 |
| 832.0 | 7.25 | 8.27 | 10.37 | 11.24 | 14.35 | 16.91 | 19.33 | 22.31 | 25.18 | 27.79 | 32.71 | 36.99 | 41.06 | 44.7 | 48.14 | 54.47 | 61.05 | 69.45 | 77.19 | 85.44 | 96.91 |
| 833.0 | 7.27 | 8.03 | 10.4 | 11.27 | 14.39 | 16.96 | 19.33 | 22.27 | 25 | 27.71 | 32.49 | 36.82 | 40.75 | 44.25 | 48.07 | 54.31 | 60.98 | 68.92 | 76.75 | 85.08 | 96.2 |
| 834.0 | 7.16 | 7.98 | 10.16 | 11.04 | 14.29 | 16.83 | 19.33 | 22.33 | 24.85 | 27.63 | 32.54 | 36.57 | 40.48 | 43.88 | 47.66 | 54.09 | 60.46 | 68.66 | 76.34 | 84.69 | 95.84 |
| 835.0 | 7.35 | 7.99 | 10.19 | 11.05 | 14.43 | 16.9 | 19.42 | 22.25 | 24.79 | 27.73 | 32.4 | 36.57 | 40.23 | 43.65 | 47.42 | 53.99 | 60.4 | 68.33 | 75.75 | 84.28 | 95.37 |
| 836.0 | 7.22 | 8.11 | 10.16 | 11.04 | 14.37 | 16.8 | 19.35 | 22.05 | 24.51 | 27.56 | 32.31 | 36.49 | 40.23 | 43.36 | 47.06 | 53.65 | 60.17 | 67.95 | 75.23 | 83.7 | 94.89 |
| 837.0 | 7.28 | 8.11 | 10.12 | 11.03 | 14.54 | 16.8 | 19.2 | 21.98 | 24.57 | 27.67 | 32.24 | 36.28 | 40.09 | 43.15 | 46.98 | 53.19 | 60.05 | 67.59 | 74.76 | 83.32 | 94.48 |
| 838.0 | 7.2 | 7.96 | 10.01 | 10.98 | 14.41 | 16.53 | 19.11 | 21.76 | 24.34 | 27.29 | 32.04 | 35.98 | 39.68 | 42.76 | 46.68 | 52.95 | 59.44 | 67.01 | 74.11 | 82.77 | 94.01 |
| 839.0 | 6.95 | 7.88 | 9.97 | 10.99 | 14.27 | 16.43 | 19.06 | 21.56 | 24.11 | 26.86 | 31.82 | 35.76 | 39.41 | 42.5 | 46.45 | 52.52 | 58.96 | 66.58 | 73.59 | 82.34 | 93.39 |
| 840.0 | 6.83 | 7.94 | 10.02 | 10.93 | 14.23 | 16.37 | 19 | 21.53 | 23.97 | 26.9 | 31.67 | 35.67 | 39.25 | 42.32 | 46.18 | 52.51 | 58.81 | 65.99 | 73.2 | 81.63 | 92.75 |
| 841.0 | 6.71 | 7.97 | 9.96 | 10.87 | 14.11 | 16.3 | 18.9 | 21.39 | 23.72 | 26.58 | 31.43 | 35.4 | 39.1 | 41.94 | 46.13 | 51.92 | 58.4 | 65.49 | 72.54 | 81.12 | 92.15 |
| 842.0 | 6.87 | 7.91 | 9.91 | 11.01 | 14.07 | 16.16 | 18.8 | 21.35 | 23.75 | 26.5 | 31.37 | 35.31 | 39.13 | 41.39 | 46.03 | 51.51 | 58.3 | 65.07 | 72.11 | 80.59 | 91.54 |
| 843.0 | 6.8 | 7.91 | 9.98 | 11.1 | 14.16 | 16.02 | 18.68 | 21.09 | 23.55 | 26.27 | 31.12 | 35.04 | 38.88 | 41.18 | 45.84 | 51.15 | 57.92 | 64.88 | 71.73 | 80.12 | 91.06 |
| 844.0 | 6.82 | 7.8 | 9.95 | 11 | 14.12 | 15.96 | 18.48 | 20.99 | 23.38 | 26.08 | 31.14 | 34.66 | 38.67 | 40.71 | 45.62 | 50.86 | 57.45 | 64.43 | 71.09 | 79.53 | 90.56 |
| 845.0 | 6.7 | 7.71 | 9.97 | 11.05 | 14.14 | 15.87 | 18.32 | 20.81 | 23.36 | 25.93 | 31.04 | 34.6 | 38.41 | 40.49 | 45.42 | 50.47 | 56.97 | 64.06 | 70.69 | 78.98 | 89.72 |
| 846.0 | 6.52 | 7.57 | 9.82 | 10.89 | 13.98 | 15.79 | 18.34 | 20.66 | 23.23 | 25.67 | 30.71 | 34.23 | 38.03 | 40.14 | 45.07 | 50.12 | 56.45 | 63.49 | 70.12 | 78.41 | 89.03 |
| 847.0 | 6.61 | 7.58 | 9.83 | 10.94 | 13.9 | 15.74 | 18.36 | 20.57 | 23.03 | 25.57 | 30.49 | 34.16 | 37.89 | 40.04 | 44.87 | 49.85 | 56.22 | 63.14 | 69.72 | 77.97 | 88.43 |
| 848.0 | 6.54 | 7.54 | 9.86 | 10.93 | 13.78 | 15.71 | 18.3 | 20.41 | 23.06 | 25.38 | 30.31 | 33.92 | 37.47 | 39.83 | 44.54 | 49.52 | 55.86 | 62.74 | 69.36 | 77.53 | 88.04 |
| 849.0 | 6.4 | 7.56 | 9.7 | 10.95 | 13.82 | 15.48 | 18.18 | 20.35 | 22.91 | 25.22 | 30.04 | 33.78 | 37.25 | 39.76 | 44.07 | 49.22 | 55.38 | 62.21 | 68.86 | 76.93 | 87.31 |
| 850.0 | 6.25 | 7.45 | 9.56 | 10.86 | 13.77 | 15.23 | 17.93 | 20.09 | 22.76 | 25 | 29.72 | 33.46 | 36.76 | 39.54 | 43.58 | 48.82 | 55.14 | 61.59 | 68.12 | 76.27 | 86.52 |
| 851.0 | 6.11 | 7.54 | 9.46 | 10.85 | 13.55 | 15.19 | 17.86 | 20.01 | 22.66 | 24.99 | 29.66 | 33.19 | 36.51 | 39.22 | 43.24 | 48.53 | 54.81 | 61.22 | 67.75 | 75.53 | 86.06 |
| 852.0 | 6.21 | 7.56 | 9.52 | 10.78 | 13.52 | 15.27 | 17.79 | 20.03 | 22.76 | 24.95 | 29.46 | 32.94 | 36.28 | 39.02 | 43.03 | 48.06 | 54.59 | 60.76 | 67.05 | 75.15 | 85.44 |
| 853.0 | 6.18 | 7.57 | 9.47 | 10.6 | 13.37 | 15 | 17.62 | 19.71 | 22.63 | 24.73 | 29.2 | 32.68 | 35.77 | 38.75 | 42.62 | 47.54 | 54.05 | 60.31 | 66.51 | 74.6 | 84.7 |
| 854.0 | 6.13 | 7.52 | 9.38 | 10.53 | 13.21 | 14.98 | 17.4 | 19.56 | 22.61 | 24.51 | 29.04 | 32.47 | 35.53 | 38.67 | 42.29 | 47.13 | 53.38 | 60.06 | 66.07 | 74.07 | 84.1 |
| 855.0 | 6.06 | 7.3 | 9.42 | 10.51 | 13 | 14.96 | 17.14 | 19.28 | 22.49 | 24.25 | 28.72 | 32.38 | 35.13 | 38.38 | 41.94 | 46.75 | 53.12 | 59.49 | 65.43 | 73.35 | 83.21 |
| 856.0 | 5.76 | 7.06 | 9.18 | 10.32 | 12.71 | 14.52 | 16.88 | 19.07 | 22.12 | 23.84 | 28.3 | 32.03 | 34.64 | 38.11 | 41.38 | 45.99 | 52.41 | 58.9 | 64.82 | 72.66 | 82.37 |
| 857.0 | 5.72 | 6.9 | 9.1 | 10.32 | 12.57 | 14.33 | 16.72 | 18.86 | 22.08 | 23.8 | 27.97 | 31.74 | 34.2 | 37.73 | 41.08 | 45.64 | 51.75 | 58.27 | 64.21 | 72.1 | 81.47 |
| 858.0 | 5.69 | 6.82 | 9.01 | 10.31 | 12.32 | 14.15 | 16.53 | 18.61 | 21.83 | 23.5 | 27.81 | 31.56 | 33.86 | 37.45 | 40.8 | 45.27 | 51.17 | 57.5 | 63.67 | 71.35 | 80.62 |
| 859.0 | 5.78 | 6.8 | 9.1 | 10.14 | 12.25 | 14.04 | 16.44 | 18.56 | 21.69 | 23.35 | 27.59 | 31.37 | 33.55 | 37.06 | 40.41 | 44.75 | 50.86 | 56.96 | 63.04 | 70.59 | 79.83 |
| 860.0 | 5.83 | 6.89 | 9.1 | 10.05 | 12.24 | 13.97 | 16.26 | 18.43 | 21.46 | 23.44 | 27.25 | 31.15 | 33.22 | 36.65 | 40.02 | 44.44 | 50.51 | 56.47 | 62.54 | 69.67 | 78.93 |
| 861.0 | 6.11 | 6.92 | 9.14 | 10.05 | 12.2 | 13.93 | 16.13 | 18.37 | 21.24 | 23.35 | 27.09 | 30.96 | 32.97 | 36.35 | 39.88 | 43.91 | 50.04 | 56.1 | 61.93 | 69.21 | 78.3 |
| 862.0 | 6.29 | 6.92 | 9.13 | 10.05 | 12.13 | 13.77 | 15.99 | 18.28 | 21.17 | 23.26 | 26.85 | 30.7 | 32.56 | 36.22 | 39.37 | 43.64 | 49.51 | 55.62 | 61.34 | 68.46 | 77.28 |
| 863.0 | 6.19 | 6.94 | 9.06 | 9.83 | 12.16 | 13.73 | 15.87 | 18.14 | 21.06 | 23.04 | 26.45 | 30.35 | 32.21 | 36.03 | 38.99 | 43.35 | 48.77 | 55.17 | 60.69 | 67.75 | 76.49 |
| 864.0 | 6.12 | 6.92 | 8.97 | 9.82 | 12.1 | 13.6 | 15.81 | 18.09 | 21.05 | 23.06 | 26.26 | 30.03 | 31.93 | 35.54 | 38.68 | 42.72 | 48.25 | 54.56 | 60.18 | 66.95 | 75.55 |
| 865.0 | 6.02 | 6.88 | 8.92 | 9.81 | 12.04 | 13.47 | 15.74 | 17.87 | 20.87 | 22.87 | 25.9 | 29.68 | 31.81 | 35.32 | 38.18 | 42.19 | 47.78 | 54.08 | 59.59 | 66.27 | 74.59 |
| 866.0 | 6.13 | 6.83 | 8.91 | 9.79 | 11.86 | 13.39 | 15.63 | 17.83 | 20.62 | 22.88 | 25.62 | 29.4 | 31.53 | 34.98 | 37.81 | 41.92 | 47.38 | 53.58 | 58.81 | 65.5 | 74 |
| 867.0 | 6.19 | 6.77 | 8.69 | 9.78 | 11.53 | 13.16 | 15.52 | 17.51 | 20.29 | 22.52 | 25.32 | 29.01 | 31.25 | 34.58 | 37.4 | 41.38 | 46.9 | 52.82 | 58.02 | 64.6 | 73.26 |
| 868.0 | 5.99 | 6.56 | 8.46 | 9.57 | 11.32 | 12.83 | 15.21 | 17.15 | 19.91 | 22.17 | 24.99 | 28.5 | 30.81 | 34.15 | 37.05 | 40.88 | 46.14 | 52.16 | 57.1 | 63.87 | 72.06 |
| 869.0 | 5.97 | 6.58 | 8.41 | 9.54 | 11.29 | 12.78 | 15.19 | 17.05 | 19.62 | 21.98 | 24.73 | 28.38 | 30.38 | 33.85 | 36.73 | 40.33 | 45.67 | 51.55 | 56.53 | 63.19 | 71.22 |
| 870.0 | 6.03 | 6.63 | 8.55 | 9.44 | 11.2 | 12.82 | 15.01 | 16.94 | 19.52 | 21.73 | 24.61 | 28 | 30.14 | 33.41 | 36.51 | 39.87 | 45.36 | 50.98 | 55.9 | 62.47 | 70.38 |
| 871.0 | 5.95 | 6.56 | 8.5 | 9.21 | 11 | 12.73 | 14.81 | 16.72 | 19.15 | 21.57 | 24.31 | 27.6 | 29.86 | 32.83 | 36.04 | 39.49 | 44.81 | 50.58 | 55.23 | 61.73 | 69.54 |
| 872.0 | 5.91 | 6.38 | 8.4 | 8.92 | 10.99 | 12.44 | 14.51 | 16.6 | 18.89 | 21.13 | 23.83 | 27.24 | 29.52 | 32.53 | 35.67 | 38.83 | 44.17 | 49.78 | 54.53 | 60.93 | 68.41 |
| 873.0 | 5.75 | 6.33 | 8.26 | 8.71 | 10.85 | 12.2 | 14.41 | 16.36 | 18.5 | 20.93 | 23.6 | 26.96 | 29.1 | 32.19 | 35.32 | 38.52 | 43.56 | 49.16 | 54.02 | 60.14 | 67.88 |
| 874.0 | 5.89 | 6.31 | 8.28 | 8.76 | 10.85 | 12.36 | 14.44 | 16.46 | 18.53 | 20.81 | 23.43 | 26.88 | 29.08 | 31.95 | 35.18 | 38.19 | 43.23 | 48.74 | 53.54 | 59.64 | 67.38 |
| 875.0 | 5.62 | 6.14 | 8.09 | 8.57 | 10.58 | 12.07 | 14.28 | 16.19 | 18.14 | 20.47 | 23.19 | 26.59 | 28.75 | 31.59 | 34.55 | 37.74 | 42.93 | 48.02 | 52.92 | 58.93 | 66.51 |
| 876.0 | 5.5 | 6.05 | 7.9 | 8.43 | 10.52 | 11.97 | 14.16 | 15.99 | 17.96 | 20.29 | 22.92 | 26.31 | 28.65 | 31.31 | 34.2 | 37.3 | 42.34 | 47.49 | 52.45 | 58.44 | 66.13 |
| 877.0 | 5.59 | 6.2 | 7.96 | 8.4 | 10.5 | 12.03 | 14.15 | 16.08 | 17.92 | 20.12 | 22.81 | 26.14 | 28.67 | 31.03 | 34.07 | 37.11 | 42.08 | 47.08 | 52.01 | 57.9 | 65.81 |
| 878.0 | 5.53 | 6.23 | 7.9 | 8.22 | 10.46 | 11.99 | 14.19 | 15.93 | 17.65 | 19.77 | 22.73 | 25.84 | 28.47 | 31.03 | 33.87 | 36.82 | 42.03 | 46.86 | 51.75 | 57.51 | 65.67 |
| 879.0 | 5.58 | 6.3 | 7.84 | 8.16 | 10.48 | 11.87 | 14.18 | 16 | 17.63 | 19.72 | 22.85 | 25.72 | 28.41 | 30.94 | 33.64 | 36.65 | 41.93 | 46.73 | 51.62 | 57.32 | 65.47 |
| 880.0 | 5.39 | 6.4 | 7.73 | 8.22 | 10.42 | 12.03 | 14.04 | 15.98 | 17.61 | 19.62 | 22.73 | 25.64 | 28.3 | 30.78 | 33.77 | 36.51 | 41.82 | 46.73 | 51.47 | 57.22 | 65.21 |
| 881.0 | 5.14 | 6.27 | 7.62 | 8.07 | 10.22 | 11.85 | 13.85 | 15.97 | 17.53 | 19.37 | 22.59 | 25.43 | 28.28 | 30.67 | 33.55 | 36.35 | 41.53 | 46.46 | 51.07 | 57.02 | 65.07 |
| 882.0 | 4.84 | 6.21 | 7.44 | 7.88 | 10.08 | 11.77 | 13.8 | 15.81 | 17.6 | 19.28 | 22.39 | 25.31 | 28.15 | 30.38 | 33.31 | 36.22 | 41.41 | 46.33 | 50.89 | 56.79 | 64.77 |
| 883.0 | 4.7 | 6.11 | 7.35 | 7.71 | 10.07 | 11.71 | 13.72 | 15.66 | 17.51 | 19.29 | 22.25 | 25.22 | 28.1 | 30.33 | 33.32 | 36.09 | 41.44 | 46.25 | 51.01 | 56.69 | 64.75 |
| 884.0 | 4.66 | 6.11 | 7.52 | 7.72 | 9.92 | 11.65 | 13.71 | 15.61 | 17.42 | 19.16 | 22.45 | 25.24 | 28.05 | 30.42 | 33.29 | 36.07 | 41.5 | 46.21 | 50.86 | 56.72 | 64.69 |
| 885.0 | 4.74 | 6.08 | 7.6 | 7.64 | 9.76 | 11.84 | 13.67 | 15.6 | 17.35 | 19.1 | 22.47 | 25.36 | 27.96 | 30.53 | 33.08 | 36.22 | 41.6 | 46.28 | 50.99 | 56.73 | 64.89 |
| 886.0 | 4.91 | 6.22 | 7.44 | 7.87 | 9.81 | 12 | 13.78 | 15.76 | 17.42 | 19.16 | 22.54 | 25.55 | 27.84 | 30.65 | 33.26 | 36.4 | 41.7 | 46.58 | 51.31 | 56.94 | 65.13 |
| 887.0 | 5.01 | 6.23 | 7.34 | 7.79 | 9.79 | 11.9 | 13.72 | 15.76 | 17.47 | 19.06 | 22.55 | 25.52 | 27.91 | 30.69 | 33.39 | 36.43 | 41.83 | 46.76 | 51.47 | 57.15 | 65.38 |
| 888.0 | 5.08 | 6.43 | 7.53 | 7.76 | 10.03 | 12.02 | 13.87 | 15.93 | 17.65 | 19.29 | 22.82 | 25.83 | 28.08 | 31 | 33.68 | 36.65 | 42.02 | 47 | 51.89 | 57.4 | 65.5 |
| 889.0 | 5.01 | 6.53 | 7.54 | 7.84 | 10.19 | 12.14 | 14.08 | 16.01 | 17.74 | 19.3 | 22.83 | 25.96 | 28.07 | 31.08 | 33.81 | 36.77 | 42.19 | 47.42 | 52.34 | 57.43 | 65.93 |
| 890.0 | 5.02 | 6.35 | 7.47 | 7.81 | 10.24 | 12.13 | 13.97 | 15.96 | 17.86 | 19.46 | 22.83 | 25.91 | 28.36 | 31.12 | 33.88 | 36.87 | 42.42 | 47.71 | 52.37 | 57.67 | 65.99 |
| 891.0 | 5.04 | 6.35 | 7.44 | 8 | 10.22 | 12.09 | 14.06 | 16.13 | 17.98 | 19.57 | 22.96 | 26.02 | 28.43 | 31.36 | 33.95 | 37.14 | 42.61 | 48.01 | 52.58 | 58.11 | 66.48 |
| 892.0 | 5.06 | 6.37 | 7.28 | 8.14 | 10.27 | 12.15 | 14.06 | 16.29 | 17.97 | 19.59 | 23 | 26.15 | 28.45 | 31.64 | 34.14 | 37.24 | 42.58 | 48.09 | 52.93 | 58.26 | 66.75 |
| 893.0 | 5.15 | 6.41 | 7.27 | 8.3 | 10.33 | 12.37 | 14.16 | 16.34 | 18.12 | 19.78 | 23.22 | 26.29 | 28.5 | 31.75 | 34.32 | 37.52 | 42.81 | 48.46 | 53.13 | 58.58 | 67.25 |
| 894.0 | 5.27 | 6.51 | 7.34 | 8.56 | 10.29 | 12.36 | 14.13 | 16.36 | 18.35 | 19.75 | 23.36 | 26.47 | 28.7 | 31.96 | 34.44 | 37.75 | 42.99 | 48.66 | 53.56 | 58.94 | 67.35 |
| 895.0 | 5.29 | 6.52 | 7.39 | 8.64 | 10.39 | 12.35 | 14.12 | 16.4 | 18.22 | 19.79 | 23.55 | 26.63 | 28.85 | 32.1 | 34.51 | 37.9 | 43.28 | 48.87 | 53.88 | 59.2 | 67.44 |
| 896.0 | 5.47 | 6.74 | 7.49 | 8.83 | 10.56 | 12.48 | 14.34 | 16.61 | 18.42 | 19.93 | 23.65 | 26.93 | 29.16 | 32.37 | 34.87 | 38.19 | 43.37 | 49.27 | 54.08 | 59.47 | 67.9 |
| 897.0 | 5.48 | 6.88 | 7.62 | 9.05 | 10.61 | 12.48 | 14.53 | 16.81 | 18.32 | 20.04 | 24.01 | 27.18 | 29.21 | 32.53 | 35.1 | 38.45 | 43.7 | 49.6 | 54.39 | 59.67 | 68.09 |
| 898.0 | 5.37 | 6.69 | 7.47 | 8.98 | 10.63 | 12.43 | 14.49 | 16.64 | 18.42 | 20.01 | 24.09 | 27.18 | 29 | 32.5 | 35.21 | 38.66 | 43.61 | 49.59 | 54.71 | 59.84 | 68.1 |
| 899.0 | 5.46 | 6.74 | 7.51 | 9.19 | 10.63 | 12.53 | 14.44 | 16.8 | 18.68 | 20.25 | 24.17 | 27.53 | 29.24 | 32.62 | 35.38 | 38.8 | 43.65 | 49.78 | 54.95 | 60.09 | 67.96 |
| 900.0 | 5.32 | 6.64 | 7.55 | 9.08 | 10.71 | 12.64 | 14.38 | 16.85 | 18.62 | 20.12 | 23.87 | 27.57 | 29.2 | 32.6 | 35.33 | 38.85 | 43.57 | 49.66 | 54.96 | 59.98 | 67.92 |
| 901.0 | 5.31 | 6.5 | 7.37 | 9.1 | 10.61 | 12.39 | 14.3 | 16.62 | 18.53 | 20.06 | 23.98 | 27.45 | 29.09 | 32.56 | 35.04 | 38.81 | 43.44 | 49.49 | 54.89 | 59.79 | 67.76 |
| 902.0 | 5.61 | 6.7 | 7.52 | 9.31 | 10.8 | 12.61 | 14.55 | 16.63 | 18.75 | 20.28 | 24.21 | 27.72 | 29.18 | 32.76 | 35.14 | 38.98 | 43.58 | 49.85 | 55.03 | 59.92 | 67.87 |
| 903.0 | 5.61 | 6.69 | 7.7 | 9.5 | 10.83 | 12.61 | 14.54 | 16.58 | 18.6 | 20.42 | 24.16 | 27.77 | 29.12 | 32.94 | 35.19 | 38.95 | 43.64 | 49.91 | 55.12 | 60.08 | 67.92 |
| 904.0 | 5.65 | 6.68 | 7.78 | 9.61 | 10.98 | 12.78 | 14.65 | 16.72 | 18.69 | 20.45 | 24.33 | 27.86 | 29.19 | 33.03 | 35.06 | 38.91 | 43.57 | 49.79 | 55.09 | 60.03 | 67.97 |
| 905.0 | 5.68 | 6.66 | 7.59 | 9.55 | 11.02 | 12.8 | 14.6 | 16.74 | 18.56 | 20.53 | 24.15 | 27.78 | 29.22 | 32.76 | 34.97 | 38.67 | 43.38 | 49.54 | 55.04 | 59.7 | 67.83 |
| 906.0 | 5.57 | 6.66 | 7.52 | 9.56 | 11.09 | 12.71 | 14.66 | 16.68 | 18.61 | 20.49 | 24.05 | 27.78 | 29.31 | 32.73 | 34.91 | 38.5 | 43.35 | 49.41 | 54.73 | 59.47 | 67.54 |
| 907.0 | 5.52 | 6.6 | 7.77 | 9.43 | 11.12 | 12.71 | 14.73 | 16.62 | 18.7 | 20.56 | 24.03 | 27.75 | 29.4 | 32.71 | 34.86 | 38.4 | 43.33 | 49.2 | 54.42 | 59.17 | 67.28 |
| 908.0 | 5.23 | 6.57 | 7.62 | 9.45 | 11.02 | 12.52 | 14.49 | 16.47 | 18.47 | 20.47 | 23.85 | 27.49 | 29.25 | 32.44 | 34.57 | 38.03 | 43.15 | 48.84 | 54.03 | 58.9 | 66.8 |
| 909.0 | 5.15 | 6.47 | 7.59 | 9.53 | 11 | 12.5 | 14.42 | 16.41 | 18.43 | 20.36 | 23.76 | 27.41 | 29.14 | 32.24 | 34.26 | 37.82 | 42.77 | 48.66 | 53.76 | 58.8 | 66.47 |
| 910.0 | 5.34 | 6.5 | 7.63 | 9.61 | 10.98 | 12.44 | 14.36 | 16.3 | 18.38 | 20.43 | 23.77 | 27.31 | 29.1 | 32.08 | 33.94 | 37.56 | 42.53 | 48.27 | 53.29 | 58.5 | 66.12 |
| 911.0 | 5.44 | 6.76 | 7.77 | 9.68 | 10.83 | 12.49 | 14.39 | 16.32 | 18.33 | 20.39 | 23.7 | 27.35 | 29.04 | 32.01 | 33.87 | 37.54 | 42.2 | 47.95 | 53.13 | 58.19 | 65.94 |
| 912.0 | 5.39 | 6.71 | 7.73 | 9.65 | 10.97 | 12.33 | 14.38 | 16.15 | 18.22 | 20.36 | 23.53 | 27.22 | 28.92 | 31.71 | 33.72 | 37.24 | 41.83 | 47.62 | 52.84 | 57.55 | 65.37 |
| 913.0 | 5.36 | 6.75 | 7.8 | 9.51 | 10.88 | 12.15 | 14.41 | 16.15 | 18.28 | 20.24 | 23.48 | 27.07 | 28.77 | 31.45 | 33.67 | 37.03 | 41.67 | 47.19 | 52.46 | 57.31 | 64.86 |
| 914.0 | 5.3 | 6.73 | 7.67 | 9.57 | 10.81 | 12.18 | 14.46 | 15.97 | 18.17 | 20.18 | 23.39 | 27.01 | 28.71 | 31.19 | 33.39 | 36.72 | 41.41 | 46.78 | 52.02 | 56.87 | 64.26 |
| 915.0 | 5.24 | 6.7 | 7.6 | 9.46 | 10.66 | 12.15 | 14.36 | 15.78 | 17.94 | 20.01 | 23.14 | 26.8 | 28.41 | 30.94 | 33.06 | 36.27 | 40.93 | 46.45 | 51.52 | 56.34 | 63.69 |
| 916.0 | 4.93 | 6.52 | 7.38 | 9.18 | 10.54 | 11.98 | 14.18 | 15.55 | 17.73 | 19.83 | 22.81 | 26.39 | 28.03 | 30.6 | 32.52 | 36 | 40.4 | 45.84 | 50.95 | 55.47 | 62.9 |
| 917.0 | 4.89 | 6.49 | 7.39 | 9.1 | 10.48 | 11.81 | 14.01 | 15.45 | 17.48 | 19.65 | 22.79 | 25.97 | 27.74 | 30.25 | 32.25 | 35.59 | 39.83 | 45.23 | 50.34 | 54.87 | 62.13 |
| 918.0 | 4.87 | 6.39 | 7.29 | 8.92 | 10.42 | 11.76 | 13.87 | 15.27 | 17.33 | 19.54 | 22.4 | 25.45 | 27.3 | 29.67 | 31.94 | 35.08 | 39.38 | 44.49 | 49.48 | 54.3 | 61.4 |
| 919.0 | 4.84 | 6.52 | 7.35 | 8.91 | 10.23 | 11.72 | 13.65 | 15.11 | 17.07 | 19.47 | 22.11 | 25.27 | 27.16 | 29.49 | 31.56 | 34.62 | 38.93 | 44.19 | 48.67 | 53.66 | 60.53 |
| 920.0 | 4.81 | 6.47 | 7.24 | 8.62 | 10.04 | 11.45 | 13.43 | 14.9 | 16.71 | 19.14 | 21.84 | 24.84 | 26.71 | 28.98 | 31.09 | 34.07 | 38.37 | 43.45 | 47.88 | 52.79 | 59.76 |
| 921.0 | 4.99 | 6.32 | 7.18 | 8.64 | 9.87 | 11.13 | 13.29 | 14.5 | 16.54 | 19.02 | 21.71 | 24.34 | 26.34 | 28.49 | 30.78 | 33.65 | 37.88 | 43.01 | 47.2 | 52.16 | 59.01 |
| 922.0 | 4.96 | 6.22 | 7.1 | 8.47 | 9.83 | 11.05 | 13.25 | 14.37 | 16.23 | 18.83 | 21.24 | 24.1 | 26.05 | 28.17 | 30.34 | 33.18 | 37.38 | 42.46 | 46.37 | 51.35 | 58.12 |
| 923.0 | 4.77 | 5.91 | 6.89 | 8.29 | 9.66 | 10.71 | 12.98 | 14.17 | 15.87 | 18.57 | 20.82 | 23.68 | 25.51 | 27.59 | 29.91 | 32.46 | 36.57 | 41.55 | 45.37 | 50.5 | 56.96 |
| 924.0 | 4.74 | 5.92 | 6.6 | 7.93 | 9.5 | 10.45 | 12.76 | 13.84 | 15.48 | 18.21 | 20.62 | 23.31 | 25.05 | 26.92 | 29.49 | 31.88 | 35.65 | 40.51 | 44.42 | 49.38 | 55.71 |
| 925.0 | 4.69 | 5.85 | 6.54 | 7.69 | 9.13 | 10.2 | 12.48 | 13.45 | 15.13 | 17.75 | 20.08 | 22.8 | 24.53 | 26.22 | 28.94 | 31.24 | 34.84 | 39.72 | 43.4 | 48.35 | 54.4 |
| 926.0 | 4.59 | 5.63 | 6.27 | 7.41 | 8.87 | 9.9 | 12.17 | 13.05 | 14.75 | 17.28 | 19.52 | 22.29 | 23.75 | 25.56 | 28.1 | 30.55 | 33.97 | 38.83 | 42.31 | 47.11 | 53.11 |
| 927.0 | 4.5 | 5.51 | 6.06 | 7.14 | 8.61 | 9.63 | 11.67 | 12.61 | 14.25 | 16.82 | 19.03 | 21.67 | 22.99 | 24.98 | 27.34 | 29.82 | 32.95 | 37.58 | 41.02 | 45.95 | 51.64 |
| 928.0 | 4.33 | 5.43 | 5.6 | 6.82 | 8.22 | 9.23 | 11.12 | 12.22 | 13.61 | 16.2 | 18.47 | 20.81 | 22.11 | 23.98 | 26.36 | 28.78 | 31.93 | 36.12 | 39.67 | 44.34 | 49.79 |
| 929.0 | 4.23 | 5.31 | 5.57 | 6.44 | 8.01 | 9.01 | 10.85 | 11.69 | 13.14 | 15.66 | 17.86 | 20.2 | 21.24 | 23.13 | 25.34 | 27.9 | 30.72 | 34.77 | 38.28 | 42.66 | 48 |
| 930.0 | 4.13 | 5.01 | 5.33 | 6.05 | 7.71 | 8.56 | 10.36 | 11.24 | 12.54 | 15.05 | 17.06 | 19.26 | 20.25 | 22.09 | 24.22 | 26.9 | 29.6 | 33.44 | 36.73 | 40.85 | 46.05 |
| 931.0 | 3.87 | 4.58 | 5.08 | 5.57 | 7.09 | 8.16 | 9.77 | 10.76 | 11.82 | 14.25 | 16.14 | 18.36 | 19.33 | 21.07 | 23.03 | 25.55 | 28.18 | 31.77 | 34.89 | 38.99 | 43.94 |
| 932.0 | 3.48 | 4.02 | 4.57 | 5.13 | 6.72 | 7.5 | 9.2 | 10.11 | 10.86 | 13.31 | 15.28 | 17.36 | 18.25 | 19.76 | 21.78 | 24 | 26.73 | 30.1 | 33.05 | 36.91 | 41.54 |
| 933.0 | 3.24 | 3.73 | 4.21 | 4.77 | 6.13 | 7.25 | 8.66 | 9.57 | 10.05 | 12.49 | 14.44 | 16.59 | 17.2 | 18.65 | 20.53 | 22.79 | 25.36 | 28.52 | 31.33 | 35.12 | 39.43 |
| 934.0 | 3.28 | 3.63 | 4.16 | 4.73 | 5.93 | 7.12 | 8.31 | 9.02 | 9.5 | 11.9 | 13.8 | 15.86 | 16.36 | 17.81 | 19.46 | 21.69 | 24.11 | 27.22 | 29.67 | 33.31 | 37.63 |
| 935.0 | 3.16 | 3.46 | 3.9 | 4.46 | 5.64 | 6.62 | 7.89 | 8.59 | 8.87 | 11.22 | 12.88 | 15.05 | 15.34 | 16.92 | 18.41 | 20.53 | 22.68 | 25.62 | 27.98 | 31.42 | 35.61 |
| 936.0 | 2.97 | 3.19 | 3.75 | 4.21 | 5.39 | 6.21 | 7.42 | 8.08 | 8.25 | 10.61 | 12.21 | 14.22 | 14.39 | 15.89 | 17.45 | 19.32 | 21.47 | 23.99 | 26.3 | 29.54 | 33.64 |
| 937.0 | 2.95 | 3.03 | 3.6 | 4.09 | 4.98 | 5.82 | 7.09 | 7.64 | 7.78 | 10.06 | 11.62 | 13.35 | 13.57 | 14.87 | 16.55 | 18.11 | 20.13 | 22.63 | 24.7 | 28 | 31.81 |
| 938.0 | 2.82 | 2.71 | 3.26 | 3.66 | 4.65 | 5.53 | 6.52 | 7.06 | 7.23 | 9.41 | 10.79 | 12.46 | 12.69 | 13.92 | 15.51 | 16.86 | 18.99 | 21.15 | 23.26 | 26.19 | 29.86 |
| 939.0 | 2.61 | 2.51 | 3.13 | 3.45 | 4.24 | 5.14 | 6.07 | 6.55 | 6.8 | 8.65 | 10.07 | 11.76 | 11.98 | 13.19 | 14.32 | 15.77 | 17.65 | 19.9 | 21.85 | 24.53 | 27.95 |
| 940.0 | 2.55 | 2.38 | 2.95 | 3.26 | 4.09 | 4.84 | 5.8 | 6.15 | 6.38 | 8.17 | 9.52 | 11.16 | 11.3 | 12.47 | 13.45 | 14.96 | 16.78 | 18.67 | 20.63 | 23.08 | 26.48 |
| 941.0 | 2.32 | 2.09 | 2.7 | 3.14 | 3.83 | 4.56 | 5.45 | 5.71 | 5.96 | 7.63 | 8.96 | 10.45 | 10.57 | 11.72 | 12.5 | 14.08 | 15.65 | 17.54 | 19.5 | 21.57 | 24.82 |
| 942.0 | 1.91 | 1.95 | 2.41 | 2.82 | 3.56 | 4.37 | 5.12 | 5.31 | 5.42 | 7.13 | 8.31 | 9.79 | 9.8 | 11 | 11.47 | 12.96 | 14.67 | 16.43 | 18.19 | 20.08 | 23.11 |
| 943.0 | 1.79 | 1.92 | 2.27 | 2.55 | 3.34 | 4.19 | 4.75 | 4.96 | 5.12 | 6.73 | 7.95 | 9.2 | 9.28 | 10.28 | 10.83 | 12.26 | 13.91 | 15.37 | 17.18 | 18.98 | 21.84 |
| 944.0 | 1.66 | 1.83 | 2.06 | 2.2 | 3.02 | 3.92 | 4.4 | 4.62 | 4.57 | 6.29 | 7.59 | 8.59 | 8.62 | 9.61 | 10.04 | 11.54 | 13.1 | 14.52 | 16.24 | 17.76 | 20.57 |
| 945.0 | 1.64 | 1.53 | 1.78 | 2.09 | 2.86 | 3.77 | 4.1 | 4.39 | 4.35 | 5.77 | 7.09 | 7.95 | 8.02 | 9.1 | 9.21 | 10.89 | 12.42 | 13.91 | 15.37 | 16.78 | 19.48 |
| 946.0 | 1.59 | 1.45 | 1.48 | 1.93 | 2.79 | 3.51 | 3.85 | 4.17 | 4.1 | 5.62 | 6.88 | 7.6 | 7.6 | 8.72 | 8.68 | 10.38 | 11.95 | 13.35 | 14.52 | 15.88 | 18.49 |
| 947.0 | 1.38 | 1.33 | 1.48 | 1.95 | 2.63 | 3.29 | 3.66 | 3.98 | 4.03 | 5.38 | 6.68 | 7.34 | 7.27 | 8.46 | 8.44 | 9.99 | 11.57 | 12.86 | 14.02 | 15.42 | 17.62 |
| 948.0 | 1.41 | 1.21 | 1.49 | 1.86 | 2.54 | 3.13 | 3.69 | 3.88 | 3.86 | 5.21 | 6.46 | 7.09 | 7.15 | 8.12 | 8.33 | 9.72 | 11.23 | 12.69 | 13.88 | 15.03 | 17.12 |
| 949.0 | 1.47 | 1.08 | 1.55 | 1.93 | 2.63 | 3.16 | 3.75 | 3.83 | 3.84 | 5.17 | 6.37 | 7.06 | 7.11 | 8.15 | 8.25 | 9.61 | 10.98 | 12.57 | 13.64 | 15.01 | 17.1 |
| 950.0 | 1.45 | 1.08 | 1.5 | 1.93 | 2.63 | 3.28 | 3.82 | 3.92 | 4 | 5.13 | 6.4 | 7.06 | 7.21 | 8.23 | 8.31 | 9.67 | 10.93 | 12.55 | 13.6 | 15.04 | 17.21 |
| 951.0 | 1.33 | 0.94 | 1.48 | 1.94 | 2.55 | 3.32 | 3.78 | 3.82 | 3.98 | 5.23 | 6.36 | 7.23 | 7.27 | 8.24 | 8.47 | 9.7 | 10.9 | 12.53 | 13.65 | 15.13 | 17.39 |
| 952.0 | 1.32 | 1.03 | 1.57 | 2.08 | 2.79 | 3.44 | 3.93 | 3.93 | 4.2 | 5.34 | 6.64 | 7.45 | 7.44 | 8.45 | 8.86 | 10.1 | 11.2 | 12.91 | 14.13 | 15.36 | 17.83 |
| 953.0 | 1.46 | 1.13 | 1.73 | 2.24 | 2.85 | 3.67 | 4.12 | 4.03 | 4.56 | 5.57 | 6.77 | 7.59 | 7.48 | 8.76 | 9.01 | 10.49 | 11.5 | 13.33 | 14.41 | 15.8 | 18.33 |
| 954.0 | 1.45 | 1.18 | 1.76 | 2.21 | 2.92 | 3.55 | 4.16 | 4.06 | 4.65 | 5.71 | 6.88 | 7.62 | 7.63 | 8.95 | 9.25 | 10.6 | 11.72 | 13.55 | 14.66 | 16.07 | 18.7 |
| 955.0 | 1.27 | 1.12 | 1.59 | 2.01 | 2.78 | 3.42 | 4.1 | 4.01 | 4.59 | 5.8 | 6.95 | 7.65 | 7.85 | 9.1 | 9.39 | 10.64 | 11.86 | 13.82 | 14.99 | 16.42 | 18.89 |
| 956.0 | 1.32 | 1.28 | 1.82 | 2.1 | 2.94 | 3.55 | 4.18 | 4.13 | 4.82 | 6.01 | 7.31 | 7.91 | 8.19 | 9.32 | 9.74 | 10.97 | 12.24 | 14.31 | 15.56 | 16.98 | 19.58 |
| 957.0 | 1.36 | 1.42 | 1.79 | 2.12 | 2.96 | 3.64 | 4.28 | 4.42 | 4.99 | 6.04 | 7.41 | 8.09 | 8.52 | 9.62 | 10.01 | 11.45 | 12.64 | 14.96 | 16.07 | 17.67 | 20.16 |
| 958.0 | 1.39 | 1.47 | 1.83 | 2.2 | 3.09 | 3.78 | 4.23 | 4.64 | 5.23 | 6.14 | 7.49 | 8.47 | 8.78 | 10.12 | 10.34 | 11.81 | 13.02 | 15.45 | 16.56 | 18.27 | 20.74 |
| 959.0 | 1.33 | 1.6 | 1.94 | 2.33 | 3.16 | 3.86 | 4.44 | 4.64 | 5.48 | 6.44 | 7.64 | 8.8 | 9.03 | 10.45 | 10.68 | 12.28 | 13.48 | 15.89 | 17.15 | 18.88 | 21.36 |
| 960.0 | 1.41 | 1.91 | 1.99 | 2.51 | 3.38 | 3.94 | 4.7 | 4.84 | 5.72 | 6.76 | 8.01 | 9.08 | 9.25 | 10.78 | 11.31 | 12.8 | 14.08 | 16.45 | 17.85 | 19.4 | 22.06 |
| 961.0 | 1.42 | 1.89 | 1.94 | 2.58 | 3.4 | 4.09 | 4.73 | 4.99 | 5.91 | 6.86 | 8.22 | 9.23 | 9.47 | 10.97 | 11.64 | 12.97 | 14.3 | 16.84 | 18.14 | 19.82 | 22.5 |
| 962.0 | 1.5 | 2.02 | 2.11 | 2.57 | 3.55 | 4.16 | 4.82 | 5.19 | 6.06 | 7.06 | 8.43 | 9.45 | 9.76 | 11.2 | 12 | 13.27 | 14.81 | 17.22 | 18.43 | 20.36 | 23.02 |
| 963.0 | 1.6 | 2.19 | 2.14 | 2.56 | 3.61 | 4.22 | 4.91 | 5.58 | 6.28 | 7.1 | 8.53 | 9.82 | 10.11 | 11.34 | 12.39 | 13.69 | 15.06 | 17.52 | 18.72 | 20.87 | 23.49 |
| 964.0 | 1.56 | 2.06 | 2.14 | 2.68 | 3.57 | 4.19 | 4.86 | 5.61 | 6.27 | 7.1 | 8.53 | 9.85 | 10.19 | 11.54 | 12.42 | 13.88 | 15.16 | 17.72 | 19 | 21.28 | 23.77 |
| 965.0 | 1.8 | 2.31 | 2.41 | 3 | 3.75 | 4.4 | 5.03 | 5.71 | 6.67 | 7.24 | 8.77 | 10.16 | 10.64 | 11.92 | 12.78 | 14.18 | 15.71 | 18.02 | 19.47 | 21.8 | 24.49 |
| 966.0 | 1.66 | 2.33 | 2.63 | 3.13 | 3.88 | 4.54 | 5.17 | 5.83 | 6.88 | 7.5 | 8.95 | 10.38 | 10.92 | 12.07 | 13.03 | 14.38 | 15.8 | 18.27 | 19.71 | 22.11 | 24.96 |
| 967.0 | 1.57 | 2.45 | 2.88 | 3.43 | 4 | 4.67 | 5.35 | 5.97 | 6.89 | 7.48 | 9.13 | 10.64 | 11.34 | 12.35 | 13.37 | 14.54 | 16.04 | 18.4 | 20.08 | 22.48 | 25.34 |
| 968.0 | 1.82 | 2.59 | 2.82 | 3.47 | 4.17 | 4.72 | 5.41 | 6.05 | 6.88 | 7.56 | 9.25 | 10.65 | 11.65 | 12.51 | 13.47 | 14.71 | 16.22 | 18.49 | 20.23 | 22.68 | 25.47 |
| 969.0 | 1.8 | 2.66 | 2.89 | 3.61 | 4.27 | 4.87 | 5.4 | 6.26 | 7.05 | 7.66 | 9.24 | 10.77 | 11.82 | 12.58 | 13.5 | 14.78 | 16.36 | 18.59 | 20.29 | 22.78 | 25.59 |
| 970.0 | 1.72 | 2.7 | 2.88 | 3.53 | 4.1 | 4.72 | 5.25 | 6.17 | 7.03 | 7.59 | 9.04 | 10.86 | 11.73 | 12.6 | 13.49 | 14.73 | 16.47 | 18.63 | 20.38 | 22.92 | 25.6 |
| 971.0 | 1.75 | 2.72 | 2.86 | 3.64 | 4.03 | 4.55 | 5.32 | 6.26 | 7.03 | 7.68 | 9.07 | 10.87 | 11.71 | 12.67 | 13.53 | 14.67 | 16.71 | 18.88 | 20.53 | 23 | 25.52 |
| 972.0 | 1.8 | 2.88 | 2.84 | 3.6 | 4.05 | 4.52 | 5.34 | 6.26 | 7.02 | 7.61 | 9.04 | 10.75 | 11.68 | 12.7 | 13.53 | 14.66 | 16.81 | 18.96 | 20.56 | 23.03 | 25.6 |
| 973.0 | 1.84 | 3.06 | 2.84 | 3.8 | 4.23 | 4.56 | 5.36 | 6.43 | 7.27 | 7.84 | 9.16 | 10.89 | 11.82 | 12.71 | 13.56 | 14.64 | 16.88 | 18.88 | 20.62 | 23.3 | 25.77 |
| 974.0 | 1.8 | 3.21 | 2.87 | 3.78 | 4.31 | 4.64 | 5.31 | 6.54 | 7.3 | 7.93 | 9.33 | 10.98 | 12.02 | 12.79 | 13.61 | 14.85 | 16.85 | 18.87 | 20.8 | 23.46 | 25.78 |
| 975.0 | 1.86 | 3.37 | 2.91 | 3.79 | 4.39 | 4.74 | 5.32 | 6.58 | 7.48 | 7.93 | 9.44 | 11.07 | 12.04 | 12.88 | 13.66 | 14.98 | 16.83 | 18.84 | 20.89 | 23.42 | 25.86 |
| 976.0 | 1.96 | 3.34 | 2.91 | 3.89 | 4.47 | 4.66 | 5.41 | 6.73 | 7.61 | 7.88 | 9.46 | 11.19 | 12 | 12.81 | 13.61 | 15.08 | 16.77 | 18.76 | 20.83 | 23.31 | 25.83 |
| 977.0 | 1.93 | 3.18 | 2.91 | 3.74 | 4.41 | 4.58 | 5.3 | 6.65 | 7.65 | 7.83 | 9.47 | 11.16 | 12.06 | 12.69 | 13.46 | 15 | 16.81 | 18.68 | 20.59 | 23.2 | 25.56 |
| 978.0 | 1.92 | 3.14 | 3.04 | 3.8 | 4.53 | 4.68 | 5.41 | 6.74 | 7.76 | 7.97 | 9.56 | 11.1 | 12.04 | 12.64 | 13.47 | 14.91 | 16.73 | 18.54 | 20.51 | 22.96 | 25.42 |
| 979.0 | 1.79 | 3.09 | 2.94 | 3.8 | 4.45 | 4.59 | 5.52 | 6.6 | 7.65 | 7.83 | 9.58 | 11.03 | 11.83 | 12.34 | 13.31 | 14.7 | 16.74 | 18.35 | 20.24 | 22.76 | 25.32 |
| 980.0 | 1.79 | 2.92 | 2.88 | 3.88 | 4.46 | 4.53 | 5.47 | 6.71 | 7.67 | 7.75 | 9.57 | 11.13 | 11.74 | 12.25 | 13.11 | 14.48 | 16.54 | 18.18 | 19.99 | 22.63 | 25.27 |
| 981.0 | 1.78 | 2.66 | 2.72 | 3.72 | 4.35 | 4.35 | 5.28 | 6.56 | 7.52 | 7.54 | 9.45 | 11.13 | 11.59 | 12.11 | 12.84 | 14.28 | 16.14 | 17.8 | 19.55 | 22.41 | 24.96 |
| 982.0 | 1.93 | 2.65 | 2.91 | 3.64 | 4.38 | 4.31 | 5.25 | 6.66 | 7.57 | 7.52 | 9.39 | 11.12 | 11.48 | 12.06 | 12.69 | 14.32 | 16.07 | 17.68 | 19.55 | 22.34 | 24.78 |
| 983.0 | 1.99 | 2.54 | 2.99 | 3.68 | 4.32 | 4.37 | 5.33 | 6.66 | 7.57 | 7.45 | 9.32 | 11.04 | 11.38 | 11.98 | 12.7 | 14.18 | 15.84 | 17.53 | 19.34 | 22.24 | 24.56 |
| 984.0 | 2.02 | 2.57 | 3.18 | 3.69 | 4.28 | 4.34 | 5.33 | 6.49 | 7.49 | 7.55 | 9.21 | 10.87 | 11.17 | 11.87 | 12.56 | 13.99 | 15.76 | 17.38 | 19.31 | 21.93 | 24.3 |
| 985.0 | 2.17 | 2.72 | 3.31 | 3.64 | 4.34 | 4.4 | 5.39 | 6.54 | 7.65 | 7.64 | 9.29 | 10.92 | 11.16 | 11.74 | 12.51 | 13.91 | 15.63 | 17.32 | 19.22 | 21.61 | 24.03 |
| 986.0 | 2.03 | 2.55 | 3.16 | 3.39 | 4.3 | 4.34 | 5.25 | 6.52 | 7.48 | 7.48 | 9.04 | 10.66 | 10.91 | 11.55 | 12.32 | 13.78 | 15.22 | 17.01 | 18.92 | 21.12 | 23.48 |
| 987.0 | 1.91 | 2.49 | 2.96 | 3.24 | 3.99 | 4.12 | 5.05 | 6.34 | 7.23 | 7.12 | 8.83 | 10.3 | 10.6 | 11.31 | 12.05 | 13.52 | 15.11 | 16.62 | 18.57 | 20.67 | 22.87 |
| 988.0 | 1.83 | 2.37 | 2.76 | 3.06 | 3.85 | 3.91 | 4.8 | 6.2 | 7.14 | 7.05 | 8.45 | 10.03 | 10.12 | 11.02 | 11.7 | 13.34 | 14.65 | 16.28 | 18.11 | 20.25 | 22.35 |
| 989.0 | 1.75 | 2.21 | 2.87 | 3.04 | 3.72 | 3.93 | 4.84 | 6.25 | 7.04 | 6.96 | 8.27 | 9.92 | 9.97 | 10.78 | 11.58 | 13.18 | 14.41 | 16.09 | 17.87 | 19.88 | 22.17 |
| 990.0 | 1.58 | 2.15 | 2.78 | 2.99 | 3.69 | 3.84 | 4.68 | 6.07 | 6.87 | 6.81 | 8.19 | 9.67 | 9.63 | 10.54 | 11.38 | 12.85 | 14.17 | 15.74 | 17.47 | 19.59 | 21.76 |
| 991.0 | 1.49 | 1.38 | 0.48 | 2.46 | 3.06 | 1.62 | 5.3 | 3.65 | 5.74 | 4.95 | 9.77 | 10.77 | 7.39 | 10.43 | 11.27 | 13.83 | 10.8 | 13.25 | 13.99 | 18.15 | 21.58 |
| 992.0 | 4.45 | 2 | 4.47 | 1.74 | 4.6 | 4.99 | 3.58 | 7.94 | 8.02 | 8.03 | 8.4 | 11.15 | 9.62 | 11.98 | 12.15 | 14.91 | 15.35 | 17.54 | 18.85 | 20.42 | 21.65 |
| 993.0 | 3.97 | 1.52 | 4.52 | 3.8 | 3.62 | 4.87 | 6.9 | 7.29 | 7.11 | 7.68 | 9.94 | 9.96 | 10.74 | 11.14 | 14.13 | 12.53 | 14.61 | 16 | 16.68 | 21.22 | 20.74 |
| 994.0 | 2.59 | 4.96 | 5.63 | 2.61 | 4.38 | 4.19 | 6.25 | 7.83 | 6.64 | 8.18 | 6.99 | 10.02 | 9.13 | 9.44 | 12.41 | 12.57 | 15.18 | 16.22 | 19.15 | 18.22 | 20.69 |
| 995.0 | 3.69 | 3.95 | 3.57 | 1.95 | 3.56 | 4.51 | 4.7 | 5.55 | 8.93 | 7.62 | 9.68 | 9.93 | 10.57 | 9.28 | 10.08 | 14.45 | 13.58 | 15.22 | 18.05 | 17.17 | 19.31 |
| 996.0 | 2.16 | 2.15 | 2.87 | 0.38 | 4.18 | 4.54 | 3.59 | 5.93 | 5.74 | 5.84 | 7.09 | 8.41 | 8.5 | 11.29 | 11.16 | 12.58 | 12.89 | 13.44 | 15.89 | 16.55 | 18.61 |
| 997.0 | -0.42 | 0.69 | 0.6 | 2.49 | 0.36 | 2.58 | 3.29 | 3.23 | 3.75 | 3.89 | 6.08 | 4.05 | 6.14 | 7.69 | 8.94 | 10.39 | 12.88 | 13.59 | 14.66 | 14.89 | 16.07 |
| 998.0 | -0.19 | 2.48 | 2.62 | 3.22 | 3.29 | 2.4 | 2.61 | 4.96 | 6.46 | 7.51 | 5.09 | 9.26 | 7.58 | 9.98 | 10.17 | 11.19 | 10.16 | 12.4 | 13.7 | 15.52 | 16.43 |
| 999.0 | 2.2 | -0.13 | 2.65 | 3.47 | 3.5 | 4.46 | 5.77 | 6.42 | 4.9 | 5.82 | 5.8 | 8.08 | 10.14 | 8.34 | 10.79 | 12.1 | 12.26 | 14.31 | 15.83 | 16.63 | 17.98 |
| 1000.0 | -0.72 | 2.05 | 2.82 | 3.64 | 4.25 | 4.19 | 2.35 | 4.12 | 5.15 | 5.7 | 6.1 | 6.44 | 6.71 | 8.67 | 8.65 | 8.99 | 11.66 | 12.29 | 12.75 | 17.03 | 16.84 |